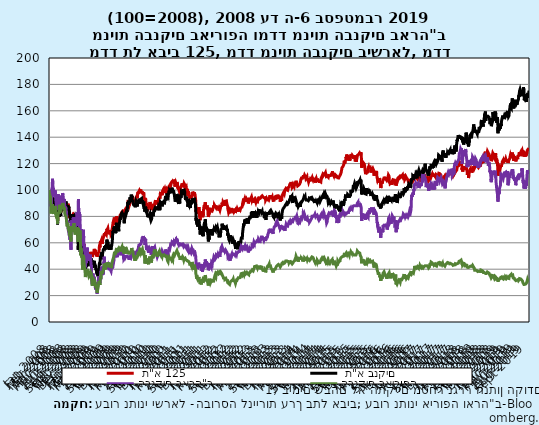
| Category |  ת"א 125 |  ת"א בנקים | הבנקים בארה"ב | הבנקים באירופה |
|---|---|---|---|---|
| 2008-01-01 | 100 | 100 | 100 | 100 |
| 2008-01-02 | 99.621 | 100.549 | 97.506 | 100 |
| 2008-01-03 | 98.326 | 98.384 | 97.212 | 99.514 |
| 2008-01-04 | 98.326 | 98.384 | 93.962 | 97.54 |
| 2008-01-05 | 98.326 | 98.384 | 93.962 | 97.54 |
| 2008-01-06 | 96.03 | 96.803 | 93.962 | 97.54 |
| 2008-01-07 | 95.8 | 96.659 | 94.774 | 97.025 |
| 2008-01-08 | 96.655 | 98.973 | 90.959 | 96.715 |
| 2008-01-09 | 95.683 | 98.561 | 92.573 | 95.43 |
| 2008-01-10 | 93.842 | 96.848 | 94.549 | 94.462 |
| 2008-01-11 | 93.842 | 96.848 | 94.853 | 95.182 |
| 2008-01-12 | 93.842 | 96.848 | 94.853 | 95.182 |
| 2008-01-13 | 94.18 | 96.907 | 94.853 | 95.182 |
| 2008-01-14 | 94.947 | 97.559 | 95.068 | 95.432 |
| 2008-01-15 | 93.327 | 94.711 | 91.072 | 92.147 |
| 2008-01-16 | 92.148 | 94.159 | 93.273 | 90.922 |
| 2008-01-17 | 91.693 | 95.107 | 88.883 | 90.478 |
| 2008-01-18 | 91.693 | 95.107 | 87.573 | 88.197 |
| 2008-01-19 | 91.693 | 95.107 | 87.573 | 88.197 |
| 2008-01-20 | 92.609 | 96.919 | 87.573 | 88.197 |
| 2008-01-21 | 89.87 | 93.609 | 87.573 | 82.165 |
| 2008-01-22 | 88.421 | 92.971 | 90.451 | 86.096 |
| 2008-01-23 | 85.776 | 90.502 | 97.709 | 84.165 |
| 2008-01-24 | 86.411 | 89.916 | 99.526 | 89.274 |
| 2008-01-25 | 86.411 | 89.916 | 97.585 | 88.216 |
| 2008-01-26 | 86.411 | 89.916 | 97.585 | 88.216 |
| 2008-01-27 | 85.432 | 88.485 | 97.585 | 88.216 |
| 2008-01-28 | 85.325 | 89.534 | 101.117 | 87.176 |
| 2008-01-29 | 87.551 | 91.83 | 103.149 | 89.115 |
| 2008-01-30 | 87.364 | 91.728 | 102.878 | 88.731 |
| 2008-01-31 | 86.235 | 92.543 | 106.535 | 87.451 |
| 2008-02-01 | 86.235 | 92.543 | 108.476 | 88.972 |
| 2008-02-02 | 86.235 | 92.543 | 108.476 | 88.972 |
| 2008-02-03 | 88.164 | 94.413 | 108.476 | 88.972 |
| 2008-02-04 | 87.597 | 92.685 | 104.018 | 89.169 |
| 2008-02-05 | 86.625 | 90.806 | 100.147 | 85.636 |
| 2008-02-06 | 86.306 | 90.575 | 99.673 | 85.415 |
| 2008-02-07 | 85.064 | 91.23 | 101.682 | 83.96 |
| 2008-02-08 | 85.064 | 91.23 | 99.345 | 83.55 |
| 2008-02-09 | 85.064 | 91.23 | 99.345 | 83.55 |
| 2008-02-10 | 84.581 | 90.545 | 99.345 | 83.55 |
| 2008-02-11 | 84.777 | 89.811 | 98.239 | 81.788 |
| 2008-02-12 | 86.499 | 91.452 | 99.707 | 84.995 |
| 2008-02-13 | 87.622 | 92.22 | 100.293 | 85.503 |
| 2008-02-14 | 87.96 | 92.601 | 98.047 | 84.735 |
| 2008-02-15 | 87.96 | 92.601 | 98.792 | 82.208 |
| 2008-02-16 | 87.96 | 92.601 | 98.792 | 82.208 |
| 2008-02-17 | 87.208 | 93.166 | 98.792 | 82.208 |
| 2008-02-18 | 87.571 | 93.693 | 98.792 | 84.28 |
| 2008-02-19 | 88.327 | 93.781 | 97.573 | 84.225 |
| 2008-02-20 | 87.262 | 92.357 | 99.142 | 83.462 |
| 2008-02-21 | 88.365 | 92.304 | 97.257 | 83.996 |
| 2008-02-22 | 88.365 | 92.304 | 98.95 | 83.314 |
| 2008-02-23 | 88.365 | 92.304 | 98.95 | 83.314 |
| 2008-02-24 | 89.371 | 92.857 | 98.95 | 83.314 |
| 2008-02-25 | 89.312 | 92.303 | 99.718 | 85.493 |
| 2008-02-26 | 89.816 | 91.622 | 99.819 | 87.949 |
| 2008-02-27 | 89.603 | 91.379 | 100.135 | 87.42 |
| 2008-02-28 | 88.859 | 90.96 | 96.67 | 85.527 |
| 2008-02-29 | 88.859 | 90.96 | 92.63 | 83.925 |
| 2008-03-01 | 88.859 | 90.96 | 92.63 | 83.925 |
| 2008-03-02 | 85.861 | 87.226 | 92.63 | 83.925 |
| 2008-03-03 | 86.21 | 86.438 | 91.196 | 82.537 |
| 2008-03-04 | 85.646 | 86.367 | 90.587 | 81.002 |
| 2008-03-05 | 86.898 | 87.144 | 89.752 | 82.275 |
| 2008-03-06 | 85.786 | 85.005 | 86.512 | 80.041 |
| 2008-03-07 | 85.786 | 85.005 | 86.998 | 79.562 |
| 2008-03-08 | 85.786 | 85.005 | 86.998 | 79.562 |
| 2008-03-09 | 83.374 | 83.485 | 86.998 | 79.562 |
| 2008-03-10 | 83.344 | 83.561 | 85 | 78.541 |
| 2008-03-11 | 82.924 | 83.792 | 92.698 | 81.095 |
| 2008-03-12 | 84.091 | 86.334 | 90.395 | 83.004 |
| 2008-03-13 | 81.034 | 82.682 | 90.756 | 80.725 |
| 2008-03-14 | 81.034 | 82.682 | 86.919 | 79.106 |
| 2008-03-15 | 81.034 | 82.682 | 86.919 | 79.106 |
| 2008-03-16 | 79.251 | 78.948 | 86.919 | 79.106 |
| 2008-03-17 | 76.035 | 73.952 | 85.576 | 74.284 |
| 2008-03-18 | 77.248 | 75.483 | 91.772 | 78.868 |
| 2008-03-19 | 78.801 | 78.44 | 90.214 | 78.596 |
| 2008-03-20 | 78.324 | 81.428 | 96.896 | 79.261 |
| 2008-03-21 | 78.324 | 81.428 | 96.896 | 79.261 |
| 2008-03-22 | 78.324 | 81.428 | 96.896 | 79.261 |
| 2008-03-23 | 81.586 | 85.967 | 96.896 | 79.261 |
| 2008-03-24 | 81.326 | 84.98 | 97.302 | 79.261 |
| 2008-03-25 | 82.655 | 85.179 | 96.874 | 83.026 |
| 2008-03-26 | 82.029 | 84.528 | 92.991 | 81.81 |
| 2008-03-27 | 81.716 | 83.111 | 91.016 | 83.011 |
| 2008-03-28 | 81.716 | 83.111 | 88.781 | 82.539 |
| 2008-03-29 | 81.716 | 83.111 | 88.781 | 82.539 |
| 2008-03-30 | 79.691 | 80.707 | 88.781 | 82.539 |
| 2008-03-31 | 79.754 | 79.631 | 89.097 | 82.001 |
| 2008-04-01 | 81.13 | 80.808 | 95.756 | 86.566 |
| 2008-04-02 | 84.054 | 84.261 | 94.887 | 88.747 |
| 2008-04-03 | 83.463 | 83.242 | 95.169 | 87.11 |
| 2008-04-04 | 83.463 | 83.242 | 93.059 | 87.038 |
| 2008-04-05 | 83.463 | 83.242 | 93.059 | 87.038 |
| 2008-04-06 | 84.615 | 82.761 | 93.059 | 87.038 |
| 2008-04-07 | 84.541 | 81.561 | 94.526 | 88.156 |
| 2008-04-08 | 84.551 | 83.302 | 92.494 | 87.362 |
| 2008-04-09 | 85.366 | 84.587 | 90.813 | 86.139 |
| 2008-04-10 | 85.025 | 83.618 | 90.553 | 85.238 |
| 2008-04-11 | 85.025 | 83.618 | 89.074 | 84.101 |
| 2008-04-12 | 85.025 | 83.618 | 89.074 | 84.101 |
| 2008-04-13 | 83.841 | 81.577 | 89.074 | 84.101 |
| 2008-04-14 | 83.764 | 80.356 | 85.305 | 83.042 |
| 2008-04-15 | 84.788 | 81.697 | 86.433 | 82.978 |
| 2008-04-16 | 86.123 | 83.854 | 89.357 | 84.85 |
| 2008-04-17 | 86.698 | 83.611 | 90.847 | 84.952 |
| 2008-04-18 | 86.698 | 83.611 | 92.133 | 88.049 |
| 2008-04-19 | 86.698 | 83.611 | 92.133 | 88.049 |
| 2008-04-20 | 86.698 | 83.611 | 92.133 | 88.049 |
| 2008-04-21 | 87.359 | 86.01 | 89.605 | 86.373 |
| 2008-04-22 | 87.509 | 85.728 | 89.515 | 85.55 |
| 2008-04-23 | 87.159 | 84.271 | 88.747 | 85.083 |
| 2008-04-24 | 87.55 | 85.02 | 92.619 | 85.617 |
| 2008-04-25 | 87.55 | 85.02 | 94.898 | 87.086 |
| 2008-04-26 | 87.55 | 85.02 | 94.898 | 87.086 |
| 2008-04-27 | 86.879 | 85.617 | 94.898 | 87.086 |
| 2008-04-28 | 86.23 | 85.457 | 95.09 | 87.968 |
| 2008-04-29 | 85.211 | 85.463 | 94.368 | 87.253 |
| 2008-04-30 | 85.607 | 85.892 | 93.476 | 87.648 |
| 2008-05-01 | 85.113 | 86.326 | 97.573 | 87.849 |
| 2008-05-02 | 85.113 | 86.326 | 97.393 | 90.185 |
| 2008-05-03 | 85.113 | 86.326 | 97.393 | 90.185 |
| 2008-05-04 | 87.688 | 89.323 | 97.393 | 90.185 |
| 2008-05-05 | 87.4 | 88.277 | 96.298 | 89.818 |
| 2008-05-06 | 86.688 | 86.65 | 96.986 | 88.726 |
| 2008-05-07 | 86.688 | 86.65 | 93.555 | 89.203 |
| 2008-05-08 | 86.688 | 86.65 | 92.144 | 88.142 |
| 2008-05-09 | 86.688 | 86.65 | 91.456 | 86.64 |
| 2008-05-10 | 86.688 | 86.65 | 91.456 | 86.64 |
| 2008-05-11 | 86.222 | 86.244 | 91.456 | 86.64 |
| 2008-05-12 | 86.835 | 86.574 | 93.318 | 86.642 |
| 2008-05-13 | 86.94 | 87.409 | 91.332 | 86.294 |
| 2008-05-14 | 88.348 | 87.748 | 91.998 | 86.328 |
| 2008-05-15 | 88.216 | 88.656 | 93.228 | 86.311 |
| 2008-05-16 | 88.216 | 88.656 | 91.117 | 85.92 |
| 2008-05-17 | 88.216 | 88.656 | 91.117 | 85.92 |
| 2008-05-18 | 87.72 | 89.375 | 91.117 | 85.92 |
| 2008-05-19 | 88.71 | 90.177 | 90.745 | 85.355 |
| 2008-05-20 | 87.153 | 88.573 | 88.634 | 83.917 |
| 2008-05-21 | 88.146 | 90.599 | 86.591 | 82.003 |
| 2008-05-22 | 87.849 | 89.758 | 87.686 | 82.225 |
| 2008-05-23 | 87.849 | 89.758 | 86.005 | 81.15 |
| 2008-05-24 | 87.849 | 89.758 | 86.005 | 81.15 |
| 2008-05-25 | 86.642 | 88.181 | 86.005 | 81.15 |
| 2008-05-26 | 86.621 | 87.069 | 86.005 | 80.618 |
| 2008-05-27 | 87.841 | 87.944 | 86.851 | 80.501 |
| 2008-05-28 | 88.219 | 88.42 | 85.372 | 80.782 |
| 2008-05-29 | 89.003 | 90.366 | 86.727 | 80.353 |
| 2008-05-30 | 89.003 | 90.366 | 85.632 | 80.835 |
| 2008-05-31 | 89.003 | 90.366 | 85.632 | 80.835 |
| 2008-06-01 | 89.152 | 91.359 | 85.632 | 80.835 |
| 2008-06-02 | 88.222 | 89.62 | 84.063 | 79.314 |
| 2008-06-03 | 88.801 | 89.714 | 83.014 | 79.564 |
| 2008-06-04 | 88.136 | 88.636 | 81.806 | 78.928 |
| 2008-06-05 | 88.873 | 87.595 | 82.935 | 78.799 |
| 2008-06-06 | 88.873 | 87.595 | 78.578 | 76.014 |
| 2008-06-07 | 88.873 | 87.595 | 78.578 | 76.014 |
| 2008-06-08 | 88.873 | 87.595 | 78.578 | 76.014 |
| 2008-06-09 | 88.873 | 87.595 | 76.038 | 74.555 |
| 2008-06-10 | 87.415 | 86.688 | 77.122 | 74.474 |
| 2008-06-11 | 87.37 | 86.136 | 74.334 | 72.367 |
| 2008-06-12 | 87.712 | 87.273 | 75.09 | 74.155 |
| 2008-06-13 | 87.712 | 87.273 | 75.203 | 75.027 |
| 2008-06-14 | 87.712 | 87.273 | 75.203 | 75.027 |
| 2008-06-15 | 88.196 | 88.458 | 75.203 | 75.027 |
| 2008-06-16 | 88.24 | 87.788 | 76.287 | 74.615 |
| 2008-06-17 | 89.564 | 89.137 | 73.476 | 75.297 |
| 2008-06-18 | 89.105 | 87.58 | 71.343 | 73.409 |
| 2008-06-19 | 89.105 | 87.58 | 71.637 | 72.202 |
| 2008-06-20 | 89.105 | 87.58 | 70.79 | 70.939 |
| 2008-06-21 | 89.105 | 87.58 | 70.79 | 70.939 |
| 2008-06-22 | 87.878 | 86.958 | 70.79 | 70.939 |
| 2008-06-23 | 88.426 | 87.544 | 68.702 | 70.09 |
| 2008-06-24 | 87.366 | 86.195 | 70.418 | 70.288 |
| 2008-06-25 | 87.891 | 87.387 | 70.677 | 72.41 |
| 2008-06-26 | 85.964 | 85.052 | 67.946 | 69.191 |
| 2008-06-27 | 85.964 | 85.052 | 66.896 | 68.619 |
| 2008-06-28 | 85.964 | 85.052 | 66.896 | 68.619 |
| 2008-06-29 | 84.659 | 84.862 | 66.896 | 68.619 |
| 2008-06-30 | 84.863 | 84.371 | 65.609 | 68.011 |
| 2008-07-01 | 84.863 | 84.371 | 66.874 | 65.992 |
| 2008-07-02 | 83.071 | 83.021 | 65.44 | 66.314 |
| 2008-07-03 | 80.044 | 80.646 | 64.673 | 67.93 |
| 2008-07-04 | 80.044 | 80.646 | 64.673 | 65.916 |
| 2008-07-05 | 80.044 | 80.646 | 64.673 | 65.916 |
| 2008-07-06 | 78.762 | 79.846 | 64.673 | 65.916 |
| 2008-07-07 | 79.948 | 80.483 | 62.269 | 65.975 |
| 2008-07-08 | 79.164 | 79.232 | 67.02 | 64.702 |
| 2008-07-09 | 80.065 | 79.7 | 63.194 | 66.807 |
| 2008-07-10 | 79.656 | 77.829 | 63.115 | 65.687 |
| 2008-07-11 | 79.656 | 77.829 | 61.704 | 62.836 |
| 2008-07-12 | 79.656 | 77.829 | 61.704 | 62.836 |
| 2008-07-13 | 77.938 | 77.71 | 61.704 | 62.836 |
| 2008-07-14 | 78.752 | 78.55 | 56.445 | 63.455 |
| 2008-07-15 | 76.847 | 76.729 | 54.707 | 61.04 |
| 2008-07-16 | 76.596 | 75.275 | 64.153 | 62.013 |
| 2008-07-17 | 78.745 | 78.92 | 70.192 | 65.541 |
| 2008-07-18 | 78.745 | 78.92 | 70.858 | 68.762 |
| 2008-07-19 | 78.745 | 78.92 | 70.858 | 68.762 |
| 2008-07-20 | 79.715 | 81.259 | 70.858 | 68.762 |
| 2008-07-21 | 80.699 | 80.199 | 70.135 | 69.406 |
| 2008-07-22 | 80.215 | 78.89 | 76.4 | 68.428 |
| 2008-07-23 | 81.612 | 80.775 | 77.19 | 72.622 |
| 2008-07-24 | 80.779 | 80.451 | 72.02 | 72.171 |
| 2008-07-25 | 80.779 | 80.451 | 71.332 | 71.006 |
| 2008-07-26 | 80.779 | 80.451 | 71.332 | 71.006 |
| 2008-07-27 | 81.195 | 81.23 | 71.332 | 71.006 |
| 2008-07-28 | 80.675 | 79.809 | 68.093 | 69.132 |
| 2008-07-29 | 80.539 | 80.682 | 74.018 | 68.726 |
| 2008-07-30 | 81.323 | 81.687 | 75.824 | 69.985 |
| 2008-07-31 | 81.473 | 80.372 | 74.661 | 70.071 |
| 2008-08-01 | 81.473 | 80.372 | 75.869 | 69.573 |
| 2008-08-02 | 81.473 | 80.372 | 75.869 | 69.573 |
| 2008-08-03 | 80.668 | 79.298 | 75.869 | 69.573 |
| 2008-08-04 | 79.56 | 77.743 | 74.774 | 68.426 |
| 2008-08-05 | 80.43 | 80.175 | 78.871 | 72.35 |
| 2008-08-06 | 79.885 | 79.323 | 78.454 | 73.194 |
| 2008-08-07 | 79.77 | 79.753 | 74.526 | 72.72 |
| 2008-08-08 | 79.77 | 79.753 | 77.099 | 73.208 |
| 2008-08-09 | 79.77 | 79.753 | 77.099 | 73.208 |
| 2008-08-10 | 79.77 | 79.753 | 77.099 | 73.208 |
| 2008-08-11 | 79.844 | 80.07 | 79.537 | 74.808 |
| 2008-08-12 | 79.548 | 80.13 | 74.413 | 74.005 |
| 2008-08-13 | 78.843 | 78.511 | 71.354 | 70.417 |
| 2008-08-14 | 79.975 | 79.022 | 73.612 | 70.681 |
| 2008-08-15 | 79.975 | 79.022 | 74.684 | 71.122 |
| 2008-08-16 | 79.975 | 79.022 | 74.684 | 71.122 |
| 2008-08-17 | 80.442 | 80.565 | 74.684 | 71.122 |
| 2008-08-18 | 80.747 | 79.717 | 71.761 | 70.872 |
| 2008-08-19 | 80.054 | 78.602 | 69.323 | 67.804 |
| 2008-08-20 | 80.96 | 78.489 | 70.903 | 67.632 |
| 2008-08-21 | 80.213 | 78.652 | 70.068 | 66.199 |
| 2008-08-22 | 80.213 | 78.652 | 72.28 | 68.3 |
| 2008-08-23 | 80.213 | 78.652 | 72.28 | 68.3 |
| 2008-08-24 | 81.184 | 80.311 | 72.28 | 68.3 |
| 2008-08-25 | 81.072 | 80.195 | 69.819 | 67.711 |
| 2008-08-26 | 80.6 | 79.036 | 70.271 | 67.751 |
| 2008-08-27 | 80.284 | 77.868 | 71.354 | 67.749 |
| 2008-08-28 | 79.27 | 76.017 | 74.537 | 69.923 |
| 2008-08-29 | 79.27 | 76.017 | 74.526 | 70.417 |
| 2008-08-30 | 79.27 | 76.017 | 74.526 | 70.417 |
| 2008-08-31 | 78.914 | 74.817 | 74.526 | 70.417 |
| 2008-09-01 | 78.142 | 73.666 | 74.526 | 70.257 |
| 2008-09-02 | 78.902 | 75.195 | 76.67 | 71.909 |
| 2008-09-03 | 77.841 | 74.177 | 77.822 | 71.38 |
| 2008-09-04 | 77.417 | 72.387 | 74.108 | 68.831 |
| 2008-09-05 | 77.417 | 72.387 | 77.686 | 67.315 |
| 2008-09-06 | 77.417 | 72.387 | 77.686 | 67.315 |
| 2008-09-07 | 78.537 | 75.328 | 77.686 | 67.315 |
| 2008-09-08 | 78.234 | 74.686 | 83.07 | 71.931 |
| 2008-09-09 | 76.681 | 72.815 | 78.126 | 72.529 |
| 2008-09-10 | 75.98 | 72.5 | 77.02 | 70.731 |
| 2008-09-11 | 73.976 | 69.937 | 79.142 | 69.415 |
| 2008-09-12 | 73.976 | 69.937 | 80.147 | 70.36 |
| 2008-09-13 | 73.976 | 69.937 | 80.147 | 70.36 |
| 2008-09-14 | 73.296 | 68.014 | 80.147 | 70.36 |
| 2008-09-15 | 72.189 | 66.302 | 73.397 | 65.999 |
| 2008-09-16 | 68.058 | 62.48 | 78.736 | 63.16 |
| 2008-09-17 | 65.962 | 57.285 | 72.698 | 60.542 |
| 2008-09-18 | 65.164 | 54.695 | 82.731 | 60.399 |
| 2008-09-19 | 65.164 | 54.695 | 93.172 | 70.944 |
| 2008-09-20 | 65.164 | 54.695 | 93.172 | 70.944 |
| 2008-09-21 | 71.86 | 64.795 | 93.172 | 70.944 |
| 2008-09-22 | 68.686 | 61.433 | 83.386 | 68.445 |
| 2008-09-23 | 67.784 | 60.426 | 80.801 | 66.607 |
| 2008-09-24 | 68.115 | 60.509 | 79.549 | 66.915 |
| 2008-09-25 | 69.847 | 63.248 | 81.275 | 68.581 |
| 2008-09-26 | 69.847 | 63.248 | 83.363 | 67.275 |
| 2008-09-27 | 69.847 | 63.248 | 83.363 | 67.275 |
| 2008-09-28 | 69.077 | 62.209 | 83.363 | 67.275 |
| 2008-09-29 | 69.077 | 62.209 | 66.005 | 62.063 |
| 2008-09-30 | 69.077 | 62.209 | 76.422 | 62.757 |
| 2008-10-01 | 69.077 | 62.209 | 81.716 | 64.674 |
| 2008-10-02 | 65.388 | 59.755 | 79.131 | 65.231 |
| 2008-10-03 | 65.388 | 59.755 | 76.219 | 69.308 |
| 2008-10-04 | 65.388 | 59.755 | 76.219 | 69.308 |
| 2008-10-05 | 60.76 | 55.159 | 76.219 | 69.308 |
| 2008-10-06 | 58.848 | 53.011 | 71.975 | 63.1 |
| 2008-10-07 | 61.565 | 56.438 | 64.3 | 60.635 |
| 2008-10-08 | 61.565 | 56.438 | 62.449 | 56.814 |
| 2008-10-09 | 61.565 | 56.438 | 55.023 | 56.387 |
| 2008-10-10 | 61.565 | 56.438 | 59.684 | 50.527 |
| 2008-10-11 | 61.565 | 56.438 | 59.684 | 50.527 |
| 2008-10-12 | 58.742 | 55.39 | 59.684 | 50.527 |
| 2008-10-13 | 58.742 | 55.39 | 62.731 | 54.379 |
| 2008-10-14 | 58.742 | 55.39 | 70.361 | 55.781 |
| 2008-10-15 | 59.789 | 55.817 | 65.271 | 52.251 |
| 2008-10-16 | 57.932 | 54.56 | 66.964 | 49.006 |
| 2008-10-17 | 57.932 | 54.56 | 64.605 | 49.938 |
| 2008-10-18 | 57.932 | 54.56 | 64.605 | 49.938 |
| 2008-10-19 | 61.187 | 57.902 | 64.605 | 49.938 |
| 2008-10-20 | 61.187 | 57.902 | 65.35 | 51.359 |
| 2008-10-21 | 61.187 | 57.902 | 64.966 | 51.385 |
| 2008-10-22 | 58.933 | 54.827 | 61.208 | 48.732 |
| 2008-10-23 | 58.839 | 53.854 | 60.316 | 47.723 |
| 2008-10-24 | 58.839 | 53.854 | 58.014 | 43.542 |
| 2008-10-25 | 58.839 | 53.854 | 58.014 | 43.542 |
| 2008-10-26 | 56.968 | 52.695 | 58.014 | 43.542 |
| 2008-10-27 | 55.008 | 50.433 | 57.698 | 41.041 |
| 2008-10-28 | 54.104 | 49.413 | 65.203 | 39.615 |
| 2008-10-29 | 55.284 | 49.162 | 62.856 | 44.29 |
| 2008-10-30 | 55.488 | 48.442 | 63.262 | 46.627 |
| 2008-10-31 | 55.488 | 48.442 | 66.061 | 47.726 |
| 2008-11-01 | 55.488 | 48.442 | 66.061 | 47.726 |
| 2008-11-02 | 57.335 | 50.238 | 66.061 | 47.726 |
| 2008-11-03 | 58.121 | 51.642 | 66.479 | 47.478 |
| 2008-11-04 | 60.577 | 55.229 | 69.921 | 50.36 |
| 2008-11-05 | 59.856 | 55.16 | 63.815 | 49.864 |
| 2008-11-06 | 57.082 | 53.691 | 60.056 | 46.999 |
| 2008-11-07 | 57.082 | 53.691 | 60.632 | 47.223 |
| 2008-11-08 | 57.082 | 53.691 | 60.632 | 47.223 |
| 2008-11-09 | 59.043 | 55.668 | 60.632 | 47.223 |
| 2008-11-10 | 58.952 | 56.612 | 58.871 | 46.481 |
| 2008-11-11 | 56.679 | 54.698 | 57.788 | 43.158 |
| 2008-11-12 | 54.186 | 51.638 | 54.131 | 41.217 |
| 2008-11-13 | 51.147 | 48.57 | 57.709 | 40.459 |
| 2008-11-14 | 51.147 | 48.57 | 54.628 | 40.667 |
| 2008-11-15 | 51.147 | 48.57 | 54.628 | 40.667 |
| 2008-11-16 | 50.469 | 47.318 | 54.628 | 40.667 |
| 2008-11-17 | 49.591 | 45.53 | 52.054 | 38.826 |
| 2008-11-18 | 50.259 | 45.758 | 51.558 | 37.865 |
| 2008-11-19 | 50.308 | 45.961 | 45.847 | 35.052 |
| 2008-11-20 | 47.629 | 44.237 | 41.445 | 34.044 |
| 2008-11-21 | 47.629 | 44.237 | 41.659 | 33.669 |
| 2008-11-22 | 47.629 | 44.237 | 41.659 | 33.669 |
| 2008-11-23 | 44.492 | 40.494 | 41.659 | 33.669 |
| 2008-11-24 | 47.504 | 42.749 | 49.041 | 36.461 |
| 2008-11-25 | 49.884 | 45.853 | 50.406 | 38.111 |
| 2008-11-26 | 48.592 | 45.391 | 52.381 | 38.221 |
| 2008-11-27 | 49.447 | 44.275 | 52.381 | 39.82 |
| 2008-11-28 | 49.447 | 44.275 | 54.029 | 40.307 |
| 2008-11-29 | 49.447 | 44.275 | 54.029 | 40.307 |
| 2008-11-30 | 50.955 | 45.268 | 54.029 | 40.307 |
| 2008-12-01 | 48.818 | 43.134 | 44.616 | 37.451 |
| 2008-12-02 | 49.345 | 43.068 | 48.115 | 38.154 |
| 2008-12-03 | 48.495 | 41.899 | 50.711 | 38.08 |
| 2008-12-04 | 49.96 | 43.593 | 50.045 | 38.285 |
| 2008-12-05 | 49.96 | 43.593 | 53.409 | 36.862 |
| 2008-12-06 | 49.96 | 43.593 | 53.409 | 36.862 |
| 2008-12-07 | 51.488 | 46.124 | 53.409 | 36.862 |
| 2008-12-08 | 53.442 | 49.327 | 56.354 | 40.185 |
| 2008-12-09 | 53.664 | 49.869 | 53.307 | 40.621 |
| 2008-12-10 | 53.905 | 50.821 | 52.754 | 40.519 |
| 2008-12-11 | 52.872 | 49.465 | 48.025 | 39.92 |
| 2008-12-12 | 52.872 | 49.465 | 48.747 | 37.768 |
| 2008-12-13 | 52.872 | 49.465 | 48.747 | 37.768 |
| 2008-12-14 | 50.887 | 47.367 | 48.747 | 37.768 |
| 2008-12-15 | 49.615 | 45.826 | 46.761 | 37.067 |
| 2008-12-16 | 50.883 | 46.642 | 51.614 | 37.403 |
| 2008-12-17 | 51.346 | 47.615 | 50.767 | 35.908 |
| 2008-12-18 | 51.79 | 47.877 | 49.345 | 35.303 |
| 2008-12-19 | 51.79 | 47.877 | 48.894 | 35.319 |
| 2008-12-20 | 51.79 | 47.877 | 48.894 | 35.319 |
| 2008-12-21 | 50.534 | 46.455 | 48.894 | 35.319 |
| 2008-12-22 | 49.708 | 44.985 | 47.302 | 34.406 |
| 2008-12-23 | 48.515 | 43.644 | 46.354 | 34.645 |
| 2008-12-24 | 47.307 | 42.386 | 47.506 | 34.659 |
| 2008-12-25 | 47.468 | 42.799 | 47.506 | 34.659 |
| 2008-12-26 | 47.468 | 42.799 | 47.348 | 34.659 |
| 2008-12-27 | 47.468 | 42.799 | 47.348 | 34.659 |
| 2008-12-28 | 46.552 | 41.672 | 47.348 | 34.659 |
| 2008-12-29 | 47.019 | 41.665 | 46.772 | 34.981 |
| 2008-12-30 | 47.597 | 42.816 | 48.465 | 35.643 |
| 2008-12-31 | 48.476 | 43.872 | 50.023 | 36.025 |
| 2009-01-01 | 50.257 | 44.847 | 50.023 | 36.025 |
| 2009-01-02 | 50.257 | 44.847 | 50.993 | 37.231 |
| 2009-01-03 | 50.257 | 44.847 | 50.993 | 37.231 |
| 2009-01-04 | 50.76 | 45.698 | 50.993 | 37.231 |
| 2009-01-05 | 51.063 | 46.757 | 49.12 | 37.992 |
| 2009-01-06 | 53.129 | 48.474 | 49.786 | 38.662 |
| 2009-01-07 | 52.477 | 48.404 | 47.133 | 38.545 |
| 2009-01-08 | 51.122 | 46.434 | 46.964 | 38.151 |
| 2009-01-09 | 51.122 | 46.434 | 44.977 | 37.973 |
| 2009-01-10 | 51.122 | 46.434 | 44.977 | 37.973 |
| 2009-01-11 | 52.528 | 47.982 | 44.977 | 37.973 |
| 2009-01-12 | 52.156 | 47.672 | 42.235 | 37.67 |
| 2009-01-13 | 51.912 | 47.363 | 43.002 | 36.571 |
| 2009-01-14 | 50.242 | 45.399 | 40.406 | 33.693 |
| 2009-01-15 | 50.739 | 45.779 | 37.156 | 32.671 |
| 2009-01-16 | 50.739 | 45.779 | 35.621 | 32.203 |
| 2009-01-17 | 50.739 | 45.779 | 35.621 | 32.203 |
| 2009-01-18 | 52.394 | 46.917 | 35.621 | 32.203 |
| 2009-01-19 | 51.586 | 45.361 | 35.621 | 29.569 |
| 2009-01-20 | 51.619 | 45.057 | 28.6 | 27.423 |
| 2009-01-21 | 50.097 | 42.344 | 32.765 | 28.119 |
| 2009-01-22 | 49.224 | 41.131 | 30.824 | 28.232 |
| 2009-01-23 | 49.224 | 41.131 | 32.099 | 27.888 |
| 2009-01-24 | 49.224 | 41.131 | 32.099 | 27.888 |
| 2009-01-25 | 49.745 | 40.677 | 32.099 | 27.888 |
| 2009-01-26 | 50.697 | 42.268 | 31.129 | 29.934 |
| 2009-01-27 | 50.619 | 41.176 | 32.144 | 30.086 |
| 2009-01-28 | 52.227 | 42.758 | 36.772 | 33.512 |
| 2009-01-29 | 51.559 | 41.961 | 33.725 | 32.308 |
| 2009-01-30 | 51.559 | 41.961 | 32.415 | 32.516 |
| 2009-01-31 | 51.559 | 41.961 | 32.415 | 32.516 |
| 2009-02-01 | 51.362 | 41.881 | 32.415 | 32.516 |
| 2009-02-02 | 51.051 | 41.526 | 32.19 | 30.794 |
| 2009-02-03 | 51.951 | 43.112 | 30.53 | 30.983 |
| 2009-02-04 | 53.138 | 44.46 | 30.079 | 32.077 |
| 2009-02-05 | 53.571 | 44.044 | 30.621 | 31.641 |
| 2009-02-06 | 53.571 | 44.044 | 34.278 | 32.42 |
| 2009-02-07 | 53.571 | 44.044 | 34.278 | 32.42 |
| 2009-02-08 | 55.391 | 46.333 | 34.278 | 32.42 |
| 2009-02-09 | 55.362 | 46.396 | 35.034 | 32.754 |
| 2009-02-10 | 55.362 | 46.396 | 30.181 | 31.893 |
| 2009-02-11 | 53.927 | 44.348 | 31.998 | 31.405 |
| 2009-02-12 | 53.762 | 43.881 | 31.117 | 30.918 |
| 2009-02-13 | 53.762 | 43.881 | 29.47 | 30.492 |
| 2009-02-14 | 53.762 | 43.881 | 29.47 | 30.492 |
| 2009-02-15 | 53.774 | 43.458 | 29.47 | 30.492 |
| 2009-02-16 | 54.065 | 44.164 | 29.47 | 29.495 |
| 2009-02-17 | 53.311 | 42.953 | 26.512 | 27.686 |
| 2009-02-18 | 54.125 | 43.335 | 26.433 | 27.852 |
| 2009-02-19 | 53.879 | 42.647 | 24.639 | 27.934 |
| 2009-02-20 | 53.879 | 42.647 | 24.492 | 26.129 |
| 2009-02-21 | 53.879 | 42.647 | 24.492 | 26.129 |
| 2009-02-22 | 51.786 | 40.303 | 24.492 | 26.129 |
| 2009-02-23 | 51.822 | 39.894 | 24.492 | 25.762 |
| 2009-02-24 | 50.862 | 39.226 | 27.822 | 25.578 |
| 2009-02-25 | 51.318 | 39.79 | 28.499 | 26.079 |
| 2009-02-26 | 51.879 | 40.339 | 29.876 | 28.224 |
| 2009-02-27 | 51.879 | 40.339 | 27.269 | 26.861 |
| 2009-02-28 | 51.879 | 40.339 | 27.269 | 26.861 |
| 2009-03-01 | 49.834 | 38.246 | 27.269 | 26.861 |
| 2009-03-02 | 49.767 | 37.017 | 25.519 | 24.179 |
| 2009-03-03 | 49.941 | 37.124 | 25.102 | 23.711 |
| 2009-03-04 | 51.103 | 38.104 | 24.278 | 24.522 |
| 2009-03-05 | 49.664 | 36.369 | 21.411 | 22.81 |
| 2009-03-06 | 49.664 | 36.369 | 21.016 | 22.028 |
| 2009-03-07 | 49.664 | 36.369 | 21.016 | 22.028 |
| 2009-03-08 | 49.473 | 36.212 | 21.016 | 22.028 |
| 2009-03-09 | 49.509 | 35.61 | 22.122 | 21.53 |
| 2009-03-10 | 49.509 | 35.61 | 25.564 | 24.255 |
| 2009-03-11 | 50.734 | 36.795 | 26.343 | 24.627 |
| 2009-03-12 | 50.487 | 35.808 | 29.3 | 25.361 |
| 2009-03-13 | 50.487 | 35.808 | 28.883 | 26.007 |
| 2009-03-14 | 50.487 | 35.808 | 28.883 | 26.007 |
| 2009-03-15 | 52.226 | 37.94 | 28.883 | 26.007 |
| 2009-03-16 | 52.242 | 38.178 | 28.837 | 27.454 |
| 2009-03-17 | 52.239 | 39.01 | 30.598 | 27.614 |
| 2009-03-18 | 52.181 | 39.296 | 34.007 | 27.919 |
| 2009-03-19 | 52.389 | 39.95 | 30.926 | 28.961 |
| 2009-03-20 | 52.389 | 39.95 | 29.391 | 28.727 |
| 2009-03-21 | 52.389 | 39.95 | 29.391 | 28.727 |
| 2009-03-22 | 53.03 | 41.052 | 29.391 | 28.727 |
| 2009-03-23 | 54.268 | 42.681 | 34.853 | 30.93 |
| 2009-03-24 | 54.371 | 42.453 | 32.28 | 30.525 |
| 2009-03-25 | 56.237 | 43.708 | 33.871 | 30.332 |
| 2009-03-26 | 58.205 | 45.098 | 34.029 | 31.002 |
| 2009-03-27 | 58.205 | 45.098 | 32.912 | 30.718 |
| 2009-03-28 | 58.205 | 45.098 | 32.912 | 30.718 |
| 2009-03-29 | 58.532 | 45.788 | 32.912 | 30.718 |
| 2009-03-30 | 56.545 | 43.115 | 29.526 | 28.098 |
| 2009-03-31 | 57.246 | 44.142 | 31.761 | 29.652 |
| 2009-04-01 | 57.256 | 44.253 | 32.912 | 30.799 |
| 2009-04-02 | 60.15 | 48.21 | 33.499 | 33.662 |
| 2009-04-03 | 60.15 | 48.21 | 34.752 | 33.569 |
| 2009-04-04 | 60.15 | 48.21 | 34.752 | 33.569 |
| 2009-04-05 | 61.05 | 49.973 | 34.752 | 33.569 |
| 2009-04-06 | 59.513 | 48.739 | 33.42 | 33.472 |
| 2009-04-07 | 59.441 | 48.53 | 32.257 | 32.675 |
| 2009-04-08 | 59.441 | 48.53 | 31.772 | 33.042 |
| 2009-04-09 | 59.441 | 48.53 | 38.16 | 35.236 |
| 2009-04-10 | 59.441 | 48.53 | 38.16 | 35.236 |
| 2009-04-11 | 59.441 | 48.53 | 38.16 | 35.236 |
| 2009-04-12 | 61.733 | 51.016 | 38.16 | 35.236 |
| 2009-04-13 | 61.577 | 51.083 | 41.163 | 35.236 |
| 2009-04-14 | 61.577 | 51.083 | 37.81 | 37.129 |
| 2009-04-15 | 61.577 | 51.083 | 39.74 | 36.473 |
| 2009-04-16 | 62.648 | 53.001 | 40.587 | 37.67 |
| 2009-04-17 | 62.648 | 53.001 | 41.975 | 38.752 |
| 2009-04-18 | 62.648 | 53.001 | 41.975 | 38.752 |
| 2009-04-19 | 61.708 | 52.014 | 41.975 | 38.752 |
| 2009-04-20 | 60.199 | 49.685 | 35.53 | 36.623 |
| 2009-04-21 | 59.258 | 47.558 | 38.42 | 36.061 |
| 2009-04-22 | 60.174 | 48.702 | 36.546 | 37.496 |
| 2009-04-23 | 61.533 | 51.706 | 37.901 | 37.219 |
| 2009-04-24 | 61.533 | 51.706 | 38.995 | 38.228 |
| 2009-04-25 | 61.533 | 51.706 | 38.995 | 38.228 |
| 2009-04-26 | 62.984 | 53.087 | 38.995 | 38.228 |
| 2009-04-27 | 62.59 | 53.289 | 37.088 | 38.18 |
| 2009-04-28 | 62.59 | 53.289 | 36.005 | 37.203 |
| 2009-04-29 | 62.59 | 53.289 | 37.81 | 38.621 |
| 2009-04-30 | 64.044 | 54.908 | 37.009 | 40.152 |
| 2009-05-01 | 64.044 | 54.908 | 36.264 | 40.216 |
| 2009-05-02 | 64.044 | 54.908 | 36.264 | 40.216 |
| 2009-05-03 | 64.332 | 55.603 | 36.264 | 40.216 |
| 2009-05-04 | 64.885 | 55.478 | 41.591 | 40.431 |
| 2009-05-05 | 65.228 | 55.304 | 40.926 | 41.899 |
| 2009-05-06 | 66.043 | 55.144 | 45.621 | 42.853 |
| 2009-05-07 | 66.122 | 55.234 | 44.041 | 42.507 |
| 2009-05-08 | 66.122 | 55.234 | 49.368 | 44.2 |
| 2009-05-09 | 66.122 | 55.234 | 49.368 | 44.2 |
| 2009-05-10 | 67.114 | 57.571 | 49.368 | 44.2 |
| 2009-05-11 | 65.264 | 56.023 | 45.869 | 43.78 |
| 2009-05-12 | 65.97 | 56.571 | 43.95 | 42.633 |
| 2009-05-13 | 64.666 | 55.621 | 41.095 | 39.837 |
| 2009-05-14 | 64.736 | 54.832 | 42.63 | 40.34 |
| 2009-05-15 | 64.736 | 54.832 | 41.366 | 40.786 |
| 2009-05-16 | 64.736 | 54.832 | 41.366 | 40.786 |
| 2009-05-17 | 64.58 | 54.797 | 41.366 | 40.786 |
| 2009-05-18 | 65.664 | 55.977 | 44.481 | 42.855 |
| 2009-05-19 | 67.403 | 58.134 | 42.957 | 44.276 |
| 2009-05-20 | 68.296 | 58.54 | 41.749 | 43.983 |
| 2009-05-21 | 67.446 | 57.114 | 41.038 | 42.962 |
| 2009-05-22 | 67.446 | 57.114 | 40.271 | 42.986 |
| 2009-05-23 | 67.446 | 57.114 | 40.271 | 42.986 |
| 2009-05-24 | 67.146 | 57.204 | 40.271 | 42.986 |
| 2009-05-25 | 67.487 | 57.608 | 40.271 | 43.029 |
| 2009-05-26 | 66.657 | 56.634 | 41.885 | 43.306 |
| 2009-05-27 | 67.978 | 58.335 | 40.282 | 43.823 |
| 2009-05-28 | 67.978 | 58.335 | 41.445 | 43.158 |
| 2009-05-29 | 67.978 | 58.335 | 42.235 | 43.685 |
| 2009-05-30 | 67.978 | 58.335 | 42.235 | 43.685 |
| 2009-05-31 | 69.436 | 60.275 | 42.235 | 43.685 |
| 2009-06-01 | 70.675 | 62.432 | 42.009 | 44.886 |
| 2009-06-02 | 70.934 | 62.274 | 41.4 | 44.352 |
| 2009-06-03 | 69.734 | 60.405 | 40.79 | 43.239 |
| 2009-06-04 | 69.566 | 60.259 | 42.754 | 43.32 |
| 2009-06-05 | 69.566 | 60.259 | 41.84 | 43.592 |
| 2009-06-06 | 69.566 | 60.259 | 41.84 | 43.592 |
| 2009-06-07 | 69.976 | 59.889 | 41.84 | 43.592 |
| 2009-06-08 | 69.727 | 58.927 | 42.381 | 43.151 |
| 2009-06-09 | 70.951 | 60.757 | 42.573 | 43.401 |
| 2009-06-10 | 70.276 | 59.442 | 42.032 | 44.438 |
| 2009-06-11 | 69.773 | 58.643 | 43.104 | 45.339 |
| 2009-06-12 | 69.773 | 58.643 | 43.589 | 45.23 |
| 2009-06-13 | 69.773 | 58.643 | 43.589 | 45.23 |
| 2009-06-14 | 69.95 | 58.269 | 43.589 | 45.23 |
| 2009-06-15 | 67.729 | 55.516 | 42.483 | 43.72 |
| 2009-06-16 | 68.121 | 56.747 | 41.456 | 43.196 |
| 2009-06-17 | 66.439 | 55.204 | 40.09 | 41.947 |
| 2009-06-18 | 66.334 | 54.771 | 41.275 | 42.619 |
| 2009-06-19 | 66.334 | 54.771 | 42.122 | 43.048 |
| 2009-06-20 | 66.334 | 54.771 | 42.122 | 43.048 |
| 2009-06-21 | 68.045 | 56.321 | 42.122 | 43.048 |
| 2009-06-22 | 67.328 | 54.789 | 39.323 | 41.544 |
| 2009-06-23 | 67.256 | 54.662 | 39.707 | 40.967 |
| 2009-06-24 | 68.559 | 56.345 | 40.158 | 42.574 |
| 2009-06-25 | 67.293 | 54.753 | 40.926 | 41.966 |
| 2009-06-26 | 67.293 | 54.753 | 41.095 | 42.042 |
| 2009-06-27 | 67.293 | 54.753 | 41.095 | 42.042 |
| 2009-06-28 | 68.742 | 56.287 | 41.095 | 42.042 |
| 2009-06-29 | 69.605 | 58.486 | 41.749 | 42.974 |
| 2009-06-30 | 68.857 | 57.436 | 41.14 | 42.6 |
| 2009-07-01 | 69.768 | 58.402 | 40.847 | 43.232 |
| 2009-07-02 | 69.028 | 57.313 | 39.616 | 42.002 |
| 2009-07-03 | 69.028 | 57.313 | 39.616 | 42.54 |
| 2009-07-04 | 69.028 | 57.313 | 39.616 | 42.54 |
| 2009-07-05 | 67.861 | 55.896 | 39.616 | 42.54 |
| 2009-07-06 | 67 | 54.919 | 39.582 | 41.804 |
| 2009-07-07 | 67.584 | 54.983 | 39.289 | 41.754 |
| 2009-07-08 | 67.476 | 55.143 | 38.476 | 40.855 |
| 2009-07-09 | 67.385 | 55.848 | 39.21 | 41.425 |
| 2009-07-10 | 67.385 | 55.848 | 38.691 | 40.991 |
| 2009-07-11 | 67.385 | 55.848 | 38.691 | 40.991 |
| 2009-07-12 | 66.422 | 55.82 | 38.691 | 40.991 |
| 2009-07-13 | 67.557 | 57.78 | 41.219 | 41.849 |
| 2009-07-14 | 68.484 | 57.8 | 41.095 | 42.953 |
| 2009-07-15 | 69.788 | 58.955 | 42.844 | 44.557 |
| 2009-07-16 | 69.933 | 59.24 | 42.777 | 44.886 |
| 2009-07-17 | 69.933 | 59.24 | 41.851 | 45.036 |
| 2009-07-18 | 69.933 | 59.24 | 41.851 | 45.036 |
| 2009-07-19 | 71.171 | 61.043 | 41.851 | 45.036 |
| 2009-07-20 | 71.284 | 61.792 | 41.828 | 45.88 |
| 2009-07-21 | 72.593 | 65.034 | 40.53 | 45.656 |
| 2009-07-22 | 72.244 | 65.091 | 40.914 | 45.628 |
| 2009-07-23 | 73.114 | 66.776 | 42.122 | 47.127 |
| 2009-07-24 | 73.114 | 66.776 | 42.122 | 47.399 |
| 2009-07-25 | 73.114 | 66.776 | 42.122 | 47.399 |
| 2009-07-26 | 75.457 | 69.052 | 42.122 | 47.399 |
| 2009-07-27 | 75.09 | 67.498 | 43.431 | 47.728 |
| 2009-07-28 | 75.276 | 67.14 | 43.476 | 46.941 |
| 2009-07-29 | 76.027 | 68.627 | 43.646 | 47.347 |
| 2009-07-30 | 76.027 | 68.627 | 45.135 | 48.756 |
| 2009-07-31 | 76.027 | 68.627 | 45.643 | 49.142 |
| 2009-08-01 | 76.027 | 68.627 | 45.643 | 49.142 |
| 2009-08-02 | 77.658 | 70.563 | 45.643 | 49.142 |
| 2009-08-03 | 77.762 | 71.447 | 46.84 | 50.596 |
| 2009-08-04 | 77.483 | 70.547 | 48.081 | 50.317 |
| 2009-08-05 | 78.219 | 71.36 | 49.786 | 50.56 |
| 2009-08-06 | 79.223 | 72.563 | 49.537 | 51.981 |
| 2009-08-07 | 79.223 | 72.563 | 51.298 | 52.892 |
| 2009-08-08 | 79.223 | 72.563 | 51.298 | 52.892 |
| 2009-08-09 | 78.217 | 72.256 | 51.298 | 52.892 |
| 2009-08-10 | 76.57 | 70.666 | 51.388 | 52.663 |
| 2009-08-11 | 75.75 | 69.529 | 49.153 | 51.438 |
| 2009-08-12 | 75.568 | 69.191 | 50.068 | 52.115 |
| 2009-08-13 | 77.105 | 70.938 | 51.625 | 53.268 |
| 2009-08-14 | 77.105 | 70.938 | 51.716 | 52.694 |
| 2009-08-15 | 77.105 | 70.938 | 51.716 | 52.694 |
| 2009-08-16 | 75.292 | 69.078 | 51.716 | 52.694 |
| 2009-08-17 | 73.715 | 67.263 | 49.391 | 51.173 |
| 2009-08-18 | 75.291 | 68.333 | 50.474 | 52.365 |
| 2009-08-19 | 74.825 | 67.571 | 50.395 | 51.8 |
| 2009-08-20 | 76.168 | 69.978 | 51.84 | 52.601 |
| 2009-08-21 | 76.168 | 69.978 | 53.183 | 54.203 |
| 2009-08-22 | 76.168 | 69.978 | 53.183 | 54.203 |
| 2009-08-23 | 78.921 | 73.805 | 53.183 | 54.203 |
| 2009-08-24 | 78.787 | 73.584 | 52.336 | 55.171 |
| 2009-08-25 | 80.05 | 75.174 | 52.652 | 55.302 |
| 2009-08-26 | 79.417 | 75.242 | 52.585 | 55.383 |
| 2009-08-27 | 78.041 | 73.274 | 53.284 | 55.2 |
| 2009-08-28 | 78.041 | 73.274 | 53.634 | 56.034 |
| 2009-08-29 | 78.041 | 73.274 | 53.634 | 56.034 |
| 2009-08-30 | 76.348 | 70.862 | 53.634 | 56.034 |
| 2009-08-31 | 75.947 | 70.409 | 53.341 | 55.409 |
| 2009-09-01 | 77.062 | 71.709 | 50.26 | 53.729 |
| 2009-09-02 | 76.117 | 70.225 | 49.12 | 52.796 |
| 2009-09-03 | 77.701 | 72.594 | 50.361 | 53.166 |
| 2009-09-04 | 77.701 | 72.594 | 51.061 | 54.332 |
| 2009-09-05 | 77.701 | 72.594 | 51.061 | 54.332 |
| 2009-09-06 | 76.786 | 71.816 | 51.061 | 54.332 |
| 2009-09-07 | 77.149 | 71.714 | 51.061 | 55.09 |
| 2009-09-08 | 77.679 | 72.43 | 50.892 | 54.48 |
| 2009-09-09 | 77.752 | 72.322 | 51.591 | 54.902 |
| 2009-09-10 | 76.959 | 71.02 | 51.862 | 54.532 |
| 2009-09-11 | 76.959 | 71.02 | 51.264 | 54.823 |
| 2009-09-12 | 76.959 | 71.02 | 51.264 | 54.823 |
| 2009-09-13 | 76.285 | 69.828 | 51.264 | 54.823 |
| 2009-09-14 | 74.978 | 68.714 | 51.682 | 54.491 |
| 2009-09-15 | 75.89 | 70.581 | 52.427 | 54.763 |
| 2009-09-16 | 77.962 | 72.915 | 54.537 | 56.251 |
| 2009-09-17 | 78.151 | 72.748 | 54.018 | 56.947 |
| 2009-09-18 | 78.151 | 72.748 | 53.826 | 56.732 |
| 2009-09-19 | 78.151 | 72.748 | 53.826 | 56.732 |
| 2009-09-20 | 78.151 | 72.748 | 53.826 | 56.732 |
| 2009-09-21 | 77.709 | 73.307 | 53.567 | 55.843 |
| 2009-09-22 | 79.07 | 75.494 | 54.797 | 56.036 |
| 2009-09-23 | 79.361 | 76.805 | 53.634 | 56.732 |
| 2009-09-24 | 79.832 | 77.887 | 52.517 | 55.602 |
| 2009-09-25 | 79.832 | 77.887 | 52.054 | 55.285 |
| 2009-09-26 | 79.832 | 77.887 | 52.054 | 55.285 |
| 2009-09-27 | 79.832 | 77.887 | 52.054 | 55.285 |
| 2009-09-28 | 79.832 | 77.887 | 53.533 | 56.451 |
| 2009-09-29 | 81.418 | 80.118 | 53.341 | 56.93 |
| 2009-09-30 | 79.723 | 77.54 | 53.273 | 56.337 |
| 2009-10-01 | 80.769 | 78.676 | 50.621 | 54.995 |
| 2009-10-02 | 80.769 | 78.676 | 50.587 | 53.519 |
| 2009-10-03 | 80.769 | 78.676 | 50.587 | 53.519 |
| 2009-10-04 | 80.046 | 78.534 | 50.587 | 53.519 |
| 2009-10-05 | 80.846 | 79.69 | 52.212 | 54 |
| 2009-10-06 | 82.099 | 81.774 | 52.528 | 55.767 |
| 2009-10-07 | 82.022 | 81.258 | 53.138 | 55.4 |
| 2009-10-08 | 82.465 | 81.829 | 53.002 | 55.979 |
| 2009-10-09 | 82.465 | 81.829 | 53.533 | 55.867 |
| 2009-10-10 | 82.465 | 81.829 | 53.533 | 55.867 |
| 2009-10-11 | 82.344 | 81.487 | 53.533 | 55.867 |
| 2009-10-12 | 83.26 | 82.455 | 54.052 | 56.07 |
| 2009-10-13 | 82.505 | 81.024 | 53.815 | 55.259 |
| 2009-10-14 | 83.597 | 82.858 | 55.53 | 57.2 |
| 2009-10-15 | 83.613 | 83.121 | 55.147 | 57.171 |
| 2009-10-16 | 83.613 | 83.121 | 53.375 | 56.365 |
| 2009-10-17 | 83.613 | 83.121 | 53.375 | 56.365 |
| 2009-10-18 | 83.574 | 82.477 | 53.375 | 56.365 |
| 2009-10-19 | 83.692 | 81.985 | 53.104 | 57.419 |
| 2009-10-20 | 83.798 | 80.508 | 52.867 | 56.937 |
| 2009-10-21 | 83.922 | 80.593 | 51.603 | 57.238 |
| 2009-10-22 | 83.741 | 80.225 | 53.33 | 56.177 |
| 2009-10-23 | 83.741 | 80.225 | 52.46 | 55.917 |
| 2009-10-24 | 83.741 | 80.225 | 52.46 | 55.917 |
| 2009-10-25 | 84.554 | 81.665 | 52.46 | 55.917 |
| 2009-10-26 | 85.07 | 82.544 | 50.316 | 54.661 |
| 2009-10-27 | 84.612 | 82.138 | 49.808 | 53.979 |
| 2009-10-28 | 82.926 | 80.045 | 48.172 | 52.425 |
| 2009-10-29 | 82.27 | 79.267 | 50.147 | 54.286 |
| 2009-10-30 | 82.27 | 79.267 | 47.664 | 53.08 |
| 2009-10-31 | 82.27 | 79.267 | 47.664 | 53.08 |
| 2009-11-01 | 80.351 | 76.85 | 47.664 | 53.08 |
| 2009-11-02 | 80.82 | 76.641 | 48.093 | 53.342 |
| 2009-11-03 | 79.428 | 74.815 | 48.104 | 51.762 |
| 2009-11-04 | 81.537 | 77.553 | 47.077 | 53.08 |
| 2009-11-05 | 82.084 | 77.56 | 48.465 | 53.216 |
| 2009-11-06 | 82.084 | 77.56 | 48.352 | 53.946 |
| 2009-11-07 | 82.084 | 77.56 | 48.352 | 53.946 |
| 2009-11-08 | 83.602 | 79.233 | 48.352 | 53.946 |
| 2009-11-09 | 84.109 | 80.522 | 50.068 | 55.247 |
| 2009-11-10 | 84.162 | 80.272 | 49.357 | 55.297 |
| 2009-11-11 | 85.033 | 81.339 | 49.91 | 55.767 |
| 2009-11-12 | 85.069 | 81.222 | 48.871 | 55.827 |
| 2009-11-13 | 85.069 | 81.222 | 48.691 | 56.027 |
| 2009-11-14 | 85.069 | 81.222 | 48.691 | 56.027 |
| 2009-11-15 | 85.65 | 82.344 | 48.691 | 56.027 |
| 2009-11-16 | 85.922 | 81.611 | 49.221 | 56.823 |
| 2009-11-17 | 86.439 | 82.025 | 49.74 | 56.101 |
| 2009-11-18 | 86.149 | 81.445 | 50.418 | 55.886 |
| 2009-11-19 | 85.777 | 81.101 | 49.413 | 54.854 |
| 2009-11-20 | 85.777 | 81.101 | 49.289 | 54.031 |
| 2009-11-21 | 85.777 | 81.101 | 49.289 | 54.031 |
| 2009-11-22 | 85.829 | 81.018 | 49.289 | 54.031 |
| 2009-11-23 | 86.568 | 82.991 | 50.327 | 55.629 |
| 2009-11-24 | 86.849 | 83.426 | 50 | 54.828 |
| 2009-11-25 | 87.261 | 84.878 | 49.91 | 54.763 |
| 2009-11-26 | 86.15 | 83.502 | 49.91 | 52.003 |
| 2009-11-27 | 86.15 | 83.502 | 48.578 | 52.861 |
| 2009-11-28 | 86.15 | 83.502 | 48.578 | 52.861 |
| 2009-11-29 | 85.421 | 82.968 | 48.578 | 52.861 |
| 2009-11-30 | 86.242 | 84.701 | 50.203 | 52.1 |
| 2009-12-01 | 87.638 | 87.301 | 50.203 | 53.557 |
| 2009-12-02 | 88.013 | 87.225 | 50.384 | 53.392 |
| 2009-12-03 | 89.096 | 88.664 | 48.86 | 53.621 |
| 2009-12-04 | 89.096 | 88.664 | 49.932 | 54.284 |
| 2009-12-05 | 89.096 | 88.664 | 49.932 | 54.284 |
| 2009-12-06 | 89.812 | 91.018 | 49.932 | 54.284 |
| 2009-12-07 | 89.329 | 90.587 | 49.12 | 53.626 |
| 2009-12-08 | 88.403 | 88.946 | 49.086 | 52.379 |
| 2009-12-09 | 88.165 | 88.767 | 49.12 | 51.528 |
| 2009-12-10 | 89.288 | 90.926 | 48.702 | 52.436 |
| 2009-12-11 | 89.288 | 90.926 | 49.199 | 51.919 |
| 2009-12-12 | 89.288 | 90.926 | 49.199 | 51.919 |
| 2009-12-13 | 89.056 | 90.556 | 49.199 | 51.919 |
| 2009-12-14 | 89.736 | 91.882 | 49.436 | 52.67 |
| 2009-12-15 | 88.712 | 90.108 | 48.002 | 52.222 |
| 2009-12-16 | 89.377 | 91.375 | 47.799 | 53.485 |
| 2009-12-17 | 88.265 | 90.153 | 47.065 | 52.043 |
| 2009-12-18 | 88.265 | 90.153 | 48.149 | 51.209 |
| 2009-12-19 | 88.265 | 90.153 | 48.149 | 51.209 |
| 2009-12-20 | 89.092 | 91.385 | 48.149 | 51.209 |
| 2009-12-21 | 89.185 | 91.578 | 48.883 | 52.153 |
| 2009-12-22 | 90.211 | 92.712 | 48.939 | 52.408 |
| 2009-12-23 | 90.555 | 93.355 | 48.386 | 52.765 |
| 2009-12-24 | 91.88 | 94.484 | 48.916 | 52.746 |
| 2009-12-25 | 91.88 | 94.484 | 48.916 | 52.746 |
| 2009-12-26 | 91.88 | 94.484 | 48.916 | 52.746 |
| 2009-12-27 | 91.076 | 92.694 | 48.916 | 52.746 |
| 2009-12-28 | 91.624 | 93.213 | 48.555 | 53.142 |
| 2009-12-29 | 91.097 | 93.382 | 48.431 | 53.133 |
| 2009-12-30 | 91.129 | 93.882 | 48.307 | 52.751 |
| 2009-12-31 | 91.521 | 93.903 | 48.205 | 52.925 |
| 2010-01-01 | 91.521 | 93.903 | 48.205 | 52.925 |
| 2010-01-02 | 91.521 | 93.903 | 48.205 | 52.925 |
| 2010-01-03 | 92.829 | 95.555 | 48.205 | 52.925 |
| 2010-01-04 | 93.614 | 96.481 | 49.3 | 54.065 |
| 2010-01-05 | 94.375 | 97.224 | 50.406 | 54.706 |
| 2010-01-06 | 94.385 | 95.815 | 51.05 | 54.94 |
| 2010-01-07 | 94.018 | 94.585 | 53.149 | 55.333 |
| 2010-01-08 | 94.018 | 94.585 | 53.047 | 56.02 |
| 2010-01-09 | 94.018 | 94.585 | 53.047 | 56.02 |
| 2010-01-10 | 95.348 | 95.608 | 53.047 | 56.02 |
| 2010-01-11 | 94.549 | 93.972 | 53.081 | 55.61 |
| 2010-01-12 | 92.359 | 91.004 | 52.178 | 55.03 |
| 2010-01-13 | 93.032 | 91.665 | 52.98 | 54.654 |
| 2010-01-14 | 92.819 | 90.82 | 53.849 | 55.045 |
| 2010-01-15 | 92.819 | 90.82 | 52.686 | 53.965 |
| 2010-01-16 | 92.819 | 90.82 | 52.686 | 53.965 |
| 2010-01-17 | 93.532 | 92.457 | 52.686 | 53.965 |
| 2010-01-18 | 93.883 | 91.839 | 52.686 | 54.053 |
| 2010-01-19 | 93.756 | 91.118 | 53.228 | 54.315 |
| 2010-01-20 | 93.545 | 90.467 | 53.973 | 53.013 |
| 2010-01-21 | 93.789 | 91.025 | 53.702 | 51.595 |
| 2010-01-22 | 93.789 | 91.025 | 52.28 | 50.596 |
| 2010-01-23 | 93.789 | 91.025 | 52.28 | 50.596 |
| 2010-01-24 | 91.607 | 88.649 | 52.28 | 50.596 |
| 2010-01-25 | 92.325 | 89.47 | 52.37 | 50.529 |
| 2010-01-26 | 91.657 | 89.198 | 51.219 | 50.503 |
| 2010-01-27 | 91.35 | 88.813 | 52.709 | 49.297 |
| 2010-01-28 | 92.232 | 89.848 | 52.867 | 48.686 |
| 2010-01-29 | 92.232 | 89.848 | 52.528 | 49.552 |
| 2010-01-30 | 92.232 | 89.848 | 52.528 | 49.552 |
| 2010-01-31 | 90.862 | 88.103 | 52.528 | 49.552 |
| 2010-02-01 | 91.056 | 88.5 | 53.273 | 50.246 |
| 2010-02-02 | 91.86 | 88.639 | 53.397 | 50.942 |
| 2010-02-03 | 92.537 | 89.729 | 52.144 | 50.198 |
| 2010-02-04 | 92.072 | 89.077 | 49.898 | 47.466 |
| 2010-02-05 | 92.072 | 89.077 | 50.564 | 46.381 |
| 2010-02-06 | 92.072 | 89.077 | 50.564 | 46.381 |
| 2010-02-07 | 91.393 | 87.964 | 50.564 | 46.381 |
| 2010-02-08 | 90.482 | 86.917 | 49.819 | 46.469 |
| 2010-02-09 | 90.998 | 87.887 | 50.316 | 46.793 |
| 2010-02-10 | 91.597 | 89.334 | 50.835 | 48.031 |
| 2010-02-11 | 91.778 | 89.525 | 50.869 | 47.418 |
| 2010-02-12 | 91.778 | 89.525 | 50.44 | 46.803 |
| 2010-02-13 | 91.778 | 89.525 | 50.44 | 46.803 |
| 2010-02-14 | 93.035 | 89.634 | 50.44 | 46.803 |
| 2010-02-15 | 93.716 | 90.42 | 50.44 | 47.275 |
| 2010-02-16 | 94.34 | 91.429 | 51.919 | 48.202 |
| 2010-02-17 | 94.582 | 91.264 | 51.907 | 49.206 |
| 2010-02-18 | 94.332 | 90.969 | 51.998 | 49.239 |
| 2010-02-19 | 94.332 | 90.969 | 52.664 | 49.542 |
| 2010-02-20 | 94.332 | 90.969 | 52.664 | 49.542 |
| 2010-02-21 | 94.953 | 90.864 | 52.664 | 49.542 |
| 2010-02-22 | 95.389 | 91.719 | 53.668 | 49.852 |
| 2010-02-23 | 94.769 | 90.233 | 52.404 | 48.837 |
| 2010-02-24 | 94.942 | 89.002 | 53.6 | 49.135 |
| 2010-02-25 | 93.869 | 87.529 | 53.081 | 48.472 |
| 2010-02-26 | 93.869 | 87.529 | 53.555 | 49.051 |
| 2010-02-27 | 93.869 | 87.529 | 53.555 | 49.051 |
| 2010-02-28 | 93.869 | 87.529 | 53.555 | 49.051 |
| 2010-03-01 | 95.914 | 89.083 | 53.318 | 48.863 |
| 2010-03-02 | 96.619 | 90.609 | 53.668 | 49.528 |
| 2010-03-03 | 96.679 | 90.164 | 53.454 | 50.255 |
| 2010-03-04 | 97.822 | 92.317 | 53.533 | 50.691 |
| 2010-03-05 | 97.822 | 92.317 | 54.865 | 52.239 |
| 2010-03-06 | 97.822 | 92.317 | 54.865 | 52.239 |
| 2010-03-07 | 98.623 | 92.31 | 54.865 | 52.239 |
| 2010-03-08 | 97.918 | 90.974 | 54.955 | 52.189 |
| 2010-03-09 | 97.308 | 90.784 | 55.305 | 51.75 |
| 2010-03-10 | 98.267 | 92.272 | 56.501 | 52.363 |
| 2010-03-11 | 98.419 | 92.189 | 57.472 | 52.01 |
| 2010-03-12 | 98.419 | 92.189 | 56.953 | 52.374 |
| 2010-03-13 | 98.419 | 92.189 | 56.953 | 52.374 |
| 2010-03-14 | 98.679 | 91.844 | 56.953 | 52.374 |
| 2010-03-15 | 98.358 | 90.794 | 57.065 | 51.881 |
| 2010-03-16 | 98.406 | 91.478 | 58.025 | 52.608 |
| 2010-03-17 | 99.41 | 93.373 | 58.995 | 53.431 |
| 2010-03-18 | 98.956 | 91.438 | 58.273 | 52.768 |
| 2010-03-19 | 98.956 | 91.438 | 57.709 | 52.723 |
| 2010-03-20 | 98.956 | 91.438 | 57.709 | 52.723 |
| 2010-03-21 | 98.335 | 90.84 | 57.709 | 52.723 |
| 2010-03-22 | 97.712 | 89.538 | 58.363 | 52.389 |
| 2010-03-23 | 98.874 | 90.237 | 58.826 | 52.87 |
| 2010-03-24 | 99.705 | 91.549 | 59.074 | 52.854 |
| 2010-03-25 | 99.76 | 91.809 | 59.176 | 53.848 |
| 2010-03-26 | 99.76 | 91.809 | 59.029 | 53.769 |
| 2010-03-27 | 99.76 | 91.809 | 59.029 | 53.769 |
| 2010-03-28 | 99.767 | 92.86 | 59.029 | 53.769 |
| 2010-03-29 | 99.767 | 92.86 | 58.883 | 53.612 |
| 2010-03-30 | 99.767 | 92.86 | 58.409 | 53.273 |
| 2010-03-31 | 99.293 | 92.905 | 58.691 | 53.028 |
| 2010-04-01 | 99.575 | 93.149 | 59.187 | 54.048 |
| 2010-04-02 | 99.575 | 93.149 | 59.187 | 54.048 |
| 2010-04-03 | 99.575 | 93.149 | 59.187 | 54.048 |
| 2010-04-04 | 99.575 | 93.149 | 59.187 | 54.048 |
| 2010-04-05 | 99.575 | 93.149 | 60.316 | 54.048 |
| 2010-04-06 | 99.768 | 93.51 | 61.783 | 54.272 |
| 2010-04-07 | 98.944 | 93.03 | 61.546 | 54.115 |
| 2010-04-08 | 97.461 | 91.341 | 62.144 | 53.245 |
| 2010-04-09 | 97.461 | 91.341 | 62.427 | 54.439 |
| 2010-04-10 | 97.461 | 91.341 | 62.427 | 54.439 |
| 2010-04-11 | 98.86 | 92.431 | 62.427 | 54.439 |
| 2010-04-12 | 98.551 | 91.471 | 63.172 | 54.894 |
| 2010-04-13 | 98.651 | 91.107 | 62.472 | 54.713 |
| 2010-04-14 | 99.496 | 91.847 | 64.594 | 55.35 |
| 2010-04-15 | 98.122 | 91.016 | 64.007 | 56.077 |
| 2010-04-16 | 98.122 | 91.016 | 61.795 | 54.546 |
| 2010-04-17 | 98.122 | 91.016 | 61.795 | 54.546 |
| 2010-04-18 | 97.173 | 89.779 | 61.795 | 54.546 |
| 2010-04-19 | 97.173 | 89.779 | 62.404 | 54.062 |
| 2010-04-20 | 97.173 | 89.779 | 64.074 | 54.706 |
| 2010-04-21 | 97.589 | 90.266 | 64.639 | 53.891 |
| 2010-04-22 | 97.083 | 90.103 | 65.158 | 52.878 |
| 2010-04-23 | 97.083 | 90.103 | 65.406 | 53.154 |
| 2010-04-24 | 97.083 | 90.103 | 65.406 | 53.154 |
| 2010-04-25 | 97.852 | 91.292 | 65.406 | 53.154 |
| 2010-04-26 | 97.647 | 90.62 | 63.375 | 53.915 |
| 2010-04-27 | 97.285 | 89.197 | 61.422 | 51.504 |
| 2010-04-28 | 96.127 | 87.813 | 62.257 | 50.882 |
| 2010-04-29 | 94.331 | 85.733 | 63.77 | 52.041 |
| 2010-04-30 | 94.331 | 85.733 | 62.889 | 51.442 |
| 2010-05-01 | 94.331 | 85.733 | 62.889 | 51.442 |
| 2010-05-02 | 94.261 | 85.992 | 62.889 | 51.442 |
| 2010-05-03 | 95.066 | 86.794 | 63.962 | 51.48 |
| 2010-05-04 | 93.276 | 85.294 | 62.065 | 48.913 |
| 2010-05-05 | 91.289 | 83.624 | 62.065 | 48.198 |
| 2010-05-06 | 91.804 | 84.23 | 59.255 | 46.083 |
| 2010-05-07 | 91.804 | 84.23 | 58.352 | 44.355 |
| 2010-05-08 | 91.804 | 84.23 | 58.352 | 44.355 |
| 2010-05-09 | 90.979 | 83.905 | 58.352 | 44.355 |
| 2010-05-10 | 94.002 | 87.08 | 61.975 | 50.758 |
| 2010-05-11 | 92.311 | 85.341 | 62.167 | 49.847 |
| 2010-05-12 | 93.655 | 87.377 | 63.081 | 50.265 |
| 2010-05-13 | 92.839 | 86.751 | 62.111 | 49.914 |
| 2010-05-14 | 92.839 | 86.751 | 60.135 | 47.332 |
| 2010-05-15 | 92.839 | 86.751 | 60.135 | 47.332 |
| 2010-05-16 | 90.255 | 84.565 | 60.135 | 47.332 |
| 2010-05-17 | 90.528 | 85.055 | 60.068 | 47.318 |
| 2010-05-18 | 90.528 | 85.055 | 57.833 | 48.195 |
| 2010-05-19 | 90.528 | 85.055 | 57.63 | 46.503 |
| 2010-05-20 | 87.876 | 82.463 | 54.695 | 45.601 |
| 2010-05-21 | 87.876 | 82.463 | 56.874 | 46.021 |
| 2010-05-22 | 87.876 | 82.463 | 56.874 | 46.021 |
| 2010-05-23 | 89.864 | 85.27 | 56.874 | 46.021 |
| 2010-05-24 | 88.481 | 84.104 | 55 | 46.064 |
| 2010-05-25 | 86.557 | 81.965 | 55.564 | 44.345 |
| 2010-05-26 | 88.444 | 81.94 | 55.451 | 45.213 |
| 2010-05-27 | 87.984 | 82.637 | 57.664 | 46.665 |
| 2010-05-28 | 87.984 | 82.637 | 56.366 | 46.271 |
| 2010-05-29 | 87.984 | 82.637 | 56.366 | 46.271 |
| 2010-05-30 | 88.084 | 82.687 | 56.366 | 46.271 |
| 2010-05-31 | 86.744 | 80.826 | 56.366 | 46.395 |
| 2010-06-01 | 85.976 | 79.455 | 54.91 | 46.276 |
| 2010-06-02 | 86.095 | 79.484 | 56.693 | 45.909 |
| 2010-06-03 | 88.154 | 81.843 | 56.253 | 46.4 |
| 2010-06-04 | 88.154 | 81.843 | 53.758 | 44.657 |
| 2010-06-05 | 88.154 | 81.843 | 53.758 | 44.657 |
| 2010-06-06 | 86.515 | 80.161 | 53.758 | 44.657 |
| 2010-06-07 | 86.622 | 79.965 | 52.517 | 44.376 |
| 2010-06-08 | 86.192 | 79.398 | 53.702 | 43.706 |
| 2010-06-09 | 86.994 | 80.836 | 53.251 | 44.831 |
| 2010-06-10 | 86.822 | 79.667 | 55.214 | 45.892 |
| 2010-06-11 | 86.822 | 79.667 | 55.226 | 46.782 |
| 2010-06-12 | 86.822 | 79.667 | 55.226 | 46.782 |
| 2010-06-13 | 87.951 | 80.203 | 55.226 | 46.782 |
| 2010-06-14 | 88.777 | 80.853 | 54.797 | 47.678 |
| 2010-06-15 | 88.692 | 80.247 | 56.287 | 48.441 |
| 2010-06-16 | 87.975 | 80.258 | 56.298 | 48.369 |
| 2010-06-17 | 88.759 | 80.475 | 56.061 | 48.705 |
| 2010-06-18 | 88.759 | 80.475 | 56.49 | 49.578 |
| 2010-06-19 | 88.759 | 80.475 | 56.49 | 49.578 |
| 2010-06-20 | 90.141 | 81.991 | 56.49 | 49.578 |
| 2010-06-21 | 90.941 | 82.377 | 56.411 | 50.024 |
| 2010-06-22 | 90.252 | 81.251 | 55.564 | 49.628 |
| 2010-06-23 | 89.328 | 79.93 | 55.181 | 49.018 |
| 2010-06-24 | 87.647 | 78.427 | 53.95 | 47.449 |
| 2010-06-25 | 87.647 | 78.427 | 55.519 | 47.575 |
| 2010-06-26 | 87.647 | 78.427 | 55.519 | 47.575 |
| 2010-06-27 | 87.171 | 78.251 | 55.519 | 47.575 |
| 2010-06-28 | 87.783 | 78.616 | 55.316 | 48.105 |
| 2010-06-29 | 85.846 | 76.79 | 52.867 | 45.919 |
| 2010-06-30 | 85.106 | 76.313 | 52.054 | 46.169 |
| 2010-07-01 | 84.788 | 76.717 | 51.569 | 44.977 |
| 2010-07-02 | 84.788 | 76.717 | 50.756 | 45.225 |
| 2010-07-03 | 84.788 | 76.717 | 50.756 | 45.225 |
| 2010-07-04 | 85.269 | 77.072 | 50.756 | 45.225 |
| 2010-07-05 | 86.016 | 77.988 | 50.756 | 44.889 |
| 2010-07-06 | 87.316 | 79.751 | 51.366 | 46.619 |
| 2010-07-07 | 85.951 | 79.322 | 54.255 | 48.419 |
| 2010-07-08 | 87.072 | 81.136 | 54.447 | 49.223 |
| 2010-07-09 | 87.072 | 81.136 | 55.745 | 49.573 |
| 2010-07-10 | 87.072 | 81.136 | 55.745 | 49.573 |
| 2010-07-11 | 88.232 | 83.297 | 55.745 | 49.573 |
| 2010-07-12 | 88.65 | 82.563 | 55.835 | 49.716 |
| 2010-07-13 | 89.031 | 83.034 | 57.528 | 50.968 |
| 2010-07-14 | 88.336 | 81.754 | 56.603 | 50.756 |
| 2010-07-15 | 88.839 | 82.07 | 56.332 | 49.721 |
| 2010-07-16 | 88.839 | 82.07 | 53.115 | 48.293 |
| 2010-07-17 | 88.839 | 82.07 | 53.115 | 48.293 |
| 2010-07-18 | 87.033 | 80.145 | 53.115 | 48.293 |
| 2010-07-19 | 87.322 | 80.546 | 53.093 | 47.983 |
| 2010-07-20 | 87.322 | 80.546 | 53.002 | 48.305 |
| 2010-07-21 | 88.546 | 82.064 | 51.749 | 48.791 |
| 2010-07-22 | 88.763 | 83.127 | 53.77 | 50.334 |
| 2010-07-23 | 88.763 | 83.127 | 54.097 | 50.453 |
| 2010-07-24 | 88.763 | 83.127 | 54.097 | 50.453 |
| 2010-07-25 | 88.753 | 84.382 | 54.097 | 50.453 |
| 2010-07-26 | 88.643 | 83.799 | 55.508 | 51.321 |
| 2010-07-27 | 89.157 | 83.776 | 55.745 | 53.736 |
| 2010-07-28 | 88.711 | 83.759 | 55.011 | 53.738 |
| 2010-07-29 | 88.443 | 85.056 | 55.023 | 53.354 |
| 2010-07-30 | 88.443 | 85.056 | 54.898 | 52.944 |
| 2010-07-31 | 88.443 | 85.056 | 54.898 | 52.944 |
| 2010-08-01 | 88.477 | 84.548 | 54.898 | 52.944 |
| 2010-08-02 | 90.29 | 85.808 | 56.625 | 55.026 |
| 2010-08-03 | 89.85 | 85.632 | 55.892 | 54.954 |
| 2010-08-04 | 90.919 | 85.468 | 55.756 | 54.732 |
| 2010-08-05 | 91.283 | 84.931 | 55.44 | 54.465 |
| 2010-08-06 | 91.283 | 84.931 | 54.661 | 53.805 |
| 2010-08-07 | 91.283 | 84.931 | 54.661 | 53.805 |
| 2010-08-08 | 91.966 | 86.65 | 54.661 | 53.805 |
| 2010-08-09 | 92.326 | 86.748 | 55.011 | 54.608 |
| 2010-08-10 | 91.865 | 86.441 | 54.56 | 53.965 |
| 2010-08-11 | 90.877 | 85.788 | 52.201 | 52.134 |
| 2010-08-12 | 90.067 | 85.128 | 51.975 | 51.953 |
| 2010-08-13 | 90.067 | 85.128 | 51.862 | 51.833 |
| 2010-08-14 | 90.067 | 85.128 | 51.862 | 51.833 |
| 2010-08-15 | 90.707 | 85.194 | 51.862 | 51.833 |
| 2010-08-16 | 91.014 | 85.676 | 51.806 | 51.616 |
| 2010-08-17 | 92.331 | 86.748 | 51.998 | 52.479 |
| 2010-08-18 | 92.043 | 87.53 | 52.133 | 52.038 |
| 2010-08-19 | 91.668 | 87.267 | 50.79 | 51.066 |
| 2010-08-20 | 91.668 | 87.267 | 50.587 | 50.582 |
| 2010-08-21 | 91.668 | 87.267 | 50.587 | 50.582 |
| 2010-08-22 | 92.042 | 87.663 | 50.587 | 50.582 |
| 2010-08-23 | 91.87 | 87.063 | 50.282 | 51.228 |
| 2010-08-24 | 90.198 | 85.215 | 49.199 | 50.1 |
| 2010-08-25 | 89.033 | 84.898 | 48.995 | 49.301 |
| 2010-08-26 | 90.115 | 86.996 | 48.646 | 49.964 |
| 2010-08-27 | 90.115 | 86.996 | 49.876 | 50.153 |
| 2010-08-28 | 90.115 | 86.996 | 49.876 | 50.153 |
| 2010-08-29 | 90.652 | 86.938 | 49.876 | 50.153 |
| 2010-08-30 | 90.495 | 86.214 | 48.51 | 50.055 |
| 2010-08-31 | 89.926 | 84.709 | 49.041 | 50.122 |
| 2010-09-01 | 91.43 | 86.088 | 51.072 | 51.833 |
| 2010-09-02 | 91.823 | 86.722 | 51.67 | 51.762 |
| 2010-09-03 | 91.823 | 86.722 | 52.63 | 52.549 |
| 2010-09-04 | 91.823 | 86.722 | 52.63 | 52.549 |
| 2010-09-05 | 93.367 | 88.004 | 52.63 | 52.549 |
| 2010-09-06 | 93.436 | 88.135 | 52.63 | 52.639 |
| 2010-09-07 | 93.294 | 87.476 | 50.959 | 51.953 |
| 2010-09-08 | 93.294 | 87.476 | 51.817 | 52.148 |
| 2010-09-09 | 93.294 | 87.476 | 52.641 | 53.211 |
| 2010-09-10 | 93.294 | 87.476 | 52.551 | 52.93 |
| 2010-09-11 | 93.294 | 87.476 | 52.551 | 52.93 |
| 2010-09-12 | 93.79 | 87 | 52.551 | 52.93 |
| 2010-09-13 | 94.283 | 86.594 | 54.153 | 53.824 |
| 2010-09-14 | 94.002 | 86.517 | 53.42 | 53.795 |
| 2010-09-15 | 93.743 | 85.513 | 53.488 | 53.485 |
| 2010-09-16 | 93.477 | 84.662 | 53.138 | 52.858 |
| 2010-09-17 | 93.477 | 84.662 | 52.867 | 52.301 |
| 2010-09-18 | 93.477 | 84.662 | 52.867 | 52.301 |
| 2010-09-19 | 94.699 | 87.489 | 52.867 | 52.301 |
| 2010-09-20 | 95.793 | 88.396 | 54.063 | 52.904 |
| 2010-09-21 | 97.363 | 90.799 | 53.296 | 52.491 |
| 2010-09-22 | 97.363 | 90.799 | 52.314 | 51.488 |
| 2010-09-23 | 97.363 | 90.799 | 51.343 | 51.116 |
| 2010-09-24 | 97.363 | 90.799 | 52.98 | 51.95 |
| 2010-09-25 | 97.363 | 90.799 | 52.98 | 51.95 |
| 2010-09-26 | 97.571 | 91.06 | 52.98 | 51.95 |
| 2010-09-27 | 97.132 | 89.976 | 51.986 | 51.569 |
| 2010-09-28 | 97.011 | 90.626 | 52.212 | 51.089 |
| 2010-09-29 | 97.011 | 90.626 | 51.998 | 50.322 |
| 2010-09-30 | 97.011 | 90.626 | 52.144 | 49.964 |
| 2010-10-01 | 97.011 | 90.626 | 52.731 | 49.609 |
| 2010-10-02 | 97.011 | 90.626 | 52.731 | 49.609 |
| 2010-10-03 | 97.439 | 91.554 | 52.731 | 49.609 |
| 2010-10-04 | 96.852 | 90.937 | 52.438 | 49.564 |
| 2010-10-05 | 97.884 | 91.523 | 54.086 | 50.813 |
| 2010-10-06 | 97.199 | 89.134 | 53.883 | 50.935 |
| 2010-10-07 | 96.097 | 87.619 | 53.555 | 50.853 |
| 2010-10-08 | 96.097 | 87.619 | 53.465 | 50.501 |
| 2010-10-09 | 96.097 | 87.619 | 53.465 | 50.501 |
| 2010-10-10 | 97.81 | 89.244 | 53.465 | 50.501 |
| 2010-10-11 | 98.442 | 89.563 | 53.431 | 50.567 |
| 2010-10-12 | 98.14 | 89.252 | 54.255 | 50.434 |
| 2010-10-13 | 99.484 | 90.757 | 53.713 | 51.132 |
| 2010-10-14 | 99.569 | 91.343 | 52.302 | 50.381 |
| 2010-10-15 | 99.569 | 91.343 | 51.061 | 50.219 |
| 2010-10-16 | 99.569 | 91.343 | 51.061 | 50.219 |
| 2010-10-17 | 99.384 | 90.892 | 51.061 | 50.219 |
| 2010-10-18 | 99.832 | 90.844 | 52.585 | 50.777 |
| 2010-10-19 | 99.31 | 90.224 | 51.953 | 51.032 |
| 2010-10-20 | 99.752 | 90.108 | 51.693 | 51.032 |
| 2010-10-21 | 100.795 | 91.343 | 51.738 | 50.911 |
| 2010-10-22 | 100.795 | 91.343 | 51.907 | 50.806 |
| 2010-10-23 | 100.795 | 91.343 | 51.907 | 50.806 |
| 2010-10-24 | 100.679 | 91.208 | 51.907 | 50.806 |
| 2010-10-25 | 101.061 | 91.037 | 51.366 | 50.451 |
| 2010-10-26 | 99.97 | 90.152 | 51.388 | 50.164 |
| 2010-10-27 | 99.834 | 89.173 | 51.58 | 50.091 |
| 2010-10-28 | 100.645 | 90.057 | 51.4 | 50.029 |
| 2010-10-29 | 100.645 | 90.057 | 51.343 | 49.745 |
| 2010-10-30 | 100.645 | 90.057 | 51.343 | 49.745 |
| 2010-10-31 | 101.001 | 91.261 | 51.343 | 49.745 |
| 2010-11-01 | 101.158 | 91.407 | 51.038 | 49.344 |
| 2010-11-02 | 100.811 | 92.441 | 50.926 | 49.411 |
| 2010-11-03 | 100.062 | 91.97 | 51.907 | 49.311 |
| 2010-11-04 | 100.387 | 93.947 | 53.781 | 50.522 |
| 2010-11-05 | 100.387 | 93.947 | 54.944 | 50.174 |
| 2010-11-06 | 100.387 | 93.947 | 54.944 | 50.174 |
| 2010-11-07 | 100.611 | 95.444 | 54.944 | 50.174 |
| 2010-11-08 | 100.002 | 93.489 | 54.616 | 50.284 |
| 2010-11-09 | 100.651 | 94.387 | 53.544 | 50.699 |
| 2010-11-10 | 100.167 | 93.194 | 54.549 | 49.781 |
| 2010-11-11 | 98.445 | 92.067 | 54.199 | 49.487 |
| 2010-11-12 | 98.445 | 92.067 | 53.115 | 49.683 |
| 2010-11-13 | 98.445 | 92.067 | 53.115 | 49.683 |
| 2010-11-14 | 97.318 | 92.444 | 53.115 | 49.683 |
| 2010-11-15 | 99.468 | 95.059 | 53.476 | 50.031 |
| 2010-11-16 | 98.795 | 95.179 | 52.404 | 48.503 |
| 2010-11-17 | 98.974 | 95.68 | 51.67 | 48.746 |
| 2010-11-18 | 100.317 | 96.603 | 52.054 | 49.397 |
| 2010-11-19 | 100.317 | 96.603 | 51.919 | 48.596 |
| 2010-11-20 | 100.317 | 96.603 | 51.919 | 48.596 |
| 2010-11-21 | 101.048 | 97.383 | 51.919 | 48.596 |
| 2010-11-22 | 100.369 | 97.4 | 51.129 | 47.647 |
| 2010-11-23 | 99.383 | 95.894 | 50.248 | 46.567 |
| 2010-11-24 | 99.76 | 96.905 | 50.835 | 46.863 |
| 2010-11-25 | 99.987 | 96.065 | 50.835 | 46.96 |
| 2010-11-26 | 99.987 | 96.065 | 50.35 | 46.219 |
| 2010-11-27 | 99.987 | 96.065 | 50.35 | 46.219 |
| 2010-11-28 | 100.012 | 96.372 | 50.35 | 46.219 |
| 2010-11-29 | 100.085 | 96.806 | 50.88 | 45.621 |
| 2010-11-30 | 98.799 | 95.167 | 50.519 | 45.184 |
| 2010-12-01 | 99.392 | 96.151 | 51.749 | 46.798 |
| 2010-12-02 | 100.087 | 96.376 | 53.758 | 47.993 |
| 2010-12-03 | 100.087 | 96.376 | 54.21 | 47.981 |
| 2010-12-04 | 100.087 | 96.376 | 54.21 | 47.981 |
| 2010-12-05 | 101.666 | 97.965 | 54.21 | 47.981 |
| 2010-12-06 | 101.913 | 97.836 | 54.007 | 47.509 |
| 2010-12-07 | 102.732 | 98.745 | 53.962 | 47.68 |
| 2010-12-08 | 102.439 | 99.535 | 55.553 | 48.338 |
| 2010-12-09 | 102.984 | 99.1 | 56.795 | 49.163 |
| 2010-12-10 | 102.984 | 99.1 | 57.472 | 48.72 |
| 2010-12-11 | 102.984 | 99.1 | 57.472 | 48.72 |
| 2010-12-12 | 102.622 | 97.92 | 57.472 | 48.72 |
| 2010-12-13 | 103.397 | 99.579 | 57.223 | 48.779 |
| 2010-12-14 | 103.575 | 99.379 | 56.354 | 48.887 |
| 2010-12-15 | 103.012 | 99.077 | 55.745 | 48 |
| 2010-12-16 | 103.765 | 99.505 | 55.847 | 48.095 |
| 2010-12-17 | 103.765 | 99.505 | 56.524 | 47.344 |
| 2010-12-18 | 103.765 | 99.505 | 56.524 | 47.344 |
| 2010-12-19 | 103.862 | 99.594 | 56.524 | 47.344 |
| 2010-12-20 | 104.435 | 99.285 | 56.817 | 47.676 |
| 2010-12-21 | 104.363 | 98.591 | 57.878 | 48.393 |
| 2010-12-22 | 104.336 | 99.231 | 58.984 | 48.334 |
| 2010-12-23 | 103.649 | 99.201 | 58.431 | 48.274 |
| 2010-12-24 | 103.649 | 99.201 | 58.431 | 48.212 |
| 2010-12-25 | 103.649 | 99.201 | 58.431 | 48.212 |
| 2010-12-26 | 103.811 | 98.517 | 58.431 | 48.212 |
| 2010-12-27 | 103.469 | 97.507 | 58.984 | 47.623 |
| 2010-12-28 | 103.71 | 97.729 | 59.255 | 47.716 |
| 2010-12-29 | 105.575 | 99.911 | 59.097 | 47.688 |
| 2010-12-30 | 105.186 | 100.279 | 58.928 | 47.025 |
| 2010-12-31 | 105.186 | 100.279 | 58.928 | 46.801 |
| 2011-01-01 | 105.186 | 100.279 | 58.928 | 46.801 |
| 2011-01-02 | 105.408 | 101.617 | 58.928 | 46.801 |
| 2011-01-03 | 106.169 | 102.113 | 60.271 | 47.237 |
| 2011-01-04 | 106.179 | 101.552 | 60.079 | 48.1 |
| 2011-01-05 | 106.132 | 101.162 | 60.892 | 48.527 |
| 2011-01-06 | 106.464 | 100.55 | 60.248 | 48.441 |
| 2011-01-07 | 106.464 | 100.55 | 59.684 | 47.921 |
| 2011-01-08 | 106.464 | 100.55 | 59.684 | 47.921 |
| 2011-01-09 | 106.389 | 98.814 | 59.684 | 47.921 |
| 2011-01-10 | 105.381 | 97.902 | 59.492 | 46.996 |
| 2011-01-11 | 106.651 | 99.767 | 59.876 | 47.876 |
| 2011-01-12 | 106.933 | 99.904 | 60.79 | 50.172 |
| 2011-01-13 | 106.977 | 100.167 | 60.35 | 50.625 |
| 2011-01-14 | 106.977 | 100.167 | 61.738 | 50.873 |
| 2011-01-15 | 106.977 | 100.167 | 61.738 | 50.873 |
| 2011-01-16 | 107.242 | 100.05 | 61.738 | 50.873 |
| 2011-01-17 | 106.932 | 99.27 | 61.738 | 50.586 |
| 2011-01-18 | 107.135 | 99.201 | 61.027 | 51.421 |
| 2011-01-19 | 107.207 | 98.954 | 59.571 | 50.913 |
| 2011-01-20 | 106.945 | 97.966 | 59.515 | 51.066 |
| 2011-01-21 | 106.945 | 97.966 | 60.474 | 51.628 |
| 2011-01-22 | 106.945 | 97.966 | 60.474 | 51.628 |
| 2011-01-23 | 106.663 | 97.102 | 60.474 | 51.628 |
| 2011-01-24 | 106.138 | 96.532 | 59.887 | 51.612 |
| 2011-01-25 | 105.857 | 96.769 | 59.797 | 50.682 |
| 2011-01-26 | 106.326 | 97.522 | 59.537 | 50.539 |
| 2011-01-27 | 106.629 | 96.398 | 60.147 | 51.252 |
| 2011-01-28 | 106.629 | 96.398 | 59.153 | 50.939 |
| 2011-01-29 | 106.629 | 96.398 | 59.153 | 50.939 |
| 2011-01-30 | 102.518 | 92.074 | 59.153 | 50.939 |
| 2011-01-31 | 103.446 | 92.568 | 59.819 | 50.825 |
| 2011-02-01 | 103.242 | 91.433 | 61.366 | 51.778 |
| 2011-02-02 | 104.134 | 91.223 | 60.926 | 52.179 |
| 2011-02-03 | 103.83 | 91.905 | 61.072 | 52.031 |
| 2011-02-04 | 103.83 | 91.905 | 61.106 | 52.184 |
| 2011-02-05 | 103.83 | 91.905 | 61.106 | 52.184 |
| 2011-02-06 | 105.558 | 94.192 | 61.106 | 52.184 |
| 2011-02-07 | 105.951 | 94.501 | 61.964 | 52.608 |
| 2011-02-08 | 105.72 | 94.883 | 62.427 | 52.87 |
| 2011-02-09 | 104.799 | 93.483 | 61.806 | 52.742 |
| 2011-02-10 | 103.567 | 92.19 | 61.58 | 52.003 |
| 2011-02-11 | 103.567 | 92.19 | 62.709 | 52.22 |
| 2011-02-12 | 103.567 | 92.19 | 62.709 | 52.22 |
| 2011-02-13 | 104.047 | 91.332 | 62.709 | 52.22 |
| 2011-02-14 | 104.637 | 94.599 | 62.788 | 52.131 |
| 2011-02-15 | 104.623 | 94.617 | 62.585 | 52.82 |
| 2011-02-16 | 105.99 | 96.969 | 62.686 | 54.103 |
| 2011-02-17 | 105.919 | 96.98 | 62.235 | 54.491 |
| 2011-02-18 | 105.919 | 96.98 | 62.302 | 54.21 |
| 2011-02-19 | 105.919 | 96.98 | 62.302 | 54.21 |
| 2011-02-20 | 105.866 | 97.011 | 62.302 | 54.21 |
| 2011-02-21 | 105.499 | 97.078 | 62.302 | 52.73 |
| 2011-02-22 | 104.179 | 95.567 | 60.124 | 52.239 |
| 2011-02-23 | 102.948 | 93.783 | 59.932 | 52.003 |
| 2011-02-24 | 101.122 | 92.132 | 59.616 | 51.528 |
| 2011-02-25 | 101.122 | 92.132 | 60.451 | 52.291 |
| 2011-02-26 | 101.122 | 92.132 | 60.451 | 52.291 |
| 2011-02-27 | 102.618 | 92.923 | 60.451 | 52.291 |
| 2011-02-28 | 102.261 | 92.219 | 60.282 | 52.16 |
| 2011-03-01 | 100.936 | 90.26 | 58.905 | 51.187 |
| 2011-03-02 | 99.947 | 89.355 | 58.725 | 51.047 |
| 2011-03-03 | 100.632 | 90.723 | 59.865 | 50.777 |
| 2011-03-04 | 100.632 | 90.723 | 58.995 | 50.052 |
| 2011-03-05 | 100.632 | 90.723 | 58.995 | 50.052 |
| 2011-03-06 | 100.063 | 89.846 | 58.995 | 50.052 |
| 2011-03-07 | 100.858 | 91.59 | 58.533 | 49.635 |
| 2011-03-08 | 99.88 | 91.816 | 60.113 | 50.148 |
| 2011-03-09 | 98.956 | 90.957 | 60.169 | 49.843 |
| 2011-03-10 | 99.633 | 91.671 | 58.747 | 49.309 |
| 2011-03-11 | 99.633 | 91.671 | 59.312 | 49.127 |
| 2011-03-12 | 99.633 | 91.671 | 59.312 | 49.127 |
| 2011-03-13 | 98.023 | 89.875 | 59.312 | 49.127 |
| 2011-03-14 | 98.566 | 91.794 | 58.826 | 49.263 |
| 2011-03-15 | 97.537 | 91.183 | 58.307 | 48.324 |
| 2011-03-16 | 98.31 | 92.071 | 57.359 | 47.058 |
| 2011-03-17 | 99.589 | 93.698 | 58.183 | 47.795 |
| 2011-03-18 | 99.589 | 93.698 | 58.792 | 47.752 |
| 2011-03-19 | 99.589 | 93.698 | 58.792 | 47.752 |
| 2011-03-20 | 99.589 | 93.698 | 58.792 | 47.752 |
| 2011-03-21 | 101.489 | 95.646 | 58.702 | 48.763 |
| 2011-03-22 | 101.946 | 96.433 | 58.363 | 48.636 |
| 2011-03-23 | 101.043 | 94.079 | 58.014 | 48.617 |
| 2011-03-24 | 100.937 | 93.335 | 58.194 | 49.118 |
| 2011-03-25 | 100.937 | 93.335 | 58.488 | 48.903 |
| 2011-03-26 | 100.937 | 93.335 | 58.488 | 48.903 |
| 2011-03-27 | 102.836 | 95.898 | 58.488 | 48.903 |
| 2011-03-28 | 103.227 | 96.771 | 58.273 | 49.123 |
| 2011-03-29 | 103.341 | 98.54 | 58.454 | 48.572 |
| 2011-03-30 | 103.74 | 97.985 | 58.837 | 48.555 |
| 2011-03-31 | 103.778 | 98.213 | 58.6 | 47.428 |
| 2011-04-01 | 103.778 | 98.213 | 59.176 | 48.477 |
| 2011-04-02 | 103.778 | 98.213 | 59.176 | 48.477 |
| 2011-04-03 | 104.458 | 98.495 | 59.176 | 48.477 |
| 2011-04-04 | 104.455 | 98.381 | 59.131 | 48.124 |
| 2011-04-05 | 103.903 | 97.684 | 59.108 | 48.045 |
| 2011-04-06 | 104.49 | 97.813 | 60.011 | 48.961 |
| 2011-04-07 | 103.309 | 96.331 | 59.695 | 49.487 |
| 2011-04-08 | 103.309 | 96.331 | 59.165 | 49.545 |
| 2011-04-09 | 103.309 | 96.331 | 59.165 | 49.545 |
| 2011-04-10 | 104.152 | 98.231 | 59.165 | 49.545 |
| 2011-04-11 | 104.313 | 98.999 | 59.108 | 49.456 |
| 2011-04-12 | 103.987 | 99.259 | 59.063 | 48.708 |
| 2011-04-13 | 103.891 | 99.787 | 58.431 | 49.003 |
| 2011-04-14 | 103.529 | 99.184 | 57.799 | 48.288 |
| 2011-04-15 | 103.529 | 99.184 | 57.709 | 47.976 |
| 2011-04-16 | 103.529 | 99.184 | 57.709 | 47.976 |
| 2011-04-17 | 104.079 | 99.817 | 57.709 | 47.976 |
| 2011-04-18 | 104.079 | 99.817 | 56.964 | 46.903 |
| 2011-04-19 | 104.079 | 99.817 | 56.998 | 46.877 |
| 2011-04-20 | 104.555 | 99.83 | 56.727 | 47.142 |
| 2011-04-21 | 104.979 | 100.038 | 56.964 | 47.826 |
| 2011-04-22 | 104.979 | 100.038 | 56.964 | 47.826 |
| 2011-04-23 | 104.979 | 100.038 | 56.964 | 47.826 |
| 2011-04-24 | 104.979 | 100.038 | 56.964 | 47.826 |
| 2011-04-25 | 104.979 | 100.038 | 56.975 | 47.826 |
| 2011-04-26 | 104.186 | 99.352 | 57.46 | 47.971 |
| 2011-04-27 | 104.033 | 98.503 | 58.014 | 48.043 |
| 2011-04-28 | 102.722 | 95.989 | 58.296 | 48.238 |
| 2011-04-29 | 102.722 | 95.989 | 58.16 | 48.343 |
| 2011-04-30 | 102.722 | 95.989 | 58.16 | 48.343 |
| 2011-05-01 | 101.299 | 94.866 | 58.16 | 48.343 |
| 2011-05-02 | 101.169 | 93.548 | 57.935 | 48.21 |
| 2011-05-03 | 100.165 | 92.997 | 58.476 | 47.993 |
| 2011-05-04 | 100.904 | 94.192 | 57.912 | 47.437 |
| 2011-05-05 | 99.708 | 92.559 | 57.144 | 46.922 |
| 2011-05-06 | 99.708 | 92.559 | 57.257 | 47.456 |
| 2011-05-07 | 99.708 | 92.559 | 57.257 | 47.456 |
| 2011-05-08 | 100.221 | 93.028 | 57.257 | 47.456 |
| 2011-05-09 | 100.221 | 93.028 | 57.054 | 46.841 |
| 2011-05-10 | 100.221 | 93.028 | 57.585 | 47.416 |
| 2011-05-11 | 101.641 | 94.946 | 57.02 | 47.502 |
| 2011-05-12 | 100.88 | 93.824 | 56.885 | 47.301 |
| 2011-05-13 | 100.88 | 93.824 | 55.88 | 46.81 |
| 2011-05-14 | 100.88 | 93.824 | 55.88 | 46.81 |
| 2011-05-15 | 99.871 | 92.096 | 55.88 | 46.81 |
| 2011-05-16 | 100.551 | 92.672 | 55.948 | 46.639 |
| 2011-05-17 | 100.45 | 92.546 | 56.874 | 46.341 |
| 2011-05-18 | 100.626 | 92.536 | 57.054 | 46.331 |
| 2011-05-19 | 100.822 | 92.266 | 57.111 | 46.572 |
| 2011-05-20 | 100.822 | 92.266 | 56.084 | 46.2 |
| 2011-05-21 | 100.822 | 92.266 | 56.084 | 46.2 |
| 2011-05-22 | 99.353 | 91.266 | 56.084 | 46.2 |
| 2011-05-23 | 98.331 | 89.776 | 55.271 | 45.294 |
| 2011-05-24 | 97.333 | 88.79 | 55.214 | 45.125 |
| 2011-05-25 | 95.464 | 87.252 | 55.169 | 46.083 |
| 2011-05-26 | 96.745 | 88.69 | 55.361 | 45.938 |
| 2011-05-27 | 96.745 | 88.69 | 56.117 | 46.431 |
| 2011-05-28 | 96.745 | 88.69 | 56.117 | 46.431 |
| 2011-05-29 | 97.821 | 90.517 | 56.117 | 46.431 |
| 2011-05-30 | 97.681 | 91.791 | 56.117 | 46.193 |
| 2011-05-31 | 99.018 | 93.358 | 56.546 | 46.712 |
| 2011-06-01 | 97.414 | 91.005 | 54.221 | 46.059 |
| 2011-06-02 | 95.973 | 90.228 | 54.312 | 45.52 |
| 2011-06-03 | 95.973 | 90.228 | 53.826 | 45.702 |
| 2011-06-04 | 95.973 | 90.228 | 53.826 | 45.702 |
| 2011-06-05 | 96.076 | 89.754 | 53.826 | 45.702 |
| 2011-06-06 | 96.061 | 89.58 | 52.731 | 44.996 |
| 2011-06-07 | 96.061 | 89.58 | 52.641 | 44.884 |
| 2011-06-08 | 96.061 | 89.58 | 52.336 | 44.305 |
| 2011-06-09 | 95.218 | 88.327 | 52.957 | 44.457 |
| 2011-06-10 | 95.218 | 88.327 | 52.743 | 43.895 |
| 2011-06-11 | 95.218 | 88.327 | 52.743 | 43.895 |
| 2011-06-12 | 94.049 | 88.474 | 52.743 | 43.895 |
| 2011-06-13 | 94.589 | 89.509 | 53.251 | 44.009 |
| 2011-06-14 | 95.475 | 89.833 | 53.555 | 44.529 |
| 2011-06-15 | 93.317 | 86.365 | 52.686 | 43.649 |
| 2011-06-16 | 94.363 | 88.537 | 52.98 | 43.546 |
| 2011-06-17 | 94.363 | 88.537 | 53.555 | 44.152 |
| 2011-06-18 | 94.363 | 88.537 | 53.555 | 44.152 |
| 2011-06-19 | 94.155 | 90.125 | 53.555 | 44.152 |
| 2011-06-20 | 93.779 | 90.524 | 53.296 | 43.747 |
| 2011-06-21 | 95.073 | 92.34 | 53.871 | 44.536 |
| 2011-06-22 | 95.705 | 92.218 | 53.375 | 44.083 |
| 2011-06-23 | 94.174 | 89.447 | 52.81 | 42.924 |
| 2011-06-24 | 94.174 | 89.447 | 52.28 | 42.245 |
| 2011-06-25 | 94.174 | 89.447 | 52.28 | 42.245 |
| 2011-06-26 | 93.521 | 88.693 | 52.28 | 42.245 |
| 2011-06-27 | 94.136 | 90.12 | 53.002 | 42.133 |
| 2011-06-28 | 95.526 | 92.215 | 53.115 | 42.698 |
| 2011-06-29 | 96.241 | 91.826 | 54.379 | 43.377 |
| 2011-06-30 | 95.68 | 90.522 | 54.537 | 44.235 |
| 2011-07-01 | 95.68 | 90.522 | 55.553 | 45.456 |
| 2011-07-02 | 95.68 | 90.522 | 55.553 | 45.456 |
| 2011-07-03 | 98.119 | 93.127 | 55.553 | 45.456 |
| 2011-07-04 | 97.931 | 93.65 | 55.553 | 45.191 |
| 2011-07-05 | 97.847 | 93.008 | 54.91 | 44.853 |
| 2011-07-06 | 97.143 | 91.214 | 54.537 | 44.078 |
| 2011-07-07 | 98.712 | 93.633 | 55.44 | 43.88 |
| 2011-07-08 | 98.712 | 93.633 | 54.56 | 42.853 |
| 2011-07-09 | 98.712 | 93.633 | 54.56 | 42.853 |
| 2011-07-10 | 99.297 | 94.158 | 54.56 | 42.853 |
| 2011-07-11 | 97.648 | 91.785 | 53.014 | 41.623 |
| 2011-07-12 | 97.883 | 91.245 | 52.889 | 41.53 |
| 2011-07-13 | 97.801 | 91.21 | 53.047 | 41.661 |
| 2011-07-14 | 97.809 | 91.767 | 52.393 | 41.346 |
| 2011-07-15 | 97.809 | 91.767 | 52.246 | 40.938 |
| 2011-07-16 | 97.809 | 91.767 | 52.246 | 40.938 |
| 2011-07-17 | 97.588 | 92.378 | 52.246 | 40.938 |
| 2011-07-18 | 96.737 | 91.786 | 51.501 | 39.634 |
| 2011-07-19 | 97.295 | 92.984 | 52.201 | 40.183 |
| 2011-07-20 | 98.207 | 93.718 | 52.957 | 41.665 |
| 2011-07-21 | 98.49 | 94.034 | 54.187 | 43.368 |
| 2011-07-22 | 98.49 | 94.034 | 53.973 | 43.289 |
| 2011-07-23 | 98.49 | 94.034 | 53.973 | 43.289 |
| 2011-07-24 | 98.819 | 93.85 | 53.973 | 43.289 |
| 2011-07-25 | 98.338 | 93.064 | 53.691 | 42.085 |
| 2011-07-26 | 98.359 | 93.736 | 53.499 | 42.03 |
| 2011-07-27 | 97.72 | 93.227 | 52.246 | 41.124 |
| 2011-07-28 | 96.047 | 91.036 | 52.144 | 41.675 |
| 2011-07-29 | 96.047 | 91.036 | 51.93 | 41.267 |
| 2011-07-30 | 96.047 | 91.036 | 51.93 | 41.267 |
| 2011-07-31 | 95.303 | 89.704 | 51.93 | 41.267 |
| 2011-08-01 | 93.629 | 87.958 | 51.828 | 40.426 |
| 2011-08-02 | 92.659 | 86.593 | 50.158 | 39.401 |
| 2011-08-03 | 91.866 | 86.995 | 50.463 | 38.516 |
| 2011-08-04 | 90.084 | 83.868 | 47.788 | 36.771 |
| 2011-08-05 | 90.084 | 83.868 | 46.749 | 36.411 |
| 2011-08-06 | 90.084 | 83.868 | 46.749 | 36.411 |
| 2011-08-07 | 83.599 | 76.547 | 46.749 | 36.411 |
| 2011-08-08 | 84.831 | 78.881 | 41.749 | 35.078 |
| 2011-08-09 | 84.831 | 78.881 | 44.673 | 35.291 |
| 2011-08-10 | 82.132 | 75.647 | 41.005 | 32.919 |
| 2011-08-11 | 82.387 | 75.627 | 43.521 | 34.013 |
| 2011-08-12 | 82.387 | 75.627 | 42.573 | 35.541 |
| 2011-08-13 | 82.387 | 75.627 | 42.573 | 35.541 |
| 2011-08-14 | 85.004 | 76.309 | 42.573 | 35.541 |
| 2011-08-15 | 84.618 | 76.385 | 44.357 | 35.51 |
| 2011-08-16 | 83.507 | 73.98 | 43.397 | 35.605 |
| 2011-08-17 | 85.604 | 76.387 | 43.725 | 35.214 |
| 2011-08-18 | 82.635 | 72.39 | 41.264 | 32.842 |
| 2011-08-19 | 82.635 | 72.39 | 40.056 | 32.249 |
| 2011-08-20 | 82.635 | 72.39 | 40.056 | 32.249 |
| 2011-08-21 | 83.168 | 73.671 | 40.056 | 32.249 |
| 2011-08-22 | 85.37 | 77.153 | 39.616 | 32.044 |
| 2011-08-23 | 85.061 | 77.526 | 41.208 | 32.032 |
| 2011-08-24 | 85.632 | 77.547 | 42.585 | 32.439 |
| 2011-08-25 | 83.826 | 74.467 | 42.494 | 32.628 |
| 2011-08-26 | 83.826 | 74.467 | 43.025 | 31.915 |
| 2011-08-27 | 83.826 | 74.467 | 43.025 | 31.915 |
| 2011-08-28 | 84.173 | 75.306 | 43.025 | 31.915 |
| 2011-08-29 | 86.165 | 77.7 | 44.977 | 32.537 |
| 2011-08-30 | 86.017 | 77.566 | 44.549 | 33.088 |
| 2011-08-31 | 87.094 | 78.306 | 45.09 | 34.084 |
| 2011-09-01 | 87.441 | 78.221 | 43.725 | 34.423 |
| 2011-09-02 | 87.441 | 78.221 | 41.761 | 32.964 |
| 2011-09-03 | 87.441 | 78.221 | 41.761 | 32.964 |
| 2011-09-04 | 83.898 | 74.639 | 41.761 | 32.964 |
| 2011-09-05 | 82.243 | 73.392 | 41.761 | 31.018 |
| 2011-09-06 | 80.015 | 69.646 | 41.061 | 30.37 |
| 2011-09-07 | 82.603 | 72.856 | 43.476 | 31.586 |
| 2011-09-08 | 81.997 | 72.019 | 42.314 | 31.86 |
| 2011-09-09 | 81.997 | 72.019 | 40.892 | 30.189 |
| 2011-09-10 | 81.997 | 72.019 | 40.892 | 30.189 |
| 2011-09-11 | 79.154 | 68.281 | 40.892 | 30.189 |
| 2011-09-12 | 77.169 | 66.311 | 41.648 | 28.813 |
| 2011-09-13 | 78.947 | 67.827 | 42.144 | 29.846 |
| 2011-09-14 | 80.399 | 69.534 | 42.867 | 29.998 |
| 2011-09-15 | 82.105 | 71.343 | 43.849 | 31.221 |
| 2011-09-16 | 82.105 | 71.343 | 43.668 | 31.376 |
| 2011-09-17 | 82.105 | 71.343 | 43.668 | 31.376 |
| 2011-09-18 | 82.883 | 69.783 | 43.668 | 31.376 |
| 2011-09-19 | 80.658 | 66.587 | 42.427 | 30.298 |
| 2011-09-20 | 82.895 | 70.42 | 42.28 | 30.594 |
| 2011-09-21 | 83.815 | 72.305 | 39.955 | 30.108 |
| 2011-09-22 | 80.216 | 69.014 | 38.883 | 28.377 |
| 2011-09-23 | 80.216 | 69.014 | 39.503 | 29.378 |
| 2011-09-24 | 80.216 | 69.014 | 39.503 | 29.378 |
| 2011-09-25 | 81.6 | 70.504 | 39.503 | 29.378 |
| 2011-09-26 | 82.031 | 70.349 | 41.591 | 30.496 |
| 2011-09-27 | 83.339 | 71.307 | 41.569 | 32.575 |
| 2011-09-28 | 83.339 | 71.307 | 40.135 | 32.027 |
| 2011-09-29 | 83.339 | 71.307 | 41.467 | 32.826 |
| 2011-09-30 | 83.339 | 71.307 | 39.887 | 31.87 |
| 2011-10-01 | 83.339 | 71.307 | 39.887 | 31.87 |
| 2011-10-02 | 81.972 | 69.138 | 39.887 | 31.87 |
| 2011-10-03 | 82.441 | 69.601 | 37.98 | 30.995 |
| 2011-10-04 | 79.356 | 65.273 | 39.695 | 29.753 |
| 2011-10-05 | 80.738 | 65.978 | 40.113 | 31.123 |
| 2011-10-06 | 81.628 | 66.34 | 41.941 | 32.425 |
| 2011-10-07 | 81.628 | 66.34 | 40.135 | 32.425 |
| 2011-10-08 | 81.628 | 66.34 | 40.135 | 32.425 |
| 2011-10-09 | 80.607 | 65.031 | 40.135 | 32.425 |
| 2011-10-10 | 83.708 | 68.271 | 42.269 | 33.178 |
| 2011-10-11 | 84.339 | 69.044 | 42.54 | 33.298 |
| 2011-10-12 | 84.339 | 69.044 | 43.939 | 34.27 |
| 2011-10-13 | 84.339 | 69.044 | 42.652 | 33.009 |
| 2011-10-14 | 84.339 | 69.044 | 42.889 | 32.835 |
| 2011-10-15 | 84.339 | 69.044 | 42.889 | 32.835 |
| 2011-10-16 | 87.861 | 73.526 | 42.889 | 32.835 |
| 2011-10-17 | 87.825 | 73.334 | 41.208 | 32.296 |
| 2011-10-18 | 87.489 | 73.292 | 43.725 | 31.955 |
| 2011-10-19 | 87.489 | 73.292 | 42.438 | 32.64 |
| 2011-10-20 | 87.489 | 73.292 | 43.239 | 31.338 |
| 2011-10-21 | 87.489 | 73.292 | 43.916 | 32.525 |
| 2011-10-22 | 87.489 | 73.292 | 43.916 | 32.525 |
| 2011-10-23 | 88.739 | 75.866 | 43.916 | 32.525 |
| 2011-10-24 | 88.641 | 74.943 | 45.203 | 33.083 |
| 2011-10-25 | 88.515 | 73.516 | 43.77 | 32.723 |
| 2011-10-26 | 88.658 | 74.821 | 44.673 | 32.621 |
| 2011-10-27 | 90.724 | 77.767 | 47.37 | 35.527 |
| 2011-10-28 | 90.724 | 77.767 | 47.201 | 35.493 |
| 2011-10-29 | 90.724 | 77.767 | 47.201 | 35.493 |
| 2011-10-30 | 88.699 | 75.367 | 47.201 | 35.493 |
| 2011-10-31 | 87.782 | 75.18 | 45.248 | 33.815 |
| 2011-11-01 | 85.604 | 71.906 | 43.036 | 31.715 |
| 2011-11-02 | 85.529 | 71.407 | 44.447 | 31.946 |
| 2011-11-03 | 86.042 | 70.748 | 45.26 | 32.561 |
| 2011-11-04 | 86.042 | 70.748 | 44.582 | 32.12 |
| 2011-11-05 | 86.042 | 70.748 | 44.582 | 32.12 |
| 2011-11-06 | 86.698 | 70.47 | 44.582 | 32.12 |
| 2011-11-07 | 86.554 | 70.772 | 45.011 | 31.819 |
| 2011-11-08 | 87.805 | 72.056 | 46.095 | 32.199 |
| 2011-11-09 | 85.436 | 68.393 | 43.375 | 31.002 |
| 2011-11-10 | 86.251 | 68.858 | 43.713 | 30.79 |
| 2011-11-11 | 86.251 | 68.858 | 44.628 | 31.905 |
| 2011-11-12 | 86.251 | 68.858 | 44.628 | 31.905 |
| 2011-11-13 | 88.251 | 70.55 | 44.628 | 31.905 |
| 2011-11-14 | 87.481 | 68.461 | 43.533 | 31.347 |
| 2011-11-15 | 86.817 | 68.894 | 43.747 | 30.709 |
| 2011-11-16 | 86.615 | 68.77 | 42.901 | 30.694 |
| 2011-11-17 | 86.124 | 67.557 | 42.099 | 30.008 |
| 2011-11-18 | 86.124 | 67.557 | 42.348 | 29.872 |
| 2011-11-19 | 86.124 | 67.557 | 42.348 | 29.872 |
| 2011-11-20 | 83.918 | 65.613 | 42.348 | 29.872 |
| 2011-11-21 | 81.931 | 63.679 | 41.084 | 28.756 |
| 2011-11-22 | 80.874 | 62.318 | 40.564 | 28.241 |
| 2011-11-23 | 80.508 | 61.979 | 39.187 | 27.624 |
| 2011-11-24 | 79.652 | 61.013 | 39.187 | 27.903 |
| 2011-11-25 | 79.652 | 61.013 | 39.391 | 28.11 |
| 2011-11-26 | 79.652 | 61.013 | 39.391 | 28.11 |
| 2011-11-27 | 80.553 | 62.706 | 39.391 | 28.11 |
| 2011-11-28 | 83.028 | 65.295 | 40.463 | 29.702 |
| 2011-11-29 | 81.513 | 62.515 | 40.214 | 29.722 |
| 2011-11-30 | 84.589 | 67.171 | 43.115 | 31.014 |
| 2011-12-01 | 85.038 | 67.266 | 42.754 | 30.699 |
| 2011-12-02 | 85.038 | 67.266 | 43.555 | 32.005 |
| 2011-12-03 | 85.038 | 67.266 | 43.555 | 32.005 |
| 2011-12-04 | 84.863 | 67.034 | 43.555 | 32.005 |
| 2011-12-05 | 86.483 | 70.138 | 44.729 | 32.814 |
| 2011-12-06 | 84.992 | 68.126 | 44.323 | 32.582 |
| 2011-12-07 | 83.431 | 66.141 | 44.752 | 32.437 |
| 2011-12-08 | 83.664 | 67.006 | 42.991 | 31.421 |
| 2011-12-09 | 83.664 | 67.006 | 44.165 | 32.227 |
| 2011-12-10 | 83.664 | 67.006 | 44.165 | 32.227 |
| 2011-12-11 | 84.947 | 68.729 | 44.165 | 32.227 |
| 2011-12-12 | 83.186 | 66.012 | 43.081 | 30.987 |
| 2011-12-13 | 84.044 | 67.013 | 42.415 | 30.782 |
| 2011-12-14 | 83.964 | 66.834 | 42.201 | 29.941 |
| 2011-12-15 | 84.911 | 68.323 | 42.325 | 30.341 |
| 2011-12-16 | 84.911 | 68.323 | 42.562 | 30.267 |
| 2011-12-17 | 84.911 | 68.323 | 42.562 | 30.267 |
| 2011-12-18 | 84.443 | 67.828 | 42.562 | 30.267 |
| 2011-12-19 | 85.212 | 68.938 | 41.411 | 30.215 |
| 2011-12-20 | 85.493 | 70.363 | 43.115 | 31.2 |
| 2011-12-21 | 84.405 | 68.483 | 43.555 | 30.983 |
| 2011-12-22 | 84.39 | 67.289 | 44.786 | 31.595 |
| 2011-12-23 | 84.39 | 67.289 | 45.079 | 31.729 |
| 2011-12-24 | 84.39 | 67.289 | 45.079 | 31.729 |
| 2011-12-25 | 85.978 | 68.926 | 45.079 | 31.729 |
| 2011-12-26 | 86.363 | 69.456 | 45.079 | 31.729 |
| 2011-12-27 | 86.347 | 69.074 | 44.684 | 31.538 |
| 2011-12-28 | 85.863 | 67.541 | 43.883 | 30.987 |
| 2011-12-29 | 84.088 | 65.619 | 44.808 | 31.333 |
| 2011-12-30 | 84.088 | 65.619 | 44.447 | 31.598 |
| 2011-12-31 | 84.088 | 65.619 | 44.447 | 31.598 |
| 2012-01-01 | 85.109 | 67.113 | 44.447 | 31.598 |
| 2012-01-02 | 85.96 | 67.868 | 44.447 | 31.979 |
| 2012-01-03 | 86.297 | 68.912 | 45.903 | 32.573 |
| 2012-01-04 | 86.426 | 68.904 | 46.061 | 32.051 |
| 2012-01-05 | 86.517 | 69.323 | 47.077 | 31.014 |
| 2012-01-06 | 86.517 | 69.323 | 46.941 | 30.759 |
| 2012-01-07 | 86.517 | 69.323 | 46.941 | 30.759 |
| 2012-01-08 | 86.818 | 69.83 | 46.941 | 30.759 |
| 2012-01-09 | 86.842 | 69.096 | 47.494 | 30.079 |
| 2012-01-10 | 88.287 | 70.371 | 48.375 | 31.171 |
| 2012-01-11 | 87.68 | 69.223 | 48.962 | 31.326 |
| 2012-01-12 | 88.08 | 70.371 | 49.221 | 31.679 |
| 2012-01-13 | 88.08 | 70.371 | 49.029 | 32.053 |
| 2012-01-14 | 88.08 | 70.371 | 49.029 | 32.053 |
| 2012-01-15 | 86.567 | 68.469 | 49.029 | 32.053 |
| 2012-01-16 | 87.415 | 69.22 | 49.029 | 32.23 |
| 2012-01-17 | 88.584 | 70.829 | 48.341 | 32.563 |
| 2012-01-18 | 88.313 | 70.553 | 48.883 | 32.523 |
| 2012-01-19 | 88.698 | 71.177 | 48.747 | 34.53 |
| 2012-01-20 | 88.698 | 71.177 | 49.097 | 34.847 |
| 2012-01-21 | 88.698 | 71.177 | 49.097 | 34.847 |
| 2012-01-22 | 88.56 | 71.438 | 49.097 | 34.847 |
| 2012-01-23 | 88.183 | 71.477 | 49.21 | 35.567 |
| 2012-01-24 | 87.505 | 70.749 | 49.063 | 35.219 |
| 2012-01-25 | 87.05 | 69.746 | 49.131 | 35.174 |
| 2012-01-26 | 88.026 | 71.551 | 48.036 | 35.689 |
| 2012-01-27 | 88.026 | 71.551 | 48.386 | 35.424 |
| 2012-01-28 | 88.026 | 71.551 | 48.386 | 35.424 |
| 2012-01-29 | 87.243 | 71.604 | 48.386 | 35.424 |
| 2012-01-30 | 86.686 | 70.566 | 47.856 | 34.323 |
| 2012-01-31 | 87.114 | 71.225 | 48.047 | 34.614 |
| 2012-02-01 | 87.464 | 71.511 | 48.871 | 35.918 |
| 2012-02-02 | 87.427 | 70.843 | 49.233 | 36.294 |
| 2012-02-03 | 87.427 | 70.843 | 50.847 | 37.205 |
| 2012-02-04 | 87.427 | 70.843 | 50.847 | 37.205 |
| 2012-02-05 | 88.06 | 71.855 | 50.847 | 37.205 |
| 2012-02-06 | 87.093 | 70.742 | 50.451 | 37.026 |
| 2012-02-07 | 87.3 | 70.313 | 50.451 | 37.25 |
| 2012-02-08 | 87.3 | 70.313 | 51.05 | 37.46 |
| 2012-02-09 | 87.3 | 70.313 | 50.914 | 37.703 |
| 2012-02-10 | 87.3 | 70.313 | 50.26 | 36.747 |
| 2012-02-11 | 87.3 | 70.313 | 50.26 | 36.747 |
| 2012-02-12 | 87.544 | 71.955 | 50.26 | 36.747 |
| 2012-02-13 | 87.491 | 72.178 | 50.677 | 36.943 |
| 2012-02-14 | 87.116 | 70.993 | 50.023 | 36.487 |
| 2012-02-15 | 87.491 | 71.021 | 49.887 | 37.122 |
| 2012-02-16 | 86.818 | 70.542 | 50.959 | 37.098 |
| 2012-02-17 | 86.818 | 70.542 | 51.456 | 37.603 |
| 2012-02-18 | 86.818 | 70.542 | 51.456 | 37.603 |
| 2012-02-19 | 87.14 | 71.277 | 51.456 | 37.603 |
| 2012-02-20 | 87.547 | 71.344 | 51.456 | 38.125 |
| 2012-02-21 | 87.631 | 70.957 | 51.4 | 37.88 |
| 2012-02-22 | 87.413 | 70.259 | 50.35 | 36.952 |
| 2012-02-23 | 85.923 | 68.037 | 50.903 | 36.669 |
| 2012-02-24 | 85.923 | 68.037 | 50.451 | 37.033 |
| 2012-02-25 | 85.923 | 68.037 | 50.451 | 37.033 |
| 2012-02-26 | 84.342 | 65.265 | 50.451 | 37.033 |
| 2012-02-27 | 84.561 | 65.441 | 51.129 | 36.509 |
| 2012-02-28 | 83.912 | 64.188 | 51.422 | 36.626 |
| 2012-02-29 | 85.082 | 64.96 | 51.14 | 36.79 |
| 2012-03-01 | 85.867 | 65.395 | 51.682 | 37.47 |
| 2012-03-02 | 85.867 | 65.395 | 51.456 | 37.691 |
| 2012-03-03 | 85.867 | 65.395 | 51.456 | 37.691 |
| 2012-03-04 | 86.417 | 65.827 | 51.456 | 37.691 |
| 2012-03-05 | 86.027 | 65.615 | 50.801 | 37.117 |
| 2012-03-06 | 84.699 | 64.333 | 49.436 | 35.555 |
| 2012-03-07 | 84.92 | 64.231 | 50.372 | 35.887 |
| 2012-03-08 | 84.92 | 64.231 | 51.095 | 36.621 |
| 2012-03-09 | 84.92 | 64.231 | 51.603 | 36.447 |
| 2012-03-10 | 84.92 | 64.231 | 51.603 | 36.447 |
| 2012-03-11 | 85.448 | 64.216 | 51.603 | 36.447 |
| 2012-03-12 | 84.767 | 63.759 | 51.253 | 35.996 |
| 2012-03-13 | 85.374 | 64.455 | 53.6 | 37.172 |
| 2012-03-14 | 87.584 | 68.626 | 54.3 | 37.739 |
| 2012-03-15 | 87.275 | 70.074 | 55.779 | 37.965 |
| 2012-03-16 | 87.275 | 70.074 | 56.14 | 38.395 |
| 2012-03-17 | 87.275 | 70.074 | 56.14 | 38.395 |
| 2012-03-18 | 87.729 | 70.604 | 56.14 | 38.395 |
| 2012-03-19 | 87.592 | 70.499 | 56.4 | 38.442 |
| 2012-03-20 | 87.517 | 70.308 | 56.637 | 37.808 |
| 2012-03-21 | 87.726 | 70.379 | 56.321 | 37.462 |
| 2012-03-22 | 88.123 | 70.702 | 55.406 | 36.764 |
| 2012-03-23 | 88.123 | 70.702 | 55.903 | 36.843 |
| 2012-03-24 | 88.123 | 70.702 | 55.903 | 36.843 |
| 2012-03-25 | 88.859 | 72.877 | 55.903 | 36.843 |
| 2012-03-26 | 90.425 | 74.473 | 56.727 | 36.914 |
| 2012-03-27 | 90.503 | 74.166 | 55.982 | 36.79 |
| 2012-03-28 | 90.295 | 72.853 | 56.569 | 36.256 |
| 2012-03-29 | 88.728 | 70.463 | 55.959 | 35.21 |
| 2012-03-30 | 88.728 | 70.463 | 56.14 | 35.598 |
| 2012-03-31 | 88.728 | 70.463 | 56.14 | 35.598 |
| 2012-04-01 | 89.292 | 71.163 | 56.14 | 35.598 |
| 2012-04-02 | 89.899 | 71.463 | 56.467 | 35.765 |
| 2012-04-03 | 90.776 | 71.993 | 56.321 | 34.892 |
| 2012-04-04 | 90.366 | 72.327 | 55.305 | 34.156 |
| 2012-04-05 | 90.531 | 73.284 | 55.158 | 33.994 |
| 2012-04-06 | 90.531 | 73.284 | 55.158 | 33.994 |
| 2012-04-07 | 90.531 | 73.284 | 55.158 | 33.994 |
| 2012-04-08 | 90.062 | 72.588 | 55.158 | 33.994 |
| 2012-04-09 | 89.83 | 72.22 | 54.097 | 33.994 |
| 2012-04-10 | 90.154 | 72.395 | 52.856 | 32.554 |
| 2012-04-11 | 89.401 | 71.733 | 53.95 | 33.133 |
| 2012-04-12 | 89.401 | 71.733 | 54.955 | 33.596 |
| 2012-04-13 | 89.401 | 71.733 | 53.239 | 32.57 |
| 2012-04-14 | 89.401 | 71.733 | 53.239 | 32.57 |
| 2012-04-15 | 88.098 | 69.769 | 53.239 | 32.57 |
| 2012-04-16 | 89.408 | 71.457 | 53.792 | 32.179 |
| 2012-04-17 | 90.44 | 72.025 | 54.729 | 33.507 |
| 2012-04-18 | 90.364 | 71.142 | 54.391 | 32.802 |
| 2012-04-19 | 90.98 | 70.512 | 53.984 | 32.342 |
| 2012-04-20 | 90.98 | 70.512 | 53.679 | 32.702 |
| 2012-04-21 | 90.98 | 70.512 | 53.679 | 32.702 |
| 2012-04-22 | 91.698 | 71.543 | 53.679 | 32.702 |
| 2012-04-23 | 90.634 | 70.359 | 53.363 | 31.736 |
| 2012-04-24 | 91.523 | 71.713 | 53.984 | 32.377 |
| 2012-04-25 | 91.523 | 71.713 | 54.549 | 32.93 |
| 2012-04-26 | 91.523 | 71.713 | 54.977 | 32.561 |
| 2012-04-27 | 91.523 | 71.713 | 55.124 | 33.035 |
| 2012-04-28 | 91.523 | 71.713 | 55.124 | 33.035 |
| 2012-04-29 | 91.632 | 71.939 | 55.124 | 33.035 |
| 2012-04-30 | 91.65 | 71.658 | 54.492 | 32.675 |
| 2012-05-01 | 91.709 | 71.765 | 55.181 | 32.961 |
| 2012-05-02 | 91.234 | 71.319 | 54.673 | 32.392 |
| 2012-05-03 | 91.735 | 72.263 | 54.334 | 32.084 |
| 2012-05-04 | 91.735 | 72.263 | 53.251 | 31.905 |
| 2012-05-05 | 91.735 | 72.263 | 53.251 | 31.905 |
| 2012-05-06 | 90.106 | 70.687 | 53.251 | 31.905 |
| 2012-05-07 | 90.065 | 70.541 | 53.758 | 32.437 |
| 2012-05-08 | 89.929 | 70.964 | 53.318 | 31.812 |
| 2012-05-09 | 88.821 | 69.045 | 52.483 | 31.259 |
| 2012-05-10 | 89.285 | 70.294 | 52.98 | 32.077 |
| 2012-05-11 | 89.285 | 70.294 | 52.37 | 31.824 |
| 2012-05-12 | 89.285 | 70.294 | 52.37 | 31.824 |
| 2012-05-13 | 88.76 | 69.425 | 52.37 | 31.824 |
| 2012-05-14 | 87.699 | 68.153 | 51.016 | 30.947 |
| 2012-05-15 | 86.195 | 66.023 | 50.598 | 30.391 |
| 2012-05-16 | 86.871 | 67.162 | 49.966 | 30.077 |
| 2012-05-17 | 84.976 | 65.152 | 49.097 | 29.366 |
| 2012-05-18 | 84.976 | 65.152 | 48.623 | 29.054 |
| 2012-05-19 | 84.976 | 65.152 | 48.623 | 29.054 |
| 2012-05-20 | 84.343 | 65.859 | 48.623 | 29.054 |
| 2012-05-21 | 83.965 | 66.052 | 48.905 | 29.347 |
| 2012-05-22 | 84.25 | 66.04 | 49.458 | 30.234 |
| 2012-05-23 | 82.973 | 63.728 | 49.842 | 29.369 |
| 2012-05-24 | 83.437 | 62.726 | 49.876 | 29.772 |
| 2012-05-25 | 83.437 | 62.726 | 49.752 | 29.698 |
| 2012-05-26 | 83.437 | 62.726 | 49.752 | 29.698 |
| 2012-05-27 | 83.437 | 62.726 | 49.752 | 29.698 |
| 2012-05-28 | 83.922 | 63.339 | 49.752 | 29.404 |
| 2012-05-29 | 83.657 | 62.656 | 50.474 | 29.3 |
| 2012-05-30 | 83.113 | 61.566 | 49.233 | 28.849 |
| 2012-05-31 | 84.328 | 62.21 | 49.752 | 28.851 |
| 2012-06-01 | 84.328 | 62.21 | 47.325 | 28.541 |
| 2012-06-02 | 84.328 | 62.21 | 47.325 | 28.541 |
| 2012-06-03 | 82.392 | 61.505 | 47.325 | 28.541 |
| 2012-06-04 | 83.034 | 62.959 | 46.275 | 28.789 |
| 2012-06-05 | 83.45 | 63.412 | 46.964 | 29.021 |
| 2012-06-06 | 84.586 | 64.832 | 48.375 | 30.165 |
| 2012-06-07 | 86.111 | 65.653 | 48.42 | 30.771 |
| 2012-06-08 | 86.111 | 65.653 | 49.221 | 30.532 |
| 2012-06-09 | 86.111 | 65.653 | 49.221 | 30.532 |
| 2012-06-10 | 86.502 | 66.298 | 49.221 | 30.532 |
| 2012-06-11 | 85.645 | 64.139 | 48.093 | 30.341 |
| 2012-06-12 | 85.477 | 64.936 | 49.086 | 30.422 |
| 2012-06-13 | 84.325 | 63.939 | 49.007 | 30.453 |
| 2012-06-14 | 83.545 | 63.16 | 49.718 | 30.542 |
| 2012-06-15 | 83.545 | 63.16 | 50.474 | 31.085 |
| 2012-06-16 | 83.545 | 63.16 | 50.474 | 31.085 |
| 2012-06-17 | 84.804 | 64.213 | 50.474 | 31.085 |
| 2012-06-18 | 84.574 | 64.091 | 50.248 | 30.515 |
| 2012-06-19 | 85.448 | 64.182 | 51.253 | 31.281 |
| 2012-06-20 | 85.007 | 63.134 | 51.411 | 31.753 |
| 2012-06-21 | 84.658 | 62.317 | 50.214 | 31.576 |
| 2012-06-22 | 84.658 | 62.317 | 50.892 | 31.617 |
| 2012-06-23 | 84.658 | 62.317 | 50.892 | 31.617 |
| 2012-06-24 | 85.026 | 62.047 | 50.892 | 31.617 |
| 2012-06-25 | 84.028 | 61.625 | 49.537 | 30.666 |
| 2012-06-26 | 83.911 | 61.582 | 49.819 | 30.377 |
| 2012-06-27 | 84.08 | 61.006 | 50.508 | 31.133 |
| 2012-06-28 | 83.346 | 59.255 | 50.327 | 30.399 |
| 2012-06-29 | 83.346 | 59.255 | 51.682 | 31.657 |
| 2012-06-30 | 83.346 | 59.255 | 51.682 | 31.657 |
| 2012-07-01 | 85.082 | 61.935 | 51.682 | 31.657 |
| 2012-07-02 | 84.815 | 61.626 | 52.009 | 32.246 |
| 2012-07-03 | 84.922 | 60.899 | 52.19 | 32.466 |
| 2012-07-04 | 84.941 | 61.396 | 52.19 | 32.315 |
| 2012-07-05 | 85.162 | 61.847 | 51.388 | 31.924 |
| 2012-07-06 | 85.162 | 61.847 | 51.005 | 31.226 |
| 2012-07-07 | 85.162 | 61.847 | 51.005 | 31.226 |
| 2012-07-08 | 84.616 | 61.836 | 51.005 | 31.226 |
| 2012-07-09 | 84.525 | 60.938 | 50.734 | 31.097 |
| 2012-07-10 | 84.629 | 61.314 | 50.282 | 31.295 |
| 2012-07-11 | 84.119 | 61.838 | 50.892 | 31.507 |
| 2012-07-12 | 83.602 | 61.699 | 50.181 | 30.928 |
| 2012-07-13 | 83.602 | 61.699 | 51.817 | 31.052 |
| 2012-07-14 | 83.602 | 61.699 | 51.817 | 31.052 |
| 2012-07-15 | 83.215 | 60.373 | 51.817 | 31.052 |
| 2012-07-16 | 82.966 | 60.211 | 51.749 | 30.878 |
| 2012-07-17 | 83.256 | 59.612 | 52.291 | 30.594 |
| 2012-07-18 | 83.109 | 59.063 | 51.907 | 30.854 |
| 2012-07-19 | 84.529 | 58.031 | 51.637 | 31.183 |
| 2012-07-20 | 84.529 | 58.031 | 50.643 | 30.046 |
| 2012-07-21 | 84.529 | 58.031 | 50.643 | 30.046 |
| 2012-07-22 | 83.914 | 57.561 | 50.643 | 30.046 |
| 2012-07-23 | 82.53 | 56.252 | 50.169 | 29.235 |
| 2012-07-24 | 83.174 | 55.289 | 50.181 | 28.837 |
| 2012-07-25 | 83.972 | 56.491 | 50.406 | 28.98 |
| 2012-07-26 | 84.919 | 56.859 | 51.242 | 30.186 |
| 2012-07-27 | 84.919 | 56.859 | 52.032 | 30.973 |
| 2012-07-28 | 84.919 | 56.859 | 52.032 | 30.973 |
| 2012-07-29 | 84.919 | 56.859 | 52.032 | 30.973 |
| 2012-07-30 | 86.168 | 56.88 | 51.603 | 31.948 |
| 2012-07-31 | 85.655 | 57.236 | 51.377 | 31.336 |
| 2012-08-01 | 85.619 | 57.781 | 51.117 | 31.486 |
| 2012-08-02 | 84.603 | 57.737 | 50.44 | 30.554 |
| 2012-08-03 | 84.603 | 57.737 | 51.986 | 32.098 |
| 2012-08-04 | 84.603 | 57.737 | 51.986 | 32.098 |
| 2012-08-05 | 84.922 | 57.591 | 51.986 | 32.098 |
| 2012-08-06 | 84.895 | 56.652 | 52.054 | 32.325 |
| 2012-08-07 | 85.926 | 57.411 | 52.46 | 32.368 |
| 2012-08-08 | 85.867 | 58.299 | 52.517 | 32.673 |
| 2012-08-09 | 85.601 | 58.082 | 52.573 | 32.83 |
| 2012-08-10 | 85.601 | 58.082 | 52.607 | 32.733 |
| 2012-08-11 | 85.601 | 58.082 | 52.607 | 32.733 |
| 2012-08-12 | 84.892 | 56.812 | 52.607 | 32.733 |
| 2012-08-13 | 83.534 | 55.056 | 52.54 | 32.709 |
| 2012-08-14 | 84.048 | 56.568 | 52.528 | 32.933 |
| 2012-08-15 | 83.687 | 56.899 | 52.743 | 32.973 |
| 2012-08-16 | 84.392 | 59.138 | 53.025 | 33.498 |
| 2012-08-17 | 84.392 | 59.138 | 53.318 | 34.091 |
| 2012-08-18 | 84.392 | 59.138 | 53.318 | 34.091 |
| 2012-08-19 | 84.787 | 59.959 | 53.318 | 34.091 |
| 2012-08-20 | 84.573 | 59.099 | 53.476 | 33.624 |
| 2012-08-21 | 85.352 | 61.069 | 53.578 | 34.223 |
| 2012-08-22 | 85.046 | 61.047 | 53.499 | 33.798 |
| 2012-08-23 | 84.605 | 60.53 | 52.923 | 33.512 |
| 2012-08-24 | 84.605 | 60.53 | 53.239 | 33.429 |
| 2012-08-25 | 84.605 | 60.53 | 53.239 | 33.429 |
| 2012-08-26 | 84.818 | 60.077 | 53.239 | 33.429 |
| 2012-08-27 | 85.115 | 59.802 | 53.239 | 33.7 |
| 2012-08-28 | 84.689 | 59.524 | 53.16 | 33.484 |
| 2012-08-29 | 85.576 | 61.317 | 53.454 | 33.336 |
| 2012-08-30 | 85.901 | 60.369 | 53.081 | 32.921 |
| 2012-08-31 | 85.901 | 60.369 | 53.262 | 33.546 |
| 2012-09-01 | 85.901 | 60.369 | 53.262 | 33.546 |
| 2012-09-02 | 85.4 | 59.595 | 53.262 | 33.546 |
| 2012-09-03 | 85.76 | 59.848 | 53.262 | 33.648 |
| 2012-09-04 | 85.14 | 58.923 | 53.318 | 33.329 |
| 2012-09-05 | 85.123 | 58.814 | 53.194 | 33.476 |
| 2012-09-06 | 85.022 | 58.71 | 54.752 | 34.947 |
| 2012-09-07 | 85.022 | 58.71 | 55.609 | 35.696 |
| 2012-09-08 | 85.022 | 58.71 | 55.609 | 35.696 |
| 2012-09-09 | 86.463 | 61.432 | 55.609 | 35.696 |
| 2012-09-10 | 86.535 | 62.492 | 55.181 | 35.765 |
| 2012-09-11 | 86.463 | 62.782 | 55.632 | 36.158 |
| 2012-09-12 | 86.776 | 62.782 | 56.016 | 36.642 |
| 2012-09-13 | 86.941 | 63.569 | 57.585 | 36.29 |
| 2012-09-14 | 86.941 | 63.569 | 58.284 | 37.25 |
| 2012-09-15 | 86.941 | 63.569 | 58.284 | 37.25 |
| 2012-09-16 | 86.941 | 63.569 | 58.284 | 37.25 |
| 2012-09-17 | 86.941 | 63.569 | 57.302 | 37.212 |
| 2012-09-18 | 86.941 | 63.569 | 57.043 | 36.547 |
| 2012-09-19 | 87.267 | 63.198 | 57.325 | 36.721 |
| 2012-09-20 | 87.386 | 63.554 | 56.941 | 36.392 |
| 2012-09-21 | 87.386 | 63.554 | 56.682 | 36.886 |
| 2012-09-22 | 87.386 | 63.554 | 56.682 | 36.886 |
| 2012-09-23 | 88.252 | 65.107 | 56.682 | 36.886 |
| 2012-09-24 | 89.525 | 66.978 | 56.907 | 36.645 |
| 2012-09-25 | 89.525 | 66.978 | 55.959 | 36.843 |
| 2012-09-26 | 89.525 | 66.978 | 55.53 | 35.467 |
| 2012-09-27 | 90.627 | 69.4 | 56.163 | 35.817 |
| 2012-09-28 | 90.627 | 69.4 | 55.959 | 35.212 |
| 2012-09-29 | 90.627 | 69.4 | 55.959 | 35.212 |
| 2012-09-30 | 90.627 | 69.4 | 55.959 | 35.212 |
| 2012-10-01 | 90.627 | 69.4 | 56.106 | 35.975 |
| 2012-10-02 | 92.726 | 72.831 | 56.287 | 35.751 |
| 2012-10-03 | 93.545 | 74.536 | 56.941 | 35.736 |
| 2012-10-04 | 93.426 | 72.922 | 58.059 | 35.884 |
| 2012-10-05 | 93.426 | 72.922 | 58.002 | 36.53 |
| 2012-10-06 | 93.426 | 72.922 | 58.002 | 36.53 |
| 2012-10-07 | 93.426 | 72.922 | 58.002 | 36.53 |
| 2012-10-08 | 93.426 | 72.922 | 57.754 | 35.927 |
| 2012-10-09 | 91.887 | 73.413 | 57.393 | 35.605 |
| 2012-10-10 | 91.735 | 73.852 | 57.46 | 35.412 |
| 2012-10-11 | 92.573 | 75.427 | 57.867 | 36.101 |
| 2012-10-12 | 92.573 | 75.427 | 56.445 | 35.927 |
| 2012-10-13 | 92.573 | 75.427 | 56.445 | 35.927 |
| 2012-10-14 | 92.436 | 75.882 | 56.445 | 35.927 |
| 2012-10-15 | 93.507 | 77.678 | 56.998 | 36.321 |
| 2012-10-16 | 93.893 | 78.294 | 56.738 | 37.386 |
| 2012-10-17 | 93.908 | 76.626 | 57.619 | 37.734 |
| 2012-10-18 | 92.728 | 76.522 | 57.325 | 37.844 |
| 2012-10-19 | 92.728 | 76.522 | 56.93 | 37 |
| 2012-10-20 | 92.728 | 76.522 | 56.93 | 37 |
| 2012-10-21 | 91.238 | 74.473 | 56.93 | 37 |
| 2012-10-22 | 91.915 | 76.267 | 56.907 | 37.052 |
| 2012-10-23 | 90.638 | 75.459 | 55.926 | 36.559 |
| 2012-10-24 | 91.576 | 77.234 | 55.767 | 36.661 |
| 2012-10-25 | 92.266 | 78.055 | 56.095 | 36.714 |
| 2012-10-26 | 92.266 | 78.055 | 55.587 | 36.571 |
| 2012-10-27 | 92.266 | 78.055 | 55.587 | 36.571 |
| 2012-10-28 | 92.127 | 77.825 | 55.587 | 36.571 |
| 2012-10-29 | 91.393 | 76.301 | 55.587 | 36.475 |
| 2012-10-30 | 92.197 | 77.204 | 55.587 | 36.957 |
| 2012-10-31 | 92.503 | 76.968 | 55.982 | 36.74 |
| 2012-11-01 | 93.034 | 77.229 | 56.941 | 37.558 |
| 2012-11-02 | 93.034 | 77.229 | 56.535 | 37.691 |
| 2012-11-03 | 93.034 | 77.229 | 56.535 | 37.691 |
| 2012-11-04 | 92.798 | 76.879 | 56.535 | 37.691 |
| 2012-11-05 | 93.215 | 78.573 | 56.377 | 37.241 |
| 2012-11-06 | 93.727 | 79.205 | 57.223 | 37.694 |
| 2012-11-07 | 92.212 | 77.487 | 54.616 | 36.928 |
| 2012-11-08 | 92.12 | 76.686 | 54.278 | 36.883 |
| 2012-11-09 | 92.12 | 76.686 | 54.323 | 36.447 |
| 2012-11-10 | 92.12 | 76.686 | 54.323 | 36.447 |
| 2012-11-11 | 91.72 | 76.595 | 54.323 | 36.447 |
| 2012-11-12 | 91.211 | 75.323 | 54.413 | 36.461 |
| 2012-11-13 | 91.039 | 76.371 | 53.792 | 37.055 |
| 2012-11-14 | 90.587 | 74.616 | 52.686 | 36.633 |
| 2012-11-15 | 89.815 | 75.451 | 52.878 | 36.549 |
| 2012-11-16 | 89.815 | 75.451 | 53.217 | 35.851 |
| 2012-11-17 | 89.815 | 75.451 | 53.217 | 35.851 |
| 2012-11-18 | 90.787 | 76.934 | 53.217 | 35.851 |
| 2012-11-19 | 91.393 | 77.624 | 54.402 | 37.148 |
| 2012-11-20 | 91.24 | 77.099 | 54.797 | 36.976 |
| 2012-11-21 | 91.475 | 77.411 | 54.65 | 37.162 |
| 2012-11-22 | 91.779 | 77.984 | 54.65 | 37.436 |
| 2012-11-23 | 91.779 | 77.984 | 55.497 | 37.715 |
| 2012-11-24 | 91.779 | 77.984 | 55.497 | 37.715 |
| 2012-11-25 | 93.206 | 79.59 | 55.497 | 37.715 |
| 2012-11-26 | 93.368 | 79.358 | 55.26 | 37.262 |
| 2012-11-27 | 93.917 | 79.216 | 54.56 | 37.501 |
| 2012-11-28 | 93.371 | 77.948 | 54.74 | 37.353 |
| 2012-11-29 | 93.637 | 79.637 | 54.921 | 38.063 |
| 2012-11-30 | 93.637 | 79.637 | 54.808 | 38.066 |
| 2012-12-01 | 93.637 | 79.637 | 54.808 | 38.066 |
| 2012-12-02 | 93.662 | 80.215 | 54.808 | 38.066 |
| 2012-12-03 | 93.755 | 80.113 | 54.357 | 38.032 |
| 2012-12-04 | 93.076 | 79.34 | 53.995 | 38.28 |
| 2012-12-05 | 93.432 | 79.585 | 54.898 | 38.514 |
| 2012-12-06 | 93.261 | 79.661 | 55.068 | 38.755 |
| 2012-12-07 | 93.261 | 79.661 | 55.677 | 38.666 |
| 2012-12-08 | 93.261 | 79.661 | 55.677 | 38.666 |
| 2012-12-09 | 93.819 | 80.186 | 55.677 | 38.666 |
| 2012-12-10 | 93.655 | 80.952 | 55.643 | 38.321 |
| 2012-12-11 | 94.404 | 81.83 | 55.88 | 38.433 |
| 2012-12-12 | 94.277 | 83.134 | 56.106 | 38.607 |
| 2012-12-13 | 93.061 | 81.856 | 55.779 | 38.535 |
| 2012-12-14 | 93.061 | 81.856 | 55.598 | 38.504 |
| 2012-12-15 | 93.061 | 81.856 | 55.598 | 38.504 |
| 2012-12-16 | 92.053 | 81.714 | 55.598 | 38.504 |
| 2012-12-17 | 91.424 | 81.622 | 57.133 | 38.49 |
| 2012-12-18 | 91.834 | 82.821 | 58.239 | 38.862 |
| 2012-12-19 | 92.828 | 83.524 | 57.81 | 39.444 |
| 2012-12-20 | 92.537 | 83.992 | 58.578 | 39.484 |
| 2012-12-21 | 92.537 | 83.992 | 57.878 | 39.15 |
| 2012-12-22 | 92.537 | 83.992 | 57.878 | 39.15 |
| 2012-12-23 | 91.378 | 82.448 | 57.878 | 39.15 |
| 2012-12-24 | 90.433 | 80.539 | 57.641 | 39.076 |
| 2012-12-25 | 89.864 | 79.053 | 57.641 | 39.076 |
| 2012-12-26 | 90.234 | 79.867 | 57.731 | 39.076 |
| 2012-12-27 | 90.077 | 80.694 | 57.506 | 39.122 |
| 2012-12-28 | 90.077 | 80.694 | 57.099 | 38.75 |
| 2012-12-29 | 90.077 | 80.694 | 57.099 | 38.75 |
| 2012-12-30 | 90.293 | 80.627 | 57.099 | 38.75 |
| 2012-12-31 | 90.153 | 80.619 | 57.878 | 38.905 |
| 2013-01-01 | 92.497 | 83.628 | 57.878 | 38.905 |
| 2013-01-02 | 93.175 | 83.888 | 59.74 | 40.13 |
| 2013-01-03 | 92.317 | 83.273 | 59.639 | 40.333 |
| 2013-01-04 | 92.317 | 83.273 | 60.643 | 40.521 |
| 2013-01-05 | 92.317 | 83.273 | 60.643 | 40.521 |
| 2013-01-06 | 92.81 | 83.001 | 60.643 | 40.521 |
| 2013-01-07 | 92.23 | 81.513 | 60.44 | 40.953 |
| 2013-01-08 | 92.093 | 82.119 | 60.113 | 41.053 |
| 2013-01-09 | 92.481 | 82.407 | 59.695 | 42.006 |
| 2013-01-10 | 93.323 | 83.947 | 60.497 | 42.138 |
| 2013-01-11 | 93.323 | 83.947 | 60.023 | 42.247 |
| 2013-01-12 | 93.323 | 83.947 | 60.023 | 42.247 |
| 2013-01-13 | 92.741 | 83.715 | 60.023 | 42.247 |
| 2013-01-14 | 92.746 | 83.659 | 59.763 | 42.269 |
| 2013-01-15 | 92.055 | 82.486 | 60.169 | 42.045 |
| 2013-01-16 | 91.951 | 81.74 | 60.429 | 41.887 |
| 2013-01-17 | 92.026 | 81.208 | 60.519 | 42.14 |
| 2013-01-18 | 92.026 | 81.208 | 60.361 | 42.221 |
| 2013-01-19 | 92.026 | 81.208 | 60.361 | 42.221 |
| 2013-01-20 | 90.82 | 78.984 | 60.361 | 42.221 |
| 2013-01-21 | 91.145 | 79.595 | 60.361 | 42.354 |
| 2013-01-22 | 91.145 | 79.595 | 60.847 | 42.159 |
| 2013-01-23 | 91.967 | 81.176 | 60.643 | 41.82 |
| 2013-01-24 | 91.435 | 81.701 | 60.892 | 42.326 |
| 2013-01-25 | 91.435 | 81.701 | 61.084 | 42.476 |
| 2013-01-26 | 91.435 | 81.701 | 61.084 | 42.476 |
| 2013-01-27 | 91.26 | 80.395 | 61.084 | 42.476 |
| 2013-01-28 | 91.624 | 81.189 | 60.824 | 42.726 |
| 2013-01-29 | 90.911 | 80.072 | 60.858 | 42.605 |
| 2013-01-30 | 90.026 | 79.19 | 60.88 | 42.35 |
| 2013-01-31 | 89.951 | 79.323 | 60.756 | 42.228 |
| 2013-02-01 | 89.951 | 79.323 | 61.772 | 42.028 |
| 2013-02-02 | 89.951 | 79.323 | 61.772 | 42.028 |
| 2013-02-03 | 91.358 | 80.5 | 61.772 | 42.028 |
| 2013-02-04 | 91.408 | 81.702 | 61.016 | 40.8 |
| 2013-02-05 | 92.273 | 82.543 | 61.964 | 41.344 |
| 2013-02-06 | 92.352 | 82.329 | 62.122 | 41.084 |
| 2013-02-07 | 92.912 | 83.515 | 61.896 | 40.774 |
| 2013-02-08 | 92.912 | 83.515 | 62.077 | 41.899 |
| 2013-02-09 | 92.912 | 83.515 | 62.077 | 41.899 |
| 2013-02-10 | 93.08 | 82.655 | 62.077 | 41.899 |
| 2013-02-11 | 93.578 | 82.883 | 62.223 | 41.637 |
| 2013-02-12 | 94.231 | 83.844 | 62.878 | 42.476 |
| 2013-02-13 | 93.85 | 83.748 | 62.506 | 42.378 |
| 2013-02-14 | 93.433 | 83.288 | 62.607 | 42.219 |
| 2013-02-15 | 93.433 | 83.288 | 62.201 | 41.911 |
| 2013-02-16 | 93.433 | 83.288 | 62.201 | 41.911 |
| 2013-02-17 | 93.773 | 83.189 | 62.201 | 41.911 |
| 2013-02-18 | 93.401 | 83.004 | 62.201 | 41.859 |
| 2013-02-19 | 93.76 | 83.877 | 62.596 | 42.307 |
| 2013-02-20 | 94.919 | 85.406 | 61.558 | 42.035 |
| 2013-02-21 | 93.31 | 83.166 | 60.801 | 40.991 |
| 2013-02-22 | 93.31 | 83.166 | 61.512 | 41.539 |
| 2013-02-23 | 93.31 | 83.166 | 61.512 | 41.539 |
| 2013-02-24 | 93.31 | 83.166 | 61.512 | 41.539 |
| 2013-02-25 | 93.597 | 82.616 | 59.842 | 41.599 |
| 2013-02-26 | 93.344 | 82.755 | 60.135 | 40.33 |
| 2013-02-27 | 93.217 | 82.759 | 60.982 | 40.988 |
| 2013-02-28 | 93.728 | 83.552 | 60.926 | 41.329 |
| 2013-03-01 | 93.728 | 83.552 | 61.117 | 40.802 |
| 2013-03-02 | 93.728 | 83.552 | 61.117 | 40.802 |
| 2013-03-03 | 93.318 | 83.037 | 61.117 | 40.802 |
| 2013-03-04 | 93.445 | 82.728 | 61.84 | 40.426 |
| 2013-03-05 | 94.237 | 83.185 | 62.077 | 41.31 |
| 2013-03-06 | 94.42 | 83.613 | 62.743 | 40.855 |
| 2013-03-07 | 94.219 | 82.694 | 63.51 | 40.795 |
| 2013-03-08 | 94.219 | 82.694 | 63.871 | 41.837 |
| 2013-03-09 | 94.219 | 82.694 | 63.871 | 41.837 |
| 2013-03-10 | 94.778 | 84.087 | 63.871 | 41.837 |
| 2013-03-11 | 94.66 | 84.276 | 64.458 | 41.565 |
| 2013-03-12 | 94.83 | 83.883 | 63.984 | 41.391 |
| 2013-03-13 | 94.825 | 83.204 | 64.278 | 41.189 |
| 2013-03-14 | 94.883 | 82.496 | 64.639 | 41.909 |
| 2013-03-15 | 94.883 | 82.496 | 64.921 | 41.587 |
| 2013-03-16 | 94.883 | 82.496 | 64.921 | 41.587 |
| 2013-03-17 | 94.534 | 82.746 | 64.921 | 41.587 |
| 2013-03-18 | 95.03 | 84.05 | 64.312 | 40.974 |
| 2013-03-19 | 95.549 | 83.545 | 64.153 | 40.118 |
| 2013-03-20 | 95.611 | 82.92 | 64.47 | 40.435 |
| 2013-03-21 | 94.886 | 81.495 | 63.736 | 40.106 |
| 2013-03-22 | 94.886 | 81.495 | 63.905 | 39.799 |
| 2013-03-23 | 94.886 | 81.495 | 63.905 | 39.799 |
| 2013-03-24 | 95.548 | 82.789 | 63.905 | 39.799 |
| 2013-03-25 | 95.548 | 82.789 | 63.702 | 39.053 |
| 2013-03-26 | 95.548 | 82.789 | 63.916 | 38.952 |
| 2013-03-27 | 95.151 | 82.769 | 63.555 | 38.762 |
| 2013-03-28 | 94.534 | 82.065 | 63.521 | 38.91 |
| 2013-03-29 | 94.534 | 82.065 | 63.521 | 38.91 |
| 2013-03-30 | 94.534 | 82.065 | 63.521 | 38.91 |
| 2013-03-31 | 94.534 | 82.065 | 63.521 | 38.91 |
| 2013-04-01 | 94.534 | 82.065 | 63.014 | 38.91 |
| 2013-04-02 | 94.893 | 82.434 | 62.991 | 39.589 |
| 2013-04-03 | 94.839 | 81.793 | 61.716 | 38.855 |
| 2013-04-04 | 94.029 | 81.011 | 62.257 | 38.442 |
| 2013-04-05 | 94.029 | 81.011 | 62.235 | 38.063 |
| 2013-04-06 | 94.029 | 81.011 | 62.235 | 38.063 |
| 2013-04-07 | 93.727 | 80.872 | 62.235 | 38.063 |
| 2013-04-08 | 93.98 | 80.561 | 62.912 | 37.78 |
| 2013-04-09 | 94.08 | 80.462 | 63.318 | 38.283 |
| 2013-04-10 | 94.399 | 81.284 | 64.187 | 39.639 |
| 2013-04-11 | 94.223 | 81.855 | 64.153 | 39.925 |
| 2013-04-12 | 94.223 | 81.855 | 63.442 | 39.196 |
| 2013-04-13 | 94.223 | 81.855 | 63.442 | 39.196 |
| 2013-04-14 | 94.193 | 81.747 | 63.442 | 39.196 |
| 2013-04-15 | 94.193 | 81.747 | 61.964 | 38.917 |
| 2013-04-16 | 94.193 | 81.747 | 62.799 | 38.759 |
| 2013-04-17 | 93.323 | 79.978 | 61.535 | 38.058 |
| 2013-04-18 | 92.298 | 78.85 | 60.982 | 37.646 |
| 2013-04-19 | 92.298 | 78.85 | 61.907 | 38.254 |
| 2013-04-20 | 92.298 | 78.85 | 61.907 | 38.254 |
| 2013-04-21 | 92.133 | 78.449 | 61.907 | 38.254 |
| 2013-04-22 | 92.24 | 77.384 | 61.885 | 38.631 |
| 2013-04-23 | 92.782 | 78.507 | 62.98 | 39.889 |
| 2013-04-24 | 93.362 | 79.687 | 63.702 | 40.152 |
| 2013-04-25 | 92.713 | 79.804 | 64.029 | 40.369 |
| 2013-04-26 | 92.713 | 79.804 | 63.86 | 40.411 |
| 2013-04-27 | 92.713 | 79.804 | 63.86 | 40.411 |
| 2013-04-28 | 92.233 | 80.043 | 63.86 | 40.411 |
| 2013-04-29 | 92.287 | 79.889 | 64.086 | 40.829 |
| 2013-04-30 | 93.065 | 81.338 | 64.199 | 40.919 |
| 2013-05-01 | 92.915 | 81.217 | 63.307 | 41.005 |
| 2013-05-02 | 92.884 | 81.802 | 63.702 | 41.305 |
| 2013-05-03 | 92.884 | 81.802 | 64.266 | 41.737 |
| 2013-05-04 | 92.884 | 81.802 | 64.266 | 41.737 |
| 2013-05-05 | 92.829 | 81.715 | 64.266 | 41.737 |
| 2013-05-06 | 93.418 | 82.441 | 65.102 | 41.704 |
| 2013-05-07 | 93.534 | 83.362 | 65.779 | 42.524 |
| 2013-05-08 | 93.447 | 82.846 | 66.309 | 42.536 |
| 2013-05-09 | 92.482 | 81.867 | 65.835 | 42.445 |
| 2013-05-10 | 92.482 | 81.867 | 66.061 | 42.605 |
| 2013-05-11 | 92.482 | 81.867 | 66.061 | 42.605 |
| 2013-05-12 | 91.742 | 81.064 | 66.061 | 42.605 |
| 2013-05-13 | 92.555 | 82.114 | 66.354 | 42.107 |
| 2013-05-14 | 92.555 | 82.114 | 67.551 | 42.281 |
| 2013-05-15 | 92.555 | 82.114 | 68.296 | 43.008 |
| 2013-05-16 | 93.59 | 81.597 | 67.901 | 43.105 |
| 2013-05-17 | 93.59 | 81.597 | 68.995 | 43.735 |
| 2013-05-18 | 93.59 | 81.597 | 68.995 | 43.735 |
| 2013-05-19 | 94.303 | 82.037 | 68.995 | 43.735 |
| 2013-05-20 | 94.992 | 82.886 | 69.334 | 43.899 |
| 2013-05-21 | 95.286 | 82.745 | 69.447 | 43.38 |
| 2013-05-22 | 95.29 | 82.941 | 68.758 | 43.618 |
| 2013-05-23 | 93.795 | 81.621 | 68.488 | 42.245 |
| 2013-05-24 | 93.795 | 81.621 | 68.713 | 41.763 |
| 2013-05-25 | 93.795 | 81.621 | 68.713 | 41.763 |
| 2013-05-26 | 94.539 | 81.368 | 68.713 | 41.763 |
| 2013-05-27 | 94.662 | 81.826 | 68.713 | 42.054 |
| 2013-05-28 | 96.078 | 83.747 | 69.616 | 42.953 |
| 2013-05-29 | 95.314 | 83.322 | 69.752 | 42.278 |
| 2013-05-30 | 95.209 | 83.6 | 70.7 | 42.595 |
| 2013-05-31 | 95.209 | 83.6 | 69.526 | 42.409 |
| 2013-06-01 | 95.209 | 83.6 | 69.526 | 42.409 |
| 2013-06-02 | 94.71 | 83.022 | 69.526 | 42.409 |
| 2013-06-03 | 95.214 | 83.398 | 69.515 | 42.025 |
| 2013-06-04 | 95.434 | 84.613 | 68.849 | 42.424 |
| 2013-06-05 | 94.863 | 84.027 | 67.664 | 41.725 |
| 2013-06-06 | 94.656 | 84.401 | 68.442 | 40.781 |
| 2013-06-07 | 94.656 | 84.401 | 69.503 | 41.42 |
| 2013-06-08 | 94.656 | 84.401 | 69.503 | 41.42 |
| 2013-06-09 | 95.248 | 84.476 | 69.503 | 41.42 |
| 2013-06-10 | 95.552 | 84.639 | 69.898 | 41.036 |
| 2013-06-11 | 94.881 | 83.986 | 68.747 | 40.423 |
| 2013-06-12 | 94.71 | 83.315 | 68.025 | 39.999 |
| 2013-06-13 | 93.938 | 82.65 | 69.007 | 40.149 |
| 2013-06-14 | 93.938 | 82.65 | 67.901 | 40.135 |
| 2013-06-15 | 93.938 | 82.65 | 67.901 | 40.135 |
| 2013-06-16 | 94.305 | 82.952 | 67.901 | 40.135 |
| 2013-06-17 | 94.718 | 83.553 | 68.42 | 40.261 |
| 2013-06-18 | 94.769 | 83.626 | 68.973 | 40.481 |
| 2013-06-19 | 94.523 | 83.058 | 68.352 | 40.104 |
| 2013-06-20 | 93.465 | 81.997 | 67.698 | 38.643 |
| 2013-06-21 | 93.465 | 81.997 | 67.889 | 38.047 |
| 2013-06-22 | 93.465 | 81.997 | 67.889 | 38.047 |
| 2013-06-23 | 93.357 | 81.592 | 67.889 | 38.047 |
| 2013-06-24 | 92.083 | 80.279 | 66.806 | 37.479 |
| 2013-06-25 | 91.896 | 80.123 | 68.262 | 38.047 |
| 2013-06-26 | 92.013 | 80.237 | 68.905 | 38.881 |
| 2013-06-27 | 91.914 | 79.587 | 69.752 | 38.695 |
| 2013-06-28 | 91.914 | 79.587 | 69.312 | 38.275 |
| 2013-06-29 | 91.914 | 79.587 | 69.312 | 38.275 |
| 2013-06-30 | 92.077 | 79.447 | 69.312 | 38.275 |
| 2013-07-01 | 92.522 | 80.308 | 69.932 | 38.995 |
| 2013-07-02 | 92.839 | 79.985 | 70.316 | 38.736 |
| 2013-07-03 | 92.193 | 78.797 | 70.327 | 38.299 |
| 2013-07-04 | 92.426 | 79.27 | 70.327 | 39.763 |
| 2013-07-05 | 92.426 | 79.27 | 72.167 | 39.227 |
| 2013-07-06 | 92.426 | 79.27 | 72.167 | 39.227 |
| 2013-07-07 | 93.086 | 79.931 | 72.167 | 39.227 |
| 2013-07-08 | 93.5 | 80.283 | 72.562 | 39.911 |
| 2013-07-09 | 93.558 | 79.901 | 72.878 | 40.092 |
| 2013-07-10 | 93.589 | 79.691 | 72.156 | 39.956 |
| 2013-07-11 | 94.186 | 81.514 | 71.862 | 40.068 |
| 2013-07-12 | 94.186 | 81.514 | 72.788 | 39.999 |
| 2013-07-13 | 94.186 | 81.514 | 72.788 | 39.999 |
| 2013-07-14 | 94.682 | 81.372 | 72.788 | 39.999 |
| 2013-07-15 | 94.828 | 81.381 | 73.194 | 40.314 |
| 2013-07-16 | 94.828 | 81.381 | 72.607 | 39.911 |
| 2013-07-17 | 95.221 | 82.428 | 73.07 | 40.268 |
| 2013-07-18 | 95.493 | 82.456 | 74.334 | 41.16 |
| 2013-07-19 | 95.493 | 82.456 | 74.549 | 41.32 |
| 2013-07-20 | 95.493 | 82.456 | 74.549 | 41.32 |
| 2013-07-21 | 95.372 | 82.434 | 74.549 | 41.32 |
| 2013-07-22 | 95.573 | 82.341 | 75.282 | 41.634 |
| 2013-07-23 | 95.606 | 81.576 | 75.293 | 41.637 |
| 2013-07-24 | 95.97 | 81.446 | 74.921 | 42.149 |
| 2013-07-25 | 95.438 | 81.207 | 74.718 | 42.185 |
| 2013-07-26 | 95.438 | 81.207 | 74.47 | 42.247 |
| 2013-07-27 | 95.438 | 81.207 | 74.47 | 42.247 |
| 2013-07-28 | 95.462 | 80.96 | 74.47 | 42.247 |
| 2013-07-29 | 95.183 | 80.487 | 73.804 | 41.987 |
| 2013-07-30 | 93.942 | 80.505 | 73.86 | 41.885 |
| 2013-07-31 | 94.02 | 81.03 | 74.233 | 41.921 |
| 2013-08-01 | 94.43 | 81.699 | 75.666 | 42.865 |
| 2013-08-02 | 94.43 | 81.699 | 75.564 | 42.993 |
| 2013-08-03 | 94.43 | 81.699 | 75.564 | 42.993 |
| 2013-08-04 | 94.664 | 81.55 | 75.564 | 42.993 |
| 2013-08-05 | 94.544 | 81.506 | 75.293 | 42.724 |
| 2013-08-06 | 94.231 | 81.577 | 74.515 | 42.431 |
| 2013-08-07 | 94.224 | 81.13 | 73.815 | 42.617 |
| 2013-08-08 | 94.329 | 82.098 | 74.041 | 43.191 |
| 2013-08-09 | 94.329 | 82.098 | 73.736 | 43.647 |
| 2013-08-10 | 94.329 | 82.098 | 73.736 | 43.647 |
| 2013-08-11 | 94.36 | 81.771 | 73.736 | 43.647 |
| 2013-08-12 | 94.452 | 82.124 | 73.544 | 43.768 |
| 2013-08-13 | 95.002 | 81.463 | 73.77 | 43.947 |
| 2013-08-14 | 95.143 | 81.444 | 73.77 | 44.245 |
| 2013-08-15 | 94.467 | 80.498 | 72.856 | 43.821 |
| 2013-08-16 | 94.467 | 80.498 | 73.036 | 44.359 |
| 2013-08-17 | 94.467 | 80.498 | 73.036 | 44.359 |
| 2013-08-18 | 94.614 | 81.292 | 73.036 | 44.359 |
| 2013-08-19 | 94.704 | 80.799 | 72.054 | 43.546 |
| 2013-08-20 | 94.491 | 81.502 | 72.799 | 42.896 |
| 2013-08-21 | 94.291 | 81.454 | 72.314 | 42.364 |
| 2013-08-22 | 94.125 | 81.289 | 73.397 | 43.129 |
| 2013-08-23 | 94.125 | 81.289 | 73.262 | 43.361 |
| 2013-08-24 | 94.125 | 81.289 | 73.262 | 43.361 |
| 2013-08-25 | 94.101 | 80.567 | 73.262 | 43.361 |
| 2013-08-26 | 92.991 | 79.135 | 72.664 | 43.017 |
| 2013-08-27 | 91.112 | 76.877 | 70.395 | 41.682 |
| 2013-08-28 | 91.925 | 77.987 | 70.485 | 41.832 |
| 2013-08-29 | 92.956 | 80.01 | 70.643 | 42.209 |
| 2013-08-30 | 92.956 | 80.01 | 70.214 | 41.634 |
| 2013-08-31 | 92.956 | 80.01 | 70.214 | 41.634 |
| 2013-09-01 | 93.261 | 80.335 | 70.214 | 41.634 |
| 2013-09-02 | 93.741 | 80.957 | 70.214 | 42.564 |
| 2013-09-03 | 92.988 | 79.776 | 70.542 | 42.478 |
| 2013-09-04 | 92.988 | 79.776 | 71.038 | 42.59 |
| 2013-09-05 | 92.988 | 79.776 | 71.558 | 43.148 |
| 2013-09-06 | 92.988 | 79.776 | 71.287 | 43.375 |
| 2013-09-07 | 92.988 | 79.776 | 71.287 | 43.375 |
| 2013-09-08 | 91.833 | 78.104 | 71.287 | 43.375 |
| 2013-09-09 | 92.867 | 78.704 | 71.648 | 43.492 |
| 2013-09-10 | 94.177 | 80.344 | 72.415 | 44.297 |
| 2013-09-11 | 94.326 | 81.58 | 72.201 | 44.531 |
| 2013-09-12 | 94.068 | 82.388 | 71.749 | 44.462 |
| 2013-09-13 | 94.068 | 82.388 | 71.874 | 44.412 |
| 2013-09-14 | 94.068 | 82.388 | 71.874 | 44.412 |
| 2013-09-15 | 95.575 | 83.818 | 71.874 | 44.412 |
| 2013-09-16 | 95.909 | 83.925 | 72.449 | 44.676 |
| 2013-09-17 | 96.539 | 84.963 | 72.889 | 44.309 |
| 2013-09-18 | 96.539 | 84.963 | 73.002 | 44.746 |
| 2013-09-19 | 96.539 | 84.963 | 71.998 | 45.118 |
| 2013-09-20 | 96.539 | 84.963 | 71.772 | 44.748 |
| 2013-09-21 | 96.539 | 84.963 | 71.772 | 44.748 |
| 2013-09-22 | 97.076 | 85.914 | 71.772 | 44.748 |
| 2013-09-23 | 97.767 | 86.431 | 70.598 | 44.395 |
| 2013-09-24 | 97.608 | 85.615 | 70.305 | 44.526 |
| 2013-09-25 | 97.608 | 85.615 | 70.813 | 44.424 |
| 2013-09-26 | 97.608 | 85.615 | 70.576 | 44.212 |
| 2013-09-27 | 97.608 | 85.615 | 70.451 | 43.988 |
| 2013-09-28 | 97.608 | 85.615 | 70.451 | 43.988 |
| 2013-09-29 | 98.654 | 85.996 | 70.451 | 43.988 |
| 2013-09-30 | 98.183 | 86.038 | 70.26 | 43.577 |
| 2013-10-01 | 98.867 | 86.874 | 70.892 | 44.405 |
| 2013-10-02 | 98.701 | 86.809 | 70.542 | 44.491 |
| 2013-10-03 | 97.702 | 86.286 | 70.226 | 44.259 |
| 2013-10-04 | 97.702 | 86.286 | 71.084 | 44.691 |
| 2013-10-05 | 97.702 | 86.286 | 71.084 | 44.691 |
| 2013-10-06 | 99.09 | 86.993 | 71.084 | 44.691 |
| 2013-10-07 | 99.423 | 87.172 | 69.842 | 44.61 |
| 2013-10-08 | 99.645 | 87.328 | 69.074 | 44.193 |
| 2013-10-09 | 99.73 | 88.11 | 69.379 | 44.369 |
| 2013-10-10 | 100.318 | 87.88 | 71.445 | 45.466 |
| 2013-10-11 | 100.318 | 87.88 | 71.761 | 45.704 |
| 2013-10-12 | 100.318 | 87.88 | 71.761 | 45.704 |
| 2013-10-13 | 99.722 | 87.497 | 71.761 | 45.704 |
| 2013-10-14 | 100.363 | 88.254 | 72.156 | 45.776 |
| 2013-10-15 | 100.844 | 88.662 | 71.524 | 46.286 |
| 2013-10-16 | 101.121 | 89.104 | 73.025 | 46.572 |
| 2013-10-17 | 100.68 | 87.919 | 73.679 | 46.484 |
| 2013-10-18 | 100.68 | 87.919 | 73.95 | 46.677 |
| 2013-10-19 | 100.68 | 87.919 | 73.95 | 46.677 |
| 2013-10-20 | 101.342 | 88.836 | 73.95 | 46.677 |
| 2013-10-21 | 101.219 | 88.977 | 73.883 | 46.674 |
| 2013-10-22 | 101.616 | 89.629 | 73.533 | 46.846 |
| 2013-10-23 | 100.26 | 88.301 | 73.002 | 45.873 |
| 2013-10-24 | 100.125 | 88.179 | 72.98 | 46.305 |
| 2013-10-25 | 100.125 | 88.179 | 73.205 | 46.074 |
| 2013-10-26 | 100.125 | 88.179 | 73.205 | 46.074 |
| 2013-10-27 | 100.642 | 88.205 | 73.205 | 46.074 |
| 2013-10-28 | 100.04 | 87.836 | 73.341 | 45.694 |
| 2013-10-29 | 100.327 | 88.877 | 73.409 | 45.828 |
| 2013-10-30 | 99.569 | 89.668 | 73.284 | 45.621 |
| 2013-10-31 | 99.838 | 90.537 | 72.483 | 46.081 |
| 2013-11-01 | 99.838 | 90.537 | 72.619 | 45.88 |
| 2013-11-02 | 99.838 | 90.537 | 72.619 | 45.88 |
| 2013-11-03 | 100.442 | 90.677 | 72.619 | 45.88 |
| 2013-11-04 | 100.945 | 90.797 | 72.551 | 45.802 |
| 2013-11-05 | 100.78 | 89.899 | 72.528 | 45.323 |
| 2013-11-06 | 101.345 | 90.505 | 72.754 | 45.544 |
| 2013-11-07 | 101.955 | 90.442 | 71.941 | 45.575 |
| 2013-11-08 | 101.955 | 90.442 | 74.413 | 45.506 |
| 2013-11-09 | 101.955 | 90.442 | 74.413 | 45.506 |
| 2013-11-10 | 102.369 | 90.351 | 74.413 | 45.506 |
| 2013-11-11 | 102.249 | 90.604 | 74.289 | 45.771 |
| 2013-11-12 | 102.139 | 90.483 | 73.51 | 45.356 |
| 2013-11-13 | 101.876 | 90.173 | 74.165 | 44.812 |
| 2013-11-14 | 102.502 | 90.463 | 74.616 | 45.063 |
| 2013-11-15 | 102.502 | 90.463 | 74.819 | 45.048 |
| 2013-11-16 | 102.502 | 90.463 | 74.819 | 45.048 |
| 2013-11-17 | 103.361 | 91.052 | 74.819 | 45.048 |
| 2013-11-18 | 103.706 | 92.693 | 74.763 | 45.57 |
| 2013-11-19 | 103.583 | 92.434 | 74.865 | 45.032 |
| 2013-11-20 | 104.278 | 92.597 | 74.819 | 44.996 |
| 2013-11-21 | 104.232 | 92.231 | 75.948 | 45.132 |
| 2013-11-22 | 104.232 | 92.231 | 76.512 | 45.203 |
| 2013-11-23 | 104.232 | 92.231 | 76.512 | 45.203 |
| 2013-11-24 | 104.873 | 93.568 | 76.512 | 45.203 |
| 2013-11-25 | 104.623 | 93.706 | 76.795 | 45.463 |
| 2013-11-26 | 104.29 | 94.206 | 76.603 | 45.396 |
| 2013-11-27 | 104.497 | 94.116 | 76.806 | 45.807 |
| 2013-11-28 | 104.765 | 94.895 | 76.806 | 46.197 |
| 2013-11-29 | 104.765 | 94.895 | 76.501 | 46.231 |
| 2013-11-30 | 104.765 | 94.895 | 76.501 | 46.231 |
| 2013-12-01 | 106.102 | 95.885 | 76.501 | 46.231 |
| 2013-12-02 | 105.678 | 94.646 | 76.354 | 46.116 |
| 2013-12-03 | 105.056 | 94 | 75.485 | 45.284 |
| 2013-12-04 | 104.714 | 93.913 | 75.767 | 44.8 |
| 2013-12-05 | 104.947 | 94.341 | 75.023 | 44.104 |
| 2013-12-06 | 104.947 | 94.341 | 76.095 | 44.498 |
| 2013-12-07 | 104.947 | 94.341 | 76.095 | 44.498 |
| 2013-12-08 | 105.241 | 95.25 | 76.095 | 44.498 |
| 2013-12-09 | 104.857 | 95.484 | 76.298 | 44.65 |
| 2013-12-10 | 103.949 | 93.318 | 76.084 | 44.34 |
| 2013-12-11 | 103.347 | 92.816 | 75.034 | 43.985 |
| 2013-12-12 | 101.961 | 91.135 | 75.372 | 43.494 |
| 2013-12-13 | 101.961 | 91.135 | 75.192 | 43.418 |
| 2013-12-14 | 101.961 | 91.135 | 75.192 | 43.418 |
| 2013-12-15 | 101.45 | 90.172 | 75.192 | 43.418 |
| 2013-12-16 | 102.453 | 92.777 | 75.745 | 44.14 |
| 2013-12-17 | 102.196 | 91.96 | 75.147 | 43.577 |
| 2013-12-18 | 102.718 | 92.281 | 76.738 | 44.104 |
| 2013-12-19 | 102.734 | 92.034 | 76.795 | 44.829 |
| 2013-12-20 | 102.734 | 92.034 | 77.144 | 45.215 |
| 2013-12-21 | 102.734 | 92.034 | 77.144 | 45.215 |
| 2013-12-22 | 103.864 | 93.641 | 77.144 | 45.215 |
| 2013-12-23 | 104.543 | 94.749 | 77.833 | 45.678 |
| 2013-12-24 | 104.078 | 94.949 | 77.991 | 45.78 |
| 2013-12-25 | 104.084 | 94.985 | 77.991 | 45.78 |
| 2013-12-26 | 103.854 | 94.328 | 78.025 | 45.78 |
| 2013-12-27 | 103.854 | 94.328 | 77.968 | 46.207 |
| 2013-12-28 | 103.854 | 94.328 | 77.968 | 46.207 |
| 2013-12-29 | 102.671 | 92.338 | 77.968 | 46.207 |
| 2013-12-30 | 103.001 | 92.41 | 77.844 | 46.14 |
| 2013-12-31 | 103.785 | 93.782 | 78.172 | 46.3 |
| 2014-01-01 | 104.784 | 95.054 | 78.172 | 46.3 |
| 2014-01-02 | 103.608 | 92.485 | 77.822 | 45.902 |
| 2014-01-03 | 103.608 | 92.485 | 78.409 | 46.066 |
| 2014-01-04 | 103.608 | 92.485 | 78.409 | 46.066 |
| 2014-01-05 | 103.874 | 92.207 | 78.409 | 46.066 |
| 2014-01-06 | 103.773 | 91.891 | 78.679 | 46.422 |
| 2014-01-07 | 104.727 | 93.032 | 78.962 | 47.759 |
| 2014-01-08 | 104.827 | 91.985 | 79.571 | 48.365 |
| 2014-01-09 | 104.684 | 91.462 | 80.158 | 48.224 |
| 2014-01-10 | 104.684 | 91.462 | 79.876 | 48.248 |
| 2014-01-11 | 104.684 | 91.462 | 79.876 | 48.248 |
| 2014-01-12 | 105.418 | 91.579 | 79.876 | 48.248 |
| 2014-01-13 | 106.23 | 92.531 | 78.837 | 48.956 |
| 2014-01-14 | 105.728 | 91.901 | 79.244 | 49.006 |
| 2014-01-15 | 107.003 | 92.241 | 80.35 | 49.895 |
| 2014-01-16 | 106.922 | 91.65 | 79.628 | 49.251 |
| 2014-01-17 | 106.922 | 91.65 | 79.357 | 49.349 |
| 2014-01-18 | 106.922 | 91.65 | 79.357 | 49.349 |
| 2014-01-19 | 106.308 | 90.977 | 79.357 | 49.349 |
| 2014-01-20 | 105.057 | 90.097 | 79.357 | 48.832 |
| 2014-01-21 | 105.647 | 89.957 | 80.237 | 48.918 |
| 2014-01-22 | 105.509 | 89.408 | 80.587 | 48.756 |
| 2014-01-23 | 104.83 | 89.013 | 79.266 | 48.386 |
| 2014-01-24 | 104.83 | 89.013 | 77.246 | 47.077 |
| 2014-01-25 | 104.83 | 89.013 | 77.246 | 47.077 |
| 2014-01-26 | 103.048 | 87.646 | 77.246 | 47.077 |
| 2014-01-27 | 103.526 | 89.115 | 76.682 | 46.696 |
| 2014-01-28 | 103.936 | 88.508 | 77.359 | 47.218 |
| 2014-01-29 | 103.429 | 88.899 | 76.354 | 46.941 |
| 2014-01-30 | 103.095 | 88.512 | 77.156 | 47.146 |
| 2014-01-31 | 103.095 | 88.512 | 75.993 | 46.879 |
| 2014-02-01 | 103.095 | 88.512 | 75.993 | 46.879 |
| 2014-02-02 | 103.286 | 87.376 | 75.993 | 46.879 |
| 2014-02-03 | 102.875 | 87.014 | 73.928 | 45.678 |
| 2014-02-04 | 102.891 | 86.878 | 74.695 | 46.178 |
| 2014-02-05 | 103.078 | 86.901 | 74.616 | 46.476 |
| 2014-02-06 | 103.694 | 87.63 | 75.914 | 47.204 |
| 2014-02-07 | 103.694 | 87.63 | 76.49 | 47.401 |
| 2014-02-08 | 103.694 | 87.63 | 76.49 | 47.401 |
| 2014-02-09 | 103.923 | 88.816 | 76.49 | 47.401 |
| 2014-02-10 | 103.498 | 89.028 | 76.569 | 47.261 |
| 2014-02-11 | 103.903 | 89.344 | 77.291 | 47.916 |
| 2014-02-12 | 104.002 | 89.413 | 77.156 | 48.36 |
| 2014-02-13 | 103.902 | 89.224 | 77.336 | 48.121 |
| 2014-02-14 | 103.902 | 89.224 | 77.686 | 48.191 |
| 2014-02-15 | 103.902 | 89.224 | 77.686 | 48.191 |
| 2014-02-16 | 104.462 | 89.481 | 77.686 | 48.191 |
| 2014-02-17 | 104.823 | 89.641 | 77.686 | 48.493 |
| 2014-02-18 | 105.08 | 89.465 | 77.573 | 48.517 |
| 2014-02-19 | 105.225 | 88.537 | 76.038 | 48.384 |
| 2014-02-20 | 105.301 | 87.98 | 76.321 | 48.243 |
| 2014-02-21 | 105.301 | 87.98 | 76.591 | 48.276 |
| 2014-02-22 | 105.301 | 87.98 | 76.591 | 48.276 |
| 2014-02-23 | 105.367 | 87.111 | 76.591 | 48.276 |
| 2014-02-24 | 106.267 | 88.718 | 77.551 | 48.51 |
| 2014-02-25 | 106.671 | 88.239 | 77.065 | 48.481 |
| 2014-02-26 | 107.709 | 89.008 | 77.291 | 48.281 |
| 2014-02-27 | 107.982 | 89.889 | 77.573 | 48.441 |
| 2014-02-28 | 107.982 | 89.889 | 77.901 | 48.438 |
| 2014-03-01 | 107.982 | 89.889 | 77.901 | 48.438 |
| 2014-03-02 | 107.983 | 89.644 | 77.901 | 48.438 |
| 2014-03-03 | 107.699 | 89.357 | 77.065 | 47.063 |
| 2014-03-04 | 109.017 | 90.563 | 78.589 | 48.169 |
| 2014-03-05 | 109.138 | 90.724 | 79.165 | 48.462 |
| 2014-03-06 | 109.403 | 90.442 | 79.774 | 48.632 |
| 2014-03-07 | 109.403 | 90.442 | 80.519 | 47.95 |
| 2014-03-08 | 109.403 | 90.442 | 80.519 | 47.95 |
| 2014-03-09 | 108.823 | 90.549 | 80.519 | 47.95 |
| 2014-03-10 | 108.86 | 91.461 | 80.553 | 47.823 |
| 2014-03-11 | 109.368 | 91.583 | 79.684 | 47.764 |
| 2014-03-12 | 108.747 | 91.254 | 79.594 | 47.108 |
| 2014-03-13 | 108.925 | 91.503 | 78.916 | 46.71 |
| 2014-03-14 | 108.925 | 91.503 | 78.488 | 45.868 |
| 2014-03-15 | 108.925 | 91.503 | 78.488 | 45.868 |
| 2014-03-16 | 108.925 | 91.503 | 78.488 | 45.868 |
| 2014-03-17 | 109.267 | 91.203 | 79.47 | 46.474 |
| 2014-03-18 | 109.633 | 91.076 | 79.876 | 46.975 |
| 2014-03-19 | 110.184 | 92.513 | 80.497 | 46.972 |
| 2014-03-20 | 109.873 | 92.281 | 82.291 | 47.051 |
| 2014-03-21 | 109.873 | 92.281 | 82.054 | 46.882 |
| 2014-03-22 | 109.873 | 92.281 | 82.054 | 46.882 |
| 2014-03-23 | 110.29 | 93.502 | 82.054 | 46.882 |
| 2014-03-24 | 109.437 | 93.359 | 81.975 | 46.317 |
| 2014-03-25 | 110.361 | 94.203 | 82.009 | 46.693 |
| 2014-03-26 | 110.629 | 94.404 | 81.275 | 46.841 |
| 2014-03-27 | 110.128 | 93.79 | 80.214 | 46.808 |
| 2014-03-28 | 110.128 | 93.79 | 80.632 | 47.242 |
| 2014-03-29 | 110.128 | 93.79 | 80.632 | 47.242 |
| 2014-03-30 | 110.136 | 93.663 | 80.632 | 47.242 |
| 2014-03-31 | 110.242 | 93.414 | 81.591 | 47.661 |
| 2014-04-01 | 111.238 | 94.215 | 82.009 | 48.536 |
| 2014-04-02 | 111.656 | 93.674 | 82.02 | 48.524 |
| 2014-04-03 | 111.766 | 94.338 | 82.043 | 48.922 |
| 2014-04-04 | 111.766 | 94.338 | 80.914 | 49.268 |
| 2014-04-05 | 111.766 | 94.338 | 80.914 | 49.268 |
| 2014-04-06 | 111.663 | 95.092 | 80.914 | 49.268 |
| 2014-04-07 | 111.567 | 95.202 | 79.65 | 48.484 |
| 2014-04-08 | 110.101 | 93.78 | 79.673 | 48.157 |
| 2014-04-09 | 110.898 | 93.826 | 80.079 | 48.167 |
| 2014-04-10 | 110.617 | 93.555 | 77.72 | 47.697 |
| 2014-04-11 | 110.617 | 93.555 | 76.851 | 47.13 |
| 2014-04-12 | 110.617 | 93.555 | 76.851 | 47.13 |
| 2014-04-13 | 108.845 | 93.477 | 76.851 | 47.13 |
| 2014-04-14 | 108.845 | 93.477 | 77.415 | 47.12 |
| 2014-04-15 | 108.845 | 93.477 | 78.014 | 46.321 |
| 2014-04-16 | 109.166 | 93.526 | 78.205 | 47.13 |
| 2014-04-17 | 108.439 | 92.376 | 77.889 | 47.444 |
| 2014-04-18 | 108.439 | 92.376 | 77.889 | 47.444 |
| 2014-04-19 | 108.439 | 92.376 | 77.889 | 47.444 |
| 2014-04-20 | 108.439 | 92.376 | 77.889 | 47.444 |
| 2014-04-21 | 108.439 | 92.376 | 77.844 | 47.444 |
| 2014-04-22 | 110.102 | 92.967 | 78.454 | 48.057 |
| 2014-04-23 | 109.254 | 92.643 | 78.849 | 47.659 |
| 2014-04-24 | 108.837 | 92.465 | 78.296 | 47.924 |
| 2014-04-25 | 108.837 | 92.465 | 77.37 | 47.13 |
| 2014-04-26 | 108.837 | 92.465 | 77.37 | 47.13 |
| 2014-04-27 | 108.123 | 92.515 | 77.37 | 47.13 |
| 2014-04-28 | 108.395 | 92.951 | 76.433 | 47.08 |
| 2014-04-29 | 107.945 | 92.901 | 77.043 | 48.059 |
| 2014-04-30 | 107.517 | 91.864 | 77.235 | 47.726 |
| 2014-05-01 | 107.587 | 92.008 | 76.964 | 47.986 |
| 2014-05-02 | 107.587 | 92.008 | 77.37 | 47.85 |
| 2014-05-03 | 107.587 | 92.008 | 77.37 | 47.85 |
| 2014-05-04 | 107.084 | 91.881 | 77.37 | 47.85 |
| 2014-05-05 | 107.084 | 91.881 | 76.907 | 47.654 |
| 2014-05-06 | 107.084 | 91.881 | 75.767 | 47.289 |
| 2014-05-07 | 106.077 | 91.756 | 76.682 | 46.937 |
| 2014-05-08 | 106.398 | 92.184 | 76.795 | 47.909 |
| 2014-05-09 | 106.398 | 92.184 | 76.716 | 47.363 |
| 2014-05-10 | 106.398 | 92.184 | 76.716 | 47.363 |
| 2014-05-11 | 106.276 | 92.941 | 76.716 | 47.363 |
| 2014-05-12 | 106.785 | 92.867 | 77.856 | 47.604 |
| 2014-05-13 | 107.778 | 93.821 | 77.585 | 47.697 |
| 2014-05-14 | 107.706 | 93.619 | 76.377 | 47.566 |
| 2014-05-15 | 107.035 | 93.409 | 75.576 | 46.548 |
| 2014-05-16 | 107.035 | 93.409 | 75.406 | 46.972 |
| 2014-05-17 | 107.035 | 93.409 | 75.406 | 46.972 |
| 2014-05-18 | 107.303 | 93.947 | 75.406 | 46.972 |
| 2014-05-19 | 107.396 | 93.784 | 76.185 | 46.596 |
| 2014-05-20 | 107.477 | 93.606 | 75.7 | 46.839 |
| 2014-05-21 | 107.575 | 93.696 | 76.354 | 47.084 |
| 2014-05-22 | 107.522 | 93.429 | 76.67 | 47.068 |
| 2014-05-23 | 107.522 | 93.429 | 76.885 | 47.39 |
| 2014-05-24 | 107.522 | 93.429 | 76.885 | 47.39 |
| 2014-05-25 | 108.721 | 93.862 | 76.885 | 47.39 |
| 2014-05-26 | 108.967 | 94.189 | 76.885 | 47.902 |
| 2014-05-27 | 108.725 | 94.154 | 77.551 | 48.114 |
| 2014-05-28 | 108.409 | 93.569 | 77.472 | 48.443 |
| 2014-05-29 | 108.021 | 93.895 | 77.494 | 48.288 |
| 2014-05-30 | 108.021 | 93.895 | 77.777 | 48.26 |
| 2014-05-31 | 108.021 | 93.895 | 77.777 | 48.26 |
| 2014-06-01 | 108.28 | 94.184 | 77.777 | 48.26 |
| 2014-06-02 | 108.28 | 94.469 | 78.194 | 48.329 |
| 2014-06-03 | 108.28 | 94.469 | 78.465 | 48.016 |
| 2014-06-04 | 108.28 | 94.469 | 78.499 | 48.188 |
| 2014-06-05 | 108.266 | 94.616 | 79.3 | 48.474 |
| 2014-06-06 | 108.266 | 94.616 | 79.932 | 49.313 |
| 2014-06-07 | 108.266 | 94.616 | 79.932 | 49.313 |
| 2014-06-08 | 109.358 | 94.896 | 79.932 | 49.313 |
| 2014-06-09 | 109.196 | 93.851 | 81.095 | 49.621 |
| 2014-06-10 | 108.824 | 93.22 | 81.005 | 49.588 |
| 2014-06-11 | 108.405 | 92.466 | 80.271 | 49.054 |
| 2014-06-12 | 108.117 | 92.628 | 79.763 | 48.903 |
| 2014-06-13 | 108.117 | 92.628 | 79.808 | 48.841 |
| 2014-06-14 | 108.117 | 92.628 | 79.808 | 48.841 |
| 2014-06-15 | 107.622 | 92.045 | 79.808 | 48.841 |
| 2014-06-16 | 107.978 | 93.086 | 79.244 | 48.424 |
| 2014-06-17 | 108.183 | 93.108 | 80.237 | 48.617 |
| 2014-06-18 | 108.383 | 92.59 | 80.576 | 48.403 |
| 2014-06-19 | 108.832 | 93.554 | 80.293 | 48.427 |
| 2014-06-20 | 108.832 | 93.554 | 80.79 | 47.993 |
| 2014-06-21 | 108.832 | 93.554 | 80.79 | 47.993 |
| 2014-06-22 | 108.939 | 93.498 | 80.79 | 47.993 |
| 2014-06-23 | 108.785 | 92.828 | 80.993 | 47.697 |
| 2014-06-24 | 108.616 | 92.587 | 80.305 | 47.27 |
| 2014-06-25 | 107.583 | 91.32 | 80.53 | 46.741 |
| 2014-06-26 | 107.3 | 91.292 | 80.282 | 46.221 |
| 2014-06-27 | 107.3 | 91.292 | 80.474 | 46.162 |
| 2014-06-28 | 107.3 | 91.292 | 80.474 | 46.162 |
| 2014-06-29 | 107.469 | 91.105 | 80.474 | 46.162 |
| 2014-06-30 | 107.674 | 91.131 | 80.485 | 45.849 |
| 2014-07-01 | 107.495 | 91.045 | 80.982 | 46.691 |
| 2014-07-02 | 107.651 | 90.631 | 80.869 | 46.891 |
| 2014-07-03 | 108.295 | 91.772 | 81.693 | 47.38 |
| 2014-07-04 | 108.295 | 91.772 | 81.693 | 46.803 |
| 2014-07-05 | 108.295 | 91.772 | 81.693 | 46.803 |
| 2014-07-06 | 108.218 | 91.428 | 81.693 | 46.803 |
| 2014-07-07 | 106.955 | 90.296 | 81.163 | 46.31 |
| 2014-07-08 | 105.597 | 89.986 | 80.237 | 45.275 |
| 2014-07-09 | 106.407 | 91.013 | 80.542 | 45.511 |
| 2014-07-10 | 106.069 | 90.691 | 79.944 | 44.76 |
| 2014-07-11 | 106.069 | 90.691 | 80.102 | 44.87 |
| 2014-07-12 | 106.069 | 90.691 | 80.102 | 44.87 |
| 2014-07-13 | 107.458 | 91.749 | 80.102 | 44.87 |
| 2014-07-14 | 107.98 | 92.239 | 80.384 | 45.377 |
| 2014-07-15 | 108.168 | 91.582 | 81.467 | 45.125 |
| 2014-07-16 | 108.407 | 92.057 | 80.734 | 46.112 |
| 2014-07-17 | 108.406 | 92.456 | 79.007 | 45.356 |
| 2014-07-18 | 108.406 | 92.456 | 79.865 | 45.396 |
| 2014-07-19 | 108.406 | 92.456 | 79.865 | 45.396 |
| 2014-07-20 | 107.256 | 90.597 | 79.865 | 45.396 |
| 2014-07-21 | 107.673 | 91.489 | 79.582 | 45.072 |
| 2014-07-22 | 108.006 | 91.59 | 79.718 | 45.652 |
| 2014-07-23 | 107.892 | 91.322 | 79.977 | 45.852 |
| 2014-07-24 | 107.963 | 91.215 | 80.677 | 46.715 |
| 2014-07-25 | 107.963 | 91.215 | 80.813 | 46.844 |
| 2014-07-26 | 107.963 | 91.215 | 80.813 | 46.844 |
| 2014-07-27 | 107.638 | 90.999 | 80.813 | 46.844 |
| 2014-07-28 | 107.568 | 91.484 | 80.248 | 46.803 |
| 2014-07-29 | 107.661 | 91.351 | 79.887 | 46.994 |
| 2014-07-30 | 107.779 | 91.873 | 80.587 | 47.106 |
| 2014-07-31 | 107.085 | 91.947 | 79.165 | 46.188 |
| 2014-08-01 | 107.085 | 91.947 | 78.059 | 45.609 |
| 2014-08-02 | 107.085 | 91.947 | 78.059 | 45.609 |
| 2014-08-03 | 107.131 | 92.27 | 78.059 | 45.609 |
| 2014-08-04 | 107.224 | 93.429 | 78.307 | 45.745 |
| 2014-08-05 | 107.224 | 93.429 | 77.619 | 45.399 |
| 2014-08-06 | 106.425 | 93.378 | 77.765 | 44.769 |
| 2014-08-07 | 106.295 | 92.263 | 77.088 | 44.307 |
| 2014-08-08 | 106.295 | 92.263 | 77.686 | 44.319 |
| 2014-08-09 | 106.295 | 92.263 | 77.686 | 44.319 |
| 2014-08-10 | 105.939 | 92.103 | 77.686 | 44.319 |
| 2014-08-11 | 106.377 | 92.297 | 77.494 | 44.588 |
| 2014-08-12 | 106.184 | 92.592 | 77.551 | 44.724 |
| 2014-08-13 | 106.196 | 93.312 | 78.025 | 45.144 |
| 2014-08-14 | 106.514 | 93.858 | 78.273 | 45.187 |
| 2014-08-15 | 106.514 | 93.858 | 77.889 | 44.92 |
| 2014-08-16 | 106.514 | 93.858 | 77.889 | 44.92 |
| 2014-08-17 | 106.591 | 92.952 | 77.889 | 44.92 |
| 2014-08-18 | 106.231 | 91.414 | 78.826 | 45.411 |
| 2014-08-19 | 106.441 | 91.007 | 78.871 | 45.594 |
| 2014-08-20 | 106.211 | 91.09 | 79.142 | 45.499 |
| 2014-08-21 | 106.642 | 91.794 | 80.361 | 46.004 |
| 2014-08-22 | 106.642 | 91.794 | 80.237 | 46.069 |
| 2014-08-23 | 106.642 | 91.794 | 80.237 | 46.069 |
| 2014-08-24 | 106.045 | 91.174 | 80.237 | 46.069 |
| 2014-08-25 | 106.829 | 91.123 | 80.926 | 46.717 |
| 2014-08-26 | 107.425 | 91.972 | 81.163 | 47.251 |
| 2014-08-27 | 108.961 | 93.185 | 80.722 | 47.451 |
| 2014-08-28 | 108.665 | 93.659 | 80.293 | 46.848 |
| 2014-08-29 | 108.665 | 93.659 | 80.688 | 47.018 |
| 2014-08-30 | 108.665 | 93.659 | 80.688 | 47.018 |
| 2014-08-31 | 108.696 | 92.753 | 80.688 | 47.018 |
| 2014-09-01 | 109.485 | 93.469 | 80.688 | 46.875 |
| 2014-09-02 | 109.988 | 94.141 | 81.151 | 46.82 |
| 2014-09-03 | 110.418 | 93.522 | 80.926 | 47.456 |
| 2014-09-04 | 110.548 | 94.385 | 81.05 | 48.52 |
| 2014-09-05 | 110.548 | 94.385 | 81.05 | 48.374 |
| 2014-09-06 | 110.548 | 94.385 | 81.05 | 48.374 |
| 2014-09-07 | 111.069 | 95.078 | 81.05 | 48.374 |
| 2014-09-08 | 110.772 | 95.15 | 81.061 | 48.157 |
| 2014-09-09 | 110.464 | 95.299 | 80.237 | 47.74 |
| 2014-09-10 | 110.208 | 95.529 | 81.072 | 47.919 |
| 2014-09-11 | 110.391 | 94.981 | 81.479 | 47.795 |
| 2014-09-12 | 110.391 | 94.981 | 81.998 | 47.914 |
| 2014-09-13 | 110.391 | 94.981 | 81.998 | 47.914 |
| 2014-09-14 | 110.064 | 93.395 | 81.998 | 47.914 |
| 2014-09-15 | 109.944 | 94.149 | 81.93 | 47.649 |
| 2014-09-16 | 110.454 | 94.991 | 81.919 | 47.499 |
| 2014-09-17 | 111.241 | 95.333 | 82.449 | 47.993 |
| 2014-09-18 | 111.871 | 96.27 | 83.476 | 48.605 |
| 2014-09-19 | 111.871 | 96.27 | 83.172 | 48.684 |
| 2014-09-20 | 111.871 | 96.27 | 83.172 | 48.684 |
| 2014-09-21 | 112.323 | 96.316 | 83.172 | 48.684 |
| 2014-09-22 | 112.164 | 97.009 | 82.562 | 48.257 |
| 2014-09-23 | 112.149 | 97.562 | 81.828 | 47.642 |
| 2014-09-24 | 112.149 | 97.562 | 82.122 | 48.014 |
| 2014-09-25 | 112.149 | 97.562 | 80.824 | 47.697 |
| 2014-09-26 | 112.149 | 97.562 | 81.343 | 48.033 |
| 2014-09-27 | 112.149 | 97.562 | 81.343 | 48.033 |
| 2014-09-28 | 112.459 | 97.372 | 81.343 | 48.033 |
| 2014-09-29 | 112.31 | 97.57 | 80.971 | 47.304 |
| 2014-09-30 | 112.232 | 97.593 | 80.767 | 47.709 |
| 2014-10-01 | 111.569 | 97.142 | 79.819 | 47.645 |
| 2014-10-02 | 111.544 | 95.823 | 79.865 | 46.074 |
| 2014-10-03 | 111.544 | 95.823 | 81.016 | 46.872 |
| 2014-10-04 | 111.544 | 95.823 | 81.016 | 46.872 |
| 2014-10-05 | 113.09 | 96.801 | 81.016 | 46.872 |
| 2014-10-06 | 112.778 | 96.914 | 80.722 | 47.184 |
| 2014-10-07 | 112.669 | 96.793 | 79.255 | 46.405 |
| 2014-10-08 | 112.669 | 96.793 | 80.666 | 45.988 |
| 2014-10-09 | 112.669 | 96.793 | 78.691 | 45.52 |
| 2014-10-10 | 112.669 | 96.793 | 77.81 | 45.063 |
| 2014-10-11 | 112.669 | 96.793 | 77.81 | 45.063 |
| 2014-10-12 | 110.221 | 94.981 | 77.81 | 45.063 |
| 2014-10-13 | 110.879 | 95.742 | 77.223 | 45.242 |
| 2014-10-14 | 109.766 | 95.396 | 77.494 | 45.089 |
| 2014-10-15 | 109.766 | 95.396 | 74.91 | 43.182 |
| 2014-10-16 | 109.766 | 95.396 | 75.079 | 42.569 |
| 2014-10-17 | 109.766 | 95.396 | 75.406 | 44.119 |
| 2014-10-18 | 109.766 | 95.396 | 75.406 | 44.119 |
| 2014-10-19 | 109.933 | 95.909 | 75.406 | 44.119 |
| 2014-10-20 | 110.022 | 95.234 | 75.847 | 44.066 |
| 2014-10-21 | 110.604 | 94.929 | 77.449 | 45.32 |
| 2014-10-22 | 110.831 | 93.979 | 76.874 | 45.64 |
| 2014-10-23 | 111.125 | 93.504 | 77.63 | 46.019 |
| 2014-10-24 | 111.125 | 93.504 | 78.33 | 46.193 |
| 2014-10-25 | 111.125 | 93.504 | 78.33 | 46.193 |
| 2014-10-26 | 111.149 | 92.787 | 78.33 | 46.193 |
| 2014-10-27 | 110.952 | 92.935 | 78.42 | 45.389 |
| 2014-10-28 | 111.015 | 93.494 | 79.571 | 45.785 |
| 2014-10-29 | 110.417 | 92.532 | 80.158 | 45.118 |
| 2014-10-30 | 109.73 | 90.291 | 80.35 | 45.156 |
| 2014-10-31 | 109.73 | 90.291 | 81.422 | 46.367 |
| 2014-11-01 | 109.73 | 90.291 | 81.422 | 46.367 |
| 2014-11-02 | 110.978 | 91.001 | 81.422 | 46.367 |
| 2014-11-03 | 111.176 | 90.537 | 81.546 | 45.864 |
| 2014-11-04 | 111.23 | 90.982 | 81.479 | 45.141 |
| 2014-11-05 | 111.717 | 91.244 | 82.111 | 45.878 |
| 2014-11-06 | 111.409 | 91.223 | 82.641 | 45.637 |
| 2014-11-07 | 111.409 | 91.223 | 82.528 | 44.979 |
| 2014-11-08 | 111.409 | 91.223 | 82.528 | 44.979 |
| 2014-11-09 | 111.549 | 91.067 | 82.528 | 44.979 |
| 2014-11-10 | 111.54 | 90.887 | 82.844 | 45.17 |
| 2014-11-11 | 110.819 | 88.796 | 82.641 | 45.215 |
| 2014-11-12 | 110.578 | 89.127 | 82.596 | 44.259 |
| 2014-11-13 | 110.817 | 88.66 | 82.246 | 44.474 |
| 2014-11-14 | 110.817 | 88.66 | 82.065 | 44.653 |
| 2014-11-15 | 110.817 | 88.66 | 82.065 | 44.653 |
| 2014-11-16 | 110.819 | 89.413 | 82.065 | 44.653 |
| 2014-11-17 | 111.017 | 90.975 | 81.975 | 45.003 |
| 2014-11-18 | 111.277 | 90.832 | 82.077 | 45.256 |
| 2014-11-19 | 111.373 | 90.093 | 81.851 | 45.263 |
| 2014-11-20 | 111.083 | 90.208 | 81.953 | 44.631 |
| 2014-11-21 | 111.083 | 90.208 | 82.043 | 45.823 |
| 2014-11-22 | 111.083 | 90.208 | 82.043 | 45.823 |
| 2014-11-23 | 110.438 | 89.706 | 82.043 | 45.823 |
| 2014-11-24 | 110.322 | 89.378 | 82.788 | 46.195 |
| 2014-11-25 | 110.387 | 89.995 | 82.528 | 46.622 |
| 2014-11-26 | 112.063 | 91.368 | 82.652 | 46.498 |
| 2014-11-27 | 112.686 | 91.599 | 82.652 | 46.832 |
| 2014-11-28 | 112.686 | 91.599 | 82.032 | 46.929 |
| 2014-11-29 | 112.686 | 91.599 | 82.032 | 46.929 |
| 2014-11-30 | 112.314 | 90.976 | 82.032 | 46.929 |
| 2014-12-01 | 112.293 | 91.219 | 80.824 | 46.257 |
| 2014-12-02 | 112.328 | 90.451 | 81.828 | 46.758 |
| 2014-12-03 | 112.988 | 90.214 | 82.506 | 47.194 |
| 2014-12-04 | 113.391 | 90.423 | 82.619 | 46.164 |
| 2014-12-05 | 113.391 | 90.423 | 84.199 | 47.575 |
| 2014-12-06 | 113.391 | 90.423 | 84.199 | 47.575 |
| 2014-12-07 | 114.163 | 90.657 | 84.199 | 47.575 |
| 2014-12-08 | 113.944 | 91.099 | 84.142 | 47.335 |
| 2014-12-09 | 112.548 | 91.258 | 84.131 | 45.916 |
| 2014-12-10 | 112.917 | 91.656 | 82.37 | 45.666 |
| 2014-12-11 | 113.26 | 92.031 | 82.551 | 45.573 |
| 2014-12-12 | 113.26 | 92.031 | 81.016 | 44.302 |
| 2014-12-13 | 113.26 | 92.031 | 81.016 | 44.302 |
| 2014-12-14 | 112.575 | 92.764 | 81.016 | 44.302 |
| 2014-12-15 | 112.743 | 92.265 | 80.282 | 43.096 |
| 2014-12-16 | 111.21 | 90.418 | 79.582 | 43.787 |
| 2014-12-17 | 111.365 | 90.189 | 81.354 | 43.518 |
| 2014-12-18 | 112.668 | 89.206 | 83.442 | 44.758 |
| 2014-12-19 | 112.668 | 89.206 | 83.386 | 44.741 |
| 2014-12-20 | 112.668 | 89.206 | 83.386 | 44.741 |
| 2014-12-21 | 113.169 | 87.858 | 83.386 | 44.741 |
| 2014-12-22 | 112.697 | 87.927 | 83.691 | 44.977 |
| 2014-12-23 | 111.514 | 89.128 | 84.594 | 45.42 |
| 2014-12-24 | 111.049 | 87.695 | 84.458 | 45.406 |
| 2014-12-25 | 111.102 | 87.578 | 84.458 | 45.406 |
| 2014-12-26 | 111.102 | 87.578 | 84.481 | 45.406 |
| 2014-12-27 | 111.102 | 87.578 | 84.481 | 45.406 |
| 2014-12-28 | 110.782 | 85.997 | 84.481 | 45.406 |
| 2014-12-29 | 110.08 | 86.589 | 84.921 | 45.289 |
| 2014-12-30 | 109.619 | 87.038 | 84.786 | 44.87 |
| 2014-12-31 | 110.766 | 88.549 | 83.815 | 45.003 |
| 2015-01-01 | 110.687 | 88.174 | 83.815 | 45.003 |
| 2015-01-02 | 110.687 | 88.174 | 83.578 | 45.22 |
| 2015-01-03 | 110.687 | 88.174 | 83.578 | 45.22 |
| 2015-01-04 | 110.385 | 87.835 | 83.578 | 45.22 |
| 2015-01-05 | 109.979 | 87.202 | 81.117 | 43.749 |
| 2015-01-06 | 109.783 | 88.179 | 78.962 | 43.101 |
| 2015-01-07 | 110.071 | 88.382 | 79.639 | 43.024 |
| 2015-01-08 | 110.901 | 88.393 | 81.038 | 43.942 |
| 2015-01-09 | 110.901 | 88.393 | 79.21 | 42.536 |
| 2015-01-10 | 110.901 | 88.393 | 79.21 | 42.536 |
| 2015-01-11 | 110.578 | 88.227 | 79.21 | 42.536 |
| 2015-01-12 | 110.471 | 88.388 | 78.386 | 42.669 |
| 2015-01-13 | 111.446 | 88.934 | 77.844 | 43.434 |
| 2015-01-14 | 110.371 | 88.836 | 76.309 | 42.545 |
| 2015-01-15 | 110.171 | 88.223 | 74.944 | 43.382 |
| 2015-01-16 | 110.171 | 88.223 | 76.016 | 43.525 |
| 2015-01-17 | 110.171 | 88.223 | 76.016 | 43.525 |
| 2015-01-18 | 110.216 | 88.354 | 76.016 | 43.525 |
| 2015-01-19 | 109.445 | 88.842 | 76.016 | 43.868 |
| 2015-01-20 | 109.623 | 88.155 | 75.44 | 44.526 |
| 2015-01-21 | 109.584 | 87.839 | 75.88 | 44.839 |
| 2015-01-22 | 109.254 | 87.267 | 78.612 | 46.062 |
| 2015-01-23 | 109.254 | 87.267 | 77.494 | 46.133 |
| 2015-01-24 | 109.254 | 87.267 | 77.494 | 46.133 |
| 2015-01-25 | 109.625 | 86.267 | 77.494 | 46.133 |
| 2015-01-26 | 109.969 | 87.033 | 78.149 | 46.231 |
| 2015-01-27 | 109.92 | 86.673 | 77.144 | 45.568 |
| 2015-01-28 | 109.748 | 85.999 | 75.26 | 44.965 |
| 2015-01-29 | 109.114 | 86.596 | 76.411 | 45.108 |
| 2015-01-30 | 109.114 | 86.596 | 75.327 | 44.693 |
| 2015-01-31 | 109.114 | 86.596 | 75.327 | 44.693 |
| 2015-02-01 | 108.909 | 86.3 | 75.327 | 44.693 |
| 2015-02-02 | 109.043 | 85.287 | 76.953 | 44.848 |
| 2015-02-03 | 109.801 | 84.667 | 78.454 | 45.971 |
| 2015-02-04 | 109.961 | 85.523 | 78.025 | 46.05 |
| 2015-02-05 | 110.186 | 85.058 | 79.074 | 45.807 |
| 2015-02-06 | 110.186 | 85.058 | 80.508 | 46.314 |
| 2015-02-07 | 110.186 | 85.058 | 80.508 | 46.314 |
| 2015-02-08 | 110.592 | 84.466 | 80.508 | 46.314 |
| 2015-02-09 | 110.42 | 83.811 | 79.989 | 45.578 |
| 2015-02-10 | 110.845 | 84.487 | 80.53 | 45.754 |
| 2015-02-11 | 110.468 | 84.163 | 80.226 | 45.408 |
| 2015-02-12 | 110.138 | 83.586 | 81.817 | 46.264 |
| 2015-02-13 | 110.138 | 83.586 | 81.874 | 47.249 |
| 2015-02-14 | 110.138 | 83.586 | 81.874 | 47.249 |
| 2015-02-15 | 110.872 | 84.216 | 81.874 | 47.249 |
| 2015-02-16 | 111.77 | 86.663 | 81.874 | 47.385 |
| 2015-02-17 | 111.904 | 87.854 | 82.28 | 47.451 |
| 2015-02-18 | 112.371 | 89.06 | 81.129 | 48.376 |
| 2015-02-19 | 112.647 | 88.344 | 80.993 | 48.41 |
| 2015-02-20 | 112.647 | 88.344 | 81.749 | 48.596 |
| 2015-02-21 | 112.647 | 88.344 | 81.749 | 48.596 |
| 2015-02-22 | 113.441 | 88.949 | 81.749 | 48.596 |
| 2015-02-23 | 114.06 | 89.012 | 81.377 | 48.601 |
| 2015-02-24 | 114.026 | 88.193 | 82.19 | 48.956 |
| 2015-02-25 | 114.787 | 88.931 | 82.223 | 48.52 |
| 2015-02-26 | 115.48 | 89.517 | 81.975 | 49.12 |
| 2015-02-27 | 115.48 | 89.517 | 81.591 | 49.261 |
| 2015-02-28 | 115.48 | 89.517 | 81.591 | 49.261 |
| 2015-03-01 | 116.84 | 90.689 | 81.591 | 49.261 |
| 2015-03-02 | 116.893 | 90.894 | 82.415 | 49.375 |
| 2015-03-03 | 116.474 | 90.31 | 82.325 | 48.696 |
| 2015-03-04 | 116.603 | 89.69 | 81.874 | 49.287 |
| 2015-03-05 | 116.603 | 89.69 | 82.178 | 49.478 |
| 2015-03-06 | 116.603 | 89.69 | 82.438 | 49.697 |
| 2015-03-07 | 116.603 | 89.69 | 82.438 | 49.697 |
| 2015-03-08 | 116.991 | 89.426 | 82.438 | 49.697 |
| 2015-03-09 | 117.68 | 91.703 | 82.754 | 49.599 |
| 2015-03-10 | 117.297 | 90.054 | 80.722 | 49.273 |
| 2015-03-11 | 118.156 | 90.732 | 81.456 | 49.936 |
| 2015-03-12 | 118.296 | 89.357 | 83.521 | 49.797 |
| 2015-03-13 | 118.296 | 89.357 | 82.901 | 49.852 |
| 2015-03-14 | 118.296 | 89.357 | 82.901 | 49.852 |
| 2015-03-15 | 117.341 | 87.858 | 82.901 | 49.852 |
| 2015-03-16 | 118.176 | 88.843 | 83.442 | 50.267 |
| 2015-03-17 | 118.176 | 88.843 | 83.623 | 49.89 |
| 2015-03-18 | 119.452 | 88.402 | 83.397 | 49.838 |
| 2015-03-19 | 120.883 | 89.683 | 82.393 | 50.207 |
| 2015-03-20 | 120.883 | 89.683 | 83.42 | 51.03 |
| 2015-03-21 | 120.883 | 89.683 | 83.42 | 51.03 |
| 2015-03-22 | 122.174 | 91.086 | 83.42 | 51.03 |
| 2015-03-23 | 121.638 | 91.974 | 82.81 | 51.013 |
| 2015-03-24 | 120.948 | 92.523 | 82.054 | 51.521 |
| 2015-03-25 | 121.277 | 92.835 | 80.7 | 51.061 |
| 2015-03-26 | 120.085 | 91.884 | 80.926 | 50.718 |
| 2015-03-27 | 120.085 | 91.884 | 80.576 | 50.651 |
| 2015-03-28 | 120.085 | 91.884 | 80.576 | 50.651 |
| 2015-03-29 | 121.258 | 92.875 | 80.576 | 50.651 |
| 2015-03-30 | 121.531 | 93.732 | 81.761 | 51.392 |
| 2015-03-31 | 121.796 | 94.375 | 81.445 | 51.085 |
| 2015-04-01 | 122.126 | 95.624 | 81.208 | 51.559 |
| 2015-04-02 | 122.76 | 96.054 | 81.828 | 51.573 |
| 2015-04-03 | 122.76 | 96.054 | 81.828 | 51.573 |
| 2015-04-04 | 122.76 | 96.054 | 81.828 | 51.573 |
| 2015-04-05 | 123.103 | 95.933 | 81.828 | 51.573 |
| 2015-04-06 | 123.512 | 96.186 | 81.546 | 51.573 |
| 2015-04-07 | 124.938 | 96.345 | 81.738 | 52.15 |
| 2015-04-08 | 124.054 | 95.503 | 81.896 | 52.048 |
| 2015-04-09 | 124.054 | 95.503 | 82.235 | 52.475 |
| 2015-04-10 | 124.054 | 95.503 | 82.144 | 52.503 |
| 2015-04-11 | 124.054 | 95.503 | 82.144 | 52.503 |
| 2015-04-12 | 126.825 | 95.18 | 82.144 | 52.503 |
| 2015-04-13 | 127.495 | 95.196 | 82.698 | 52.918 |
| 2015-04-14 | 126.663 | 94.132 | 82.438 | 52.296 |
| 2015-04-15 | 127.226 | 93.853 | 83.07 | 52.758 |
| 2015-04-16 | 127.104 | 94.788 | 83.183 | 52.017 |
| 2015-04-17 | 127.104 | 94.788 | 82.043 | 50.815 |
| 2015-04-18 | 127.104 | 94.788 | 82.043 | 50.815 |
| 2015-04-19 | 125.236 | 94.807 | 82.043 | 50.815 |
| 2015-04-20 | 126.027 | 96.795 | 82.359 | 51.509 |
| 2015-04-21 | 126.438 | 96.354 | 82.111 | 51.449 |
| 2015-04-22 | 126.438 | 96.354 | 82.935 | 51.728 |
| 2015-04-23 | 126.438 | 96.354 | 82.72 | 51.845 |
| 2015-04-24 | 126.438 | 96.354 | 82.144 | 52.444 |
| 2015-04-25 | 126.438 | 96.354 | 82.144 | 52.444 |
| 2015-04-26 | 126.529 | 97.072 | 82.144 | 52.444 |
| 2015-04-27 | 126.133 | 97.199 | 81.93 | 53.137 |
| 2015-04-28 | 123.959 | 97.428 | 82.709 | 52.606 |
| 2015-04-29 | 123.156 | 95.916 | 83.476 | 51.659 |
| 2015-04-30 | 122.902 | 96.048 | 83.172 | 51.395 |
| 2015-05-01 | 122.902 | 96.048 | 83.476 | 51.335 |
| 2015-05-02 | 122.902 | 96.048 | 83.476 | 51.335 |
| 2015-05-03 | 122.348 | 94.122 | 83.476 | 51.335 |
| 2015-05-04 | 123.166 | 94.059 | 84.628 | 51.516 |
| 2015-05-05 | 122.387 | 94.679 | 84.21 | 50.513 |
| 2015-05-06 | 121.701 | 94.129 | 83.871 | 50.52 |
| 2015-05-07 | 122.014 | 95.634 | 83.747 | 50.935 |
| 2015-05-08 | 122.014 | 95.634 | 84.752 | 52.224 |
| 2015-05-09 | 122.014 | 95.634 | 84.752 | 52.224 |
| 2015-05-10 | 123.444 | 95.91 | 84.752 | 52.224 |
| 2015-05-11 | 123.444 | 95.574 | 84.853 | 52.427 |
| 2015-05-12 | 122.431 | 95.418 | 84.91 | 51.836 |
| 2015-05-13 | 123.658 | 96.384 | 85.361 | 51.96 |
| 2015-05-14 | 123.403 | 95.948 | 85.688 | 52.291 |
| 2015-05-15 | 123.403 | 95.948 | 84.797 | 52.088 |
| 2015-05-16 | 123.403 | 95.948 | 84.797 | 52.088 |
| 2015-05-17 | 123.684 | 95.915 | 84.797 | 52.088 |
| 2015-05-18 | 125.323 | 97.295 | 85.711 | 51.941 |
| 2015-05-19 | 127.089 | 98.832 | 86.806 | 52.663 |
| 2015-05-20 | 126.885 | 98.983 | 86.14 | 53.216 |
| 2015-05-21 | 127.448 | 100.12 | 86.061 | 53.104 |
| 2015-05-22 | 127.448 | 100.12 | 85.937 | 53.199 |
| 2015-05-23 | 127.448 | 100.12 | 85.937 | 53.199 |
| 2015-05-24 | 127.448 | 100.12 | 85.937 | 53.199 |
| 2015-05-25 | 127.063 | 99.473 | 85.937 | 52.787 |
| 2015-05-26 | 125.905 | 97.779 | 85.327 | 52.312 |
| 2015-05-27 | 125.576 | 98.789 | 86.174 | 53.204 |
| 2015-05-28 | 124.896 | 98.341 | 86.038 | 52.873 |
| 2015-05-29 | 124.896 | 98.341 | 85.226 | 52.153 |
| 2015-05-30 | 124.896 | 98.341 | 85.226 | 52.153 |
| 2015-05-31 | 125.42 | 98.632 | 85.226 | 52.153 |
| 2015-06-01 | 126.132 | 99.183 | 84.91 | 52.091 |
| 2015-06-02 | 125.908 | 98.873 | 85.666 | 52.107 |
| 2015-06-03 | 126.587 | 99.257 | 86.795 | 52.367 |
| 2015-06-04 | 126.163 | 99.183 | 86.061 | 52.019 |
| 2015-06-05 | 126.163 | 99.183 | 87.573 | 51.473 |
| 2015-06-06 | 126.163 | 99.183 | 87.573 | 51.473 |
| 2015-06-07 | 126.328 | 100.279 | 87.573 | 51.473 |
| 2015-06-08 | 126.401 | 101.185 | 87.246 | 50.949 |
| 2015-06-09 | 125.064 | 101.088 | 88.014 | 50.83 |
| 2015-06-10 | 124.459 | 101.295 | 88.014 | 50.83 |
| 2015-06-11 | 125.185 | 103.643 | 88.014 | 50.83 |
| 2015-06-12 | 125.185 | 103.643 | 88.014 | 50.83 |
| 2015-06-13 | 125.185 | 103.643 | 88.014 | 50.83 |
| 2015-06-14 | 124.875 | 103.035 | 88.014 | 50.83 |
| 2015-06-15 | 123.768 | 102.443 | 88.014 | 50.83 |
| 2015-06-16 | 124.843 | 103.234 | 88.014 | 50.83 |
| 2015-06-17 | 125.226 | 102.899 | 88.014 | 50.83 |
| 2015-06-18 | 125.012 | 102.701 | 88.014 | 50.83 |
| 2015-06-19 | 125.012 | 102.701 | 88.014 | 50.83 |
| 2015-06-20 | 125.012 | 102.701 | 88.014 | 50.83 |
| 2015-06-21 | 126.311 | 103.707 | 88.014 | 50.83 |
| 2015-06-22 | 125.625 | 105.071 | 88.014 | 50.83 |
| 2015-06-23 | 124.824 | 104.78 | 88.014 | 50.83 |
| 2015-06-24 | 124.194 | 105.661 | 88.014 | 50.83 |
| 2015-06-25 | 124.019 | 104.277 | 88.014 | 50.83 |
| 2015-06-26 | 124.019 | 104.277 | 88.014 | 50.83 |
| 2015-06-27 | 124.019 | 104.277 | 88.014 | 50.83 |
| 2015-06-28 | 121.613 | 100.952 | 88.014 | 50.83 |
| 2015-06-29 | 121.396 | 100.603 | 88.014 | 50.83 |
| 2015-06-30 | 121.885 | 101.876 | 88.014 | 50.83 |
| 2015-07-01 | 123.749 | 102.701 | 88.014 | 50.83 |
| 2015-07-02 | 123.008 | 102.536 | 88.014 | 50.83 |
| 2015-07-03 | 123.008 | 102.536 | 88.014 | 50.83 |
| 2015-07-04 | 123.008 | 102.536 | 88.014 | 50.83 |
| 2015-07-05 | 122.43 | 101.423 | 88.014 | 50.83 |
| 2015-07-06 | 122.523 | 102.07 | 88.014 | 50.83 |
| 2015-07-07 | 122.474 | 101.961 | 88.014 | 50.83 |
| 2015-07-08 | 121.387 | 101.28 | 88.014 | 50.83 |
| 2015-07-09 | 122.514 | 102.346 | 88.014 | 50.83 |
| 2015-07-10 | 122.514 | 102.346 | 88.014 | 50.83 |
| 2015-07-11 | 122.514 | 102.346 | 88.014 | 50.83 |
| 2015-07-12 | 122.784 | 102.708 | 88.014 | 50.83 |
| 2015-07-13 | 124.173 | 105.208 | 87.641 | 52.475 |
| 2015-07-14 | 124.313 | 104.436 | 88.081 | 52.625 |
| 2015-07-15 | 124.589 | 104.144 | 89.12 | 52.994 |
| 2015-07-16 | 125.524 | 104.769 | 89.989 | 53.755 |
| 2015-07-17 | 125.524 | 104.769 | 89.391 | 53.702 |
| 2015-07-18 | 125.524 | 104.769 | 89.391 | 53.702 |
| 2015-07-19 | 126.475 | 105.218 | 89.391 | 53.702 |
| 2015-07-20 | 127.125 | 106.625 | 89.752 | 53.986 |
| 2015-07-21 | 126.822 | 107.245 | 89.74 | 53.528 |
| 2015-07-22 | 125.997 | 104.602 | 90.756 | 53.426 |
| 2015-07-23 | 126.04 | 104.672 | 90.011 | 53.295 |
| 2015-07-24 | 126.04 | 104.672 | 88.499 | 52.83 |
| 2015-07-25 | 126.04 | 104.672 | 88.499 | 52.83 |
| 2015-07-26 | 126.04 | 104.672 | 88.499 | 52.83 |
| 2015-07-27 | 126.105 | 104.17 | 87.562 | 51.64 |
| 2015-07-28 | 126.915 | 105.608 | 87.946 | 52.384 |
| 2015-07-29 | 127.47 | 105.978 | 88.668 | 52.556 |
| 2015-07-30 | 127.067 | 105.087 | 89.007 | 52.827 |
| 2015-07-31 | 127.067 | 105.087 | 88.397 | 52.777 |
| 2015-08-01 | 127.067 | 105.087 | 88.397 | 52.777 |
| 2015-08-02 | 127.137 | 105.693 | 88.397 | 52.777 |
| 2015-08-03 | 127.422 | 107.181 | 88.239 | 53.037 |
| 2015-08-04 | 127.05 | 106.39 | 88.476 | 52.382 |
| 2015-08-05 | 127.96 | 106.931 | 88.939 | 53.116 |
| 2015-08-06 | 127.448 | 106.906 | 88.567 | 52.796 |
| 2015-08-07 | 127.448 | 106.906 | 88.284 | 52.215 |
| 2015-08-08 | 127.448 | 106.906 | 88.284 | 52.215 |
| 2015-08-09 | 127.181 | 107.035 | 88.284 | 52.215 |
| 2015-08-10 | 128.291 | 107.644 | 89.763 | 52.549 |
| 2015-08-11 | 127.811 | 107.427 | 88.386 | 51.95 |
| 2015-08-12 | 127.023 | 106.792 | 86.986 | 50.343 |
| 2015-08-13 | 127.918 | 106.514 | 87.449 | 50.789 |
| 2015-08-14 | 127.918 | 106.514 | 88.307 | 50.558 |
| 2015-08-15 | 127.918 | 106.514 | 88.307 | 50.558 |
| 2015-08-16 | 128.68 | 107.845 | 88.307 | 50.558 |
| 2015-08-17 | 128.797 | 107.33 | 88.375 | 50.796 |
| 2015-08-18 | 129.208 | 107.129 | 88.465 | 50.992 |
| 2015-08-19 | 128.327 | 105.391 | 87.517 | 50.141 |
| 2015-08-20 | 126.928 | 103.881 | 85.011 | 48.951 |
| 2015-08-21 | 126.928 | 103.881 | 82.381 | 47.227 |
| 2015-08-22 | 126.928 | 103.881 | 82.381 | 47.227 |
| 2015-08-23 | 121.72 | 98.873 | 82.381 | 47.227 |
| 2015-08-24 | 116.925 | 96.708 | 77.901 | 44.438 |
| 2015-08-25 | 120.341 | 99.66 | 76.558 | 46.736 |
| 2015-08-26 | 119.502 | 97.868 | 79.977 | 45.971 |
| 2015-08-27 | 120.169 | 97.706 | 82.257 | 47.652 |
| 2015-08-28 | 120.169 | 97.706 | 82.122 | 47.585 |
| 2015-08-29 | 120.169 | 97.706 | 82.122 | 47.585 |
| 2015-08-30 | 120.975 | 97.997 | 82.122 | 47.585 |
| 2015-08-31 | 119.162 | 96.786 | 81.896 | 47.409 |
| 2015-09-01 | 117.812 | 96.605 | 78.386 | 45.938 |
| 2015-09-02 | 119.649 | 98.964 | 79.707 | 46.069 |
| 2015-09-03 | 120.4 | 99.337 | 80.418 | 47.072 |
| 2015-09-04 | 120.4 | 99.337 | 79.007 | 45.604 |
| 2015-09-05 | 120.4 | 99.337 | 79.007 | 45.604 |
| 2015-09-06 | 120.172 | 100.801 | 79.007 | 45.604 |
| 2015-09-07 | 119.81 | 100.378 | 79.007 | 45.702 |
| 2015-09-08 | 120.625 | 101.468 | 81.196 | 46.472 |
| 2015-09-09 | 120.195 | 101.458 | 80.181 | 47.239 |
| 2015-09-10 | 119.893 | 101.687 | 80.7 | 46.5 |
| 2015-09-11 | 119.893 | 101.687 | 80.598 | 46.128 |
| 2015-09-12 | 119.893 | 101.687 | 80.598 | 46.128 |
| 2015-09-13 | 119.893 | 101.687 | 80.598 | 46.128 |
| 2015-09-14 | 119.893 | 101.687 | 80.677 | 45.566 |
| 2015-09-15 | 119.893 | 101.687 | 81.953 | 46.093 |
| 2015-09-16 | 119.746 | 102.415 | 82.257 | 46.407 |
| 2015-09-17 | 119.626 | 100.175 | 80.361 | 46.434 |
| 2015-09-18 | 119.626 | 100.175 | 78.42 | 45.089 |
| 2015-09-19 | 119.626 | 100.175 | 78.42 | 45.089 |
| 2015-09-20 | 117.974 | 98.281 | 78.42 | 45.089 |
| 2015-09-21 | 118.657 | 98.639 | 79.379 | 45.575 |
| 2015-09-22 | 118.657 | 98.639 | 78.352 | 44.255 |
| 2015-09-23 | 118.657 | 98.639 | 78.431 | 43.859 |
| 2015-09-24 | 114.547 | 97.173 | 77.991 | 43.027 |
| 2015-09-25 | 114.547 | 97.173 | 79.549 | 44.355 |
| 2015-09-26 | 114.547 | 97.173 | 79.549 | 44.355 |
| 2015-09-27 | 114.547 | 97.173 | 79.549 | 44.355 |
| 2015-09-28 | 114.547 | 97.173 | 77.449 | 43.063 |
| 2015-09-29 | 111.943 | 96.974 | 77.698 | 42.974 |
| 2015-09-30 | 111.752 | 97.232 | 78.804 | 43.959 |
| 2015-10-01 | 111.769 | 96.845 | 78.826 | 43.985 |
| 2015-10-02 | 111.769 | 96.845 | 78.33 | 44.252 |
| 2015-10-03 | 111.769 | 96.845 | 78.33 | 44.252 |
| 2015-10-04 | 111.769 | 96.845 | 78.33 | 44.252 |
| 2015-10-05 | 111.769 | 96.845 | 80.034 | 45.69 |
| 2015-10-06 | 113.609 | 99.157 | 79.774 | 46 |
| 2015-10-07 | 114.909 | 101.5 | 80.395 | 46.414 |
| 2015-10-08 | 113.901 | 100.366 | 80.722 | 46.157 |
| 2015-10-09 | 113.901 | 100.366 | 79.966 | 46.481 |
| 2015-10-10 | 113.901 | 100.366 | 79.966 | 46.481 |
| 2015-10-11 | 113.862 | 99.357 | 79.966 | 46.481 |
| 2015-10-12 | 113.797 | 99.792 | 80.056 | 46.176 |
| 2015-10-13 | 112.69 | 97.365 | 79.515 | 45.413 |
| 2015-10-14 | 113.132 | 98.432 | 78.228 | 45.07 |
| 2015-10-15 | 114.413 | 98.87 | 80.339 | 45.625 |
| 2015-10-16 | 114.413 | 98.87 | 80.169 | 46.259 |
| 2015-10-17 | 114.413 | 98.87 | 80.169 | 46.259 |
| 2015-10-18 | 115.826 | 99.103 | 80.169 | 46.259 |
| 2015-10-19 | 115.444 | 97.358 | 79.831 | 46.407 |
| 2015-10-20 | 115.706 | 97.138 | 80.643 | 46.066 |
| 2015-10-21 | 116.043 | 98.869 | 79.537 | 45.735 |
| 2015-10-22 | 115.461 | 99.418 | 80.903 | 46.35 |
| 2015-10-23 | 115.461 | 99.418 | 82.652 | 47.034 |
| 2015-10-24 | 115.461 | 99.418 | 82.652 | 47.034 |
| 2015-10-25 | 117.386 | 100.677 | 82.652 | 47.034 |
| 2015-10-26 | 117.101 | 100.921 | 82.111 | 46.863 |
| 2015-10-27 | 116.584 | 100.23 | 81.625 | 46.445 |
| 2015-10-28 | 116.872 | 99.26 | 84.492 | 46.67 |
| 2015-10-29 | 117.353 | 98.024 | 83.499 | 45.878 |
| 2015-10-30 | 117.353 | 98.024 | 81.919 | 45.733 |
| 2015-10-31 | 117.353 | 98.024 | 81.919 | 45.733 |
| 2015-11-01 | 117.144 | 99.243 | 81.919 | 45.733 |
| 2015-11-02 | 117.365 | 98.923 | 83.205 | 46.059 |
| 2015-11-03 | 117.762 | 99.617 | 83.397 | 45.816 |
| 2015-11-04 | 117.858 | 99.265 | 83.284 | 46.116 |
| 2015-11-05 | 117.483 | 99.394 | 84.097 | 45.547 |
| 2015-11-06 | 117.483 | 99.394 | 86.4 | 46.593 |
| 2015-11-07 | 117.483 | 99.394 | 86.4 | 46.593 |
| 2015-11-08 | 116.734 | 98.517 | 86.4 | 46.593 |
| 2015-11-09 | 116.399 | 98.291 | 85.564 | 46.186 |
| 2015-11-10 | 116.417 | 98.775 | 85.756 | 46.069 |
| 2015-11-11 | 117.186 | 98.422 | 85.44 | 46.276 |
| 2015-11-12 | 116.288 | 96.824 | 83.973 | 45.399 |
| 2015-11-13 | 116.288 | 96.824 | 83.172 | 45.091 |
| 2015-11-14 | 116.288 | 96.824 | 83.172 | 45.091 |
| 2015-11-15 | 113.19 | 95.496 | 83.172 | 45.091 |
| 2015-11-16 | 115.193 | 96.204 | 84.176 | 44.898 |
| 2015-11-17 | 116.093 | 96.916 | 84.029 | 45.857 |
| 2015-11-18 | 116.805 | 98.347 | 85.779 | 45.816 |
| 2015-11-19 | 116.916 | 98.011 | 85.801 | 46.138 |
| 2015-11-20 | 116.916 | 98.011 | 85.677 | 45.687 |
| 2015-11-21 | 116.916 | 98.011 | 85.677 | 45.687 |
| 2015-11-22 | 117.01 | 98.513 | 85.677 | 45.687 |
| 2015-11-23 | 116.637 | 97.984 | 85.339 | 45.699 |
| 2015-11-24 | 115.482 | 97.982 | 85.361 | 45.234 |
| 2015-11-25 | 115.751 | 96.94 | 85.372 | 45.549 |
| 2015-11-26 | 115.756 | 95.884 | 85.372 | 46.016 |
| 2015-11-27 | 115.756 | 95.884 | 85.666 | 45.892 |
| 2015-11-28 | 115.756 | 95.884 | 85.666 | 45.892 |
| 2015-11-29 | 115.634 | 96.657 | 85.666 | 45.892 |
| 2015-11-30 | 115.457 | 96.053 | 85.497 | 46.047 |
| 2015-12-01 | 116.459 | 96.455 | 86.4 | 46.341 |
| 2015-12-02 | 116.837 | 96.047 | 85.44 | 46.093 |
| 2015-12-03 | 115.811 | 95.637 | 84.21 | 44.831 |
| 2015-12-04 | 115.811 | 95.637 | 86.648 | 44.722 |
| 2015-12-05 | 115.811 | 95.637 | 86.648 | 44.722 |
| 2015-12-06 | 115.882 | 96.489 | 86.648 | 44.722 |
| 2015-12-07 | 115.169 | 95.53 | 85.508 | 44.541 |
| 2015-12-08 | 114.218 | 94.932 | 83.928 | 43.403 |
| 2015-12-09 | 114.159 | 96.324 | 82.856 | 43.239 |
| 2015-12-10 | 113.477 | 95.391 | 83.307 | 43.079 |
| 2015-12-11 | 113.477 | 95.391 | 81.275 | 42.049 |
| 2015-12-12 | 113.477 | 95.391 | 81.275 | 42.049 |
| 2015-12-13 | 110.863 | 93.108 | 81.275 | 42.049 |
| 2015-12-14 | 110.277 | 92.619 | 81.321 | 41.229 |
| 2015-12-15 | 111.827 | 93.812 | 83.86 | 42.765 |
| 2015-12-16 | 111.372 | 93.044 | 85.293 | 42.927 |
| 2015-12-17 | 112.674 | 94.502 | 83.623 | 43.771 |
| 2015-12-18 | 112.674 | 94.502 | 81.219 | 43.492 |
| 2015-12-19 | 112.674 | 94.502 | 81.219 | 43.492 |
| 2015-12-20 | 111.142 | 92.83 | 81.219 | 43.492 |
| 2015-12-21 | 111.417 | 93.212 | 81.941 | 42.795 |
| 2015-12-22 | 110.642 | 91.89 | 82.46 | 42.915 |
| 2015-12-23 | 111.211 | 92.029 | 83.691 | 43.997 |
| 2015-12-24 | 112.386 | 92.959 | 83.668 | 43.988 |
| 2015-12-25 | 112.386 | 92.959 | 83.668 | 43.988 |
| 2015-12-26 | 112.386 | 92.959 | 83.668 | 43.988 |
| 2015-12-27 | 113.595 | 94.199 | 83.668 | 43.988 |
| 2015-12-28 | 113.037 | 93.92 | 83.273 | 43.694 |
| 2015-12-29 | 113.518 | 94.815 | 84.12 | 44.121 |
| 2015-12-30 | 113.068 | 93.978 | 83.194 | 43.763 |
| 2015-12-31 | 113.013 | 94.973 | 82.483 | 43.539 |
| 2016-01-01 | 113.013 | 94.973 | 82.483 | 43.539 |
| 2016-01-02 | 113.013 | 94.973 | 82.483 | 43.539 |
| 2016-01-03 | 114.152 | 96.146 | 82.483 | 43.539 |
| 2016-01-04 | 112.925 | 95.339 | 80.485 | 42.424 |
| 2016-01-05 | 113.465 | 95.807 | 80.44 | 42.619 |
| 2016-01-06 | 112.725 | 94.519 | 79.041 | 41.773 |
| 2016-01-07 | 110.376 | 93.205 | 76.433 | 40.76 |
| 2016-01-08 | 110.376 | 93.205 | 74.944 | 39.856 |
| 2016-01-09 | 110.376 | 93.205 | 74.944 | 39.856 |
| 2016-01-10 | 109.801 | 92.997 | 74.944 | 39.856 |
| 2016-01-11 | 110.251 | 93.39 | 75.09 | 39.875 |
| 2016-01-12 | 110.961 | 93.868 | 75.722 | 40.161 |
| 2016-01-13 | 110.546 | 93.429 | 73.126 | 40.223 |
| 2016-01-14 | 107.262 | 91.809 | 73.95 | 39.477 |
| 2016-01-15 | 107.262 | 91.809 | 71.828 | 37.923 |
| 2016-01-16 | 107.262 | 91.809 | 71.828 | 37.923 |
| 2016-01-17 | 106.963 | 90.339 | 71.828 | 37.923 |
| 2016-01-18 | 107.483 | 90.461 | 71.828 | 37.193 |
| 2016-01-19 | 108.167 | 90.071 | 71.377 | 37.408 |
| 2016-01-20 | 105.729 | 89.099 | 70.102 | 35.806 |
| 2016-01-21 | 106.442 | 88.727 | 69.142 | 36.604 |
| 2016-01-22 | 106.442 | 88.727 | 70.271 | 37.739 |
| 2016-01-23 | 106.442 | 88.727 | 70.271 | 37.739 |
| 2016-01-24 | 108.17 | 89.135 | 70.271 | 37.739 |
| 2016-01-25 | 107.464 | 88.719 | 67.833 | 36.635 |
| 2016-01-26 | 107.524 | 88.277 | 69.312 | 37.291 |
| 2016-01-27 | 107.323 | 87.467 | 69.718 | 37.048 |
| 2016-01-28 | 107.367 | 88.928 | 70.181 | 36.199 |
| 2016-01-29 | 107.367 | 88.928 | 72.077 | 37.203 |
| 2016-01-30 | 107.367 | 88.928 | 72.077 | 37.203 |
| 2016-01-31 | 109.106 | 88.974 | 72.077 | 37.203 |
| 2016-02-01 | 108.494 | 89.204 | 71.388 | 36.692 |
| 2016-02-02 | 107.679 | 88.042 | 69.074 | 35.212 |
| 2016-02-03 | 106.92 | 88.35 | 69.21 | 34.029 |
| 2016-02-04 | 107.148 | 88.425 | 70.169 | 34.931 |
| 2016-02-05 | 107.148 | 88.425 | 69.278 | 34.892 |
| 2016-02-06 | 107.148 | 88.425 | 69.278 | 34.892 |
| 2016-02-07 | 105.881 | 87.612 | 69.278 | 34.892 |
| 2016-02-08 | 104.462 | 86.018 | 67.099 | 32.942 |
| 2016-02-09 | 104.086 | 86.661 | 67.257 | 31.636 |
| 2016-02-10 | 104.452 | 87.737 | 66.569 | 33.183 |
| 2016-02-11 | 101.477 | 86.251 | 63.781 | 31.107 |
| 2016-02-12 | 101.477 | 86.251 | 67.201 | 32.849 |
| 2016-02-13 | 101.477 | 86.251 | 67.201 | 32.849 |
| 2016-02-14 | 102.932 | 86.88 | 67.201 | 32.849 |
| 2016-02-15 | 103.844 | 86.848 | 67.201 | 33.987 |
| 2016-02-16 | 103.908 | 86.772 | 69.086 | 33.796 |
| 2016-02-17 | 105.661 | 89.481 | 69.537 | 34.921 |
| 2016-02-18 | 105.124 | 87.752 | 68.42 | 34.118 |
| 2016-02-19 | 105.124 | 87.752 | 68.679 | 33.636 |
| 2016-02-20 | 105.124 | 87.752 | 68.679 | 33.636 |
| 2016-02-21 | 105.257 | 88.357 | 68.679 | 33.636 |
| 2016-02-22 | 106.22 | 89.785 | 70.147 | 34.535 |
| 2016-02-23 | 105.991 | 90.359 | 68.115 | 33.839 |
| 2016-02-24 | 105.259 | 89.717 | 67.54 | 32.826 |
| 2016-02-25 | 105.71 | 90.108 | 68.465 | 33.989 |
| 2016-02-26 | 105.71 | 90.108 | 69.605 | 35.038 |
| 2016-02-27 | 105.71 | 90.108 | 69.605 | 35.038 |
| 2016-02-28 | 106.756 | 90.393 | 69.605 | 35.038 |
| 2016-02-29 | 106.601 | 89.972 | 68.002 | 35.319 |
| 2016-03-01 | 106.876 | 91.164 | 71.117 | 35.67 |
| 2016-03-02 | 107.293 | 90.215 | 72.427 | 36.883 |
| 2016-03-03 | 107.287 | 90.567 | 73.307 | 36.826 |
| 2016-03-04 | 107.287 | 90.567 | 73.916 | 37.043 |
| 2016-03-05 | 107.287 | 90.567 | 73.916 | 37.043 |
| 2016-03-06 | 108.048 | 90.597 | 73.916 | 37.043 |
| 2016-03-07 | 107.781 | 90.826 | 73.646 | 36.652 |
| 2016-03-08 | 107.919 | 90.454 | 71.783 | 36.406 |
| 2016-03-09 | 108.247 | 90.068 | 71.501 | 36.471 |
| 2016-03-10 | 109.124 | 90.682 | 71.738 | 36.282 |
| 2016-03-11 | 109.124 | 90.682 | 73.792 | 38.056 |
| 2016-03-12 | 109.124 | 90.682 | 73.792 | 38.056 |
| 2016-03-13 | 109.881 | 90.686 | 73.792 | 38.056 |
| 2016-03-14 | 109.811 | 91.294 | 73.51 | 38.087 |
| 2016-03-15 | 109.208 | 91.937 | 73.341 | 37.367 |
| 2016-03-16 | 109.786 | 91.687 | 72.641 | 36.888 |
| 2016-03-17 | 109.255 | 92.845 | 73.025 | 36.449 |
| 2016-03-18 | 109.255 | 92.845 | 74.323 | 36.704 |
| 2016-03-19 | 109.255 | 92.845 | 74.323 | 36.704 |
| 2016-03-20 | 109.749 | 92.938 | 74.323 | 36.704 |
| 2016-03-21 | 109.821 | 93.986 | 74.515 | 36.547 |
| 2016-03-22 | 109.988 | 93.455 | 74.289 | 36.278 |
| 2016-03-23 | 109.8 | 92.127 | 73.623 | 35.698 |
| 2016-03-24 | 109.8 | 92.127 | 73.138 | 34.921 |
| 2016-03-25 | 109.8 | 92.127 | 73.138 | 34.921 |
| 2016-03-26 | 109.8 | 92.127 | 73.138 | 34.921 |
| 2016-03-27 | 108.949 | 92.062 | 73.138 | 34.921 |
| 2016-03-28 | 108.796 | 92.563 | 72.968 | 34.921 |
| 2016-03-29 | 108.023 | 93.184 | 72.415 | 34.733 |
| 2016-03-30 | 108.276 | 92.881 | 72.968 | 34.907 |
| 2016-03-31 | 107.437 | 92.38 | 72.494 | 34.42 |
| 2016-04-01 | 107.437 | 92.38 | 73.025 | 33.987 |
| 2016-04-02 | 107.437 | 92.38 | 73.025 | 33.987 |
| 2016-04-03 | 107.458 | 91.646 | 73.025 | 33.987 |
| 2016-04-04 | 107.923 | 90.724 | 72.856 | 33.886 |
| 2016-04-05 | 107.117 | 89.841 | 71.445 | 32.73 |
| 2016-04-06 | 107.431 | 89.711 | 72.088 | 32.826 |
| 2016-04-07 | 107.463 | 89.355 | 70.034 | 32.096 |
| 2016-04-08 | 107.463 | 89.355 | 70.361 | 32.795 |
| 2016-04-09 | 107.463 | 89.355 | 70.361 | 32.795 |
| 2016-04-10 | 106.853 | 89.247 | 70.361 | 32.795 |
| 2016-04-11 | 107.881 | 91.091 | 70.892 | 33.174 |
| 2016-04-12 | 107.576 | 92.214 | 72.144 | 33.271 |
| 2016-04-13 | 108.986 | 93.133 | 74.921 | 35.353 |
| 2016-04-14 | 109.415 | 92.635 | 75.677 | 35.57 |
| 2016-04-15 | 109.415 | 92.635 | 75.282 | 35.448 |
| 2016-04-16 | 109.415 | 92.635 | 75.282 | 35.448 |
| 2016-04-17 | 110.444 | 93.774 | 75.282 | 35.448 |
| 2016-04-18 | 110.672 | 94.456 | 75.824 | 35.627 |
| 2016-04-19 | 111.361 | 95.565 | 77.201 | 35.851 |
| 2016-04-20 | 111.14 | 94.685 | 78.567 | 36.64 |
| 2016-04-21 | 111.096 | 94.421 | 78.284 | 37.141 |
| 2016-04-22 | 111.096 | 94.421 | 79.187 | 37.246 |
| 2016-04-23 | 111.096 | 94.421 | 79.187 | 37.246 |
| 2016-04-24 | 111.259 | 94.72 | 79.187 | 37.246 |
| 2016-04-25 | 110.453 | 94.071 | 78.713 | 36.573 |
| 2016-04-26 | 108.658 | 94.64 | 79.515 | 37.482 |
| 2016-04-27 | 107.08 | 92.243 | 79.628 | 37.336 |
| 2016-04-28 | 107.08 | 92.243 | 78.634 | 37.434 |
| 2016-04-29 | 107.08 | 92.243 | 77.98 | 36.247 |
| 2016-04-30 | 107.08 | 92.243 | 77.98 | 36.247 |
| 2016-05-01 | 105.236 | 91.232 | 77.98 | 36.247 |
| 2016-05-02 | 106.039 | 93.152 | 78.668 | 35.972 |
| 2016-05-03 | 105.439 | 92.121 | 77.077 | 34.647 |
| 2016-05-04 | 104.831 | 90.884 | 75.53 | 34.134 |
| 2016-05-05 | 105.05 | 91.729 | 75.293 | 33.967 |
| 2016-05-06 | 105.05 | 91.729 | 75.519 | 33.882 |
| 2016-05-07 | 105.05 | 91.729 | 75.519 | 33.882 |
| 2016-05-08 | 104.486 | 92.996 | 75.519 | 33.882 |
| 2016-05-09 | 104.855 | 92.649 | 75.102 | 33.689 |
| 2016-05-10 | 105.551 | 93.159 | 76.512 | 34.299 |
| 2016-05-11 | 105.551 | 93.159 | 76.061 | 33.967 |
| 2016-05-12 | 105.551 | 93.159 | 75.7 | 33.624 |
| 2016-05-13 | 105.551 | 93.159 | 74.492 | 33.903 |
| 2016-05-14 | 105.551 | 93.159 | 74.492 | 33.903 |
| 2016-05-15 | 104.042 | 92.584 | 74.492 | 33.903 |
| 2016-05-16 | 104.094 | 92.012 | 75.147 | 33.855 |
| 2016-05-17 | 104.143 | 92.457 | 75.034 | 33.936 |
| 2016-05-18 | 104.959 | 92.884 | 77.923 | 34.599 |
| 2016-05-19 | 104.192 | 91.665 | 77.28 | 34.528 |
| 2016-05-20 | 104.192 | 91.665 | 77.652 | 34.962 |
| 2016-05-21 | 104.192 | 91.665 | 77.652 | 34.962 |
| 2016-05-22 | 104.876 | 91.342 | 77.652 | 34.962 |
| 2016-05-23 | 105.387 | 91.419 | 77.46 | 34.73 |
| 2016-05-24 | 106.394 | 92.074 | 78.691 | 35.937 |
| 2016-05-25 | 107.403 | 92.991 | 80.181 | 37.119 |
| 2016-05-26 | 106.636 | 93.04 | 79.447 | 36.943 |
| 2016-05-27 | 106.636 | 93.04 | 80.169 | 36.948 |
| 2016-05-28 | 106.636 | 93.04 | 80.169 | 36.948 |
| 2016-05-29 | 106.927 | 92.992 | 80.169 | 36.948 |
| 2016-05-30 | 107.819 | 94.849 | 80.169 | 37.012 |
| 2016-05-31 | 107.814 | 95.389 | 79.989 | 36.43 |
| 2016-06-01 | 107.622 | 94.044 | 80.282 | 35.82 |
| 2016-06-02 | 108.021 | 93.59 | 80.587 | 35.775 |
| 2016-06-03 | 108.021 | 93.59 | 78.77 | 34.997 |
| 2016-06-04 | 108.021 | 93.59 | 78.77 | 34.997 |
| 2016-06-05 | 107.964 | 93.528 | 78.77 | 34.997 |
| 2016-06-06 | 108.073 | 93.938 | 79.786 | 34.983 |
| 2016-06-07 | 108.173 | 93.191 | 79.187 | 35.438 |
| 2016-06-08 | 107.576 | 92.952 | 79.255 | 35.028 |
| 2016-06-09 | 107.109 | 92.103 | 78.228 | 34.58 |
| 2016-06-10 | 107.109 | 92.103 | 76.998 | 33.314 |
| 2016-06-11 | 107.109 | 92.103 | 76.998 | 33.314 |
| 2016-06-12 | 107.109 | 92.103 | 76.998 | 33.314 |
| 2016-06-13 | 105.7 | 90.961 | 76.185 | 32.337 |
| 2016-06-14 | 105.393 | 91.467 | 74.379 | 31.581 |
| 2016-06-15 | 106.134 | 91.689 | 74.526 | 31.974 |
| 2016-06-16 | 105.016 | 94.682 | 74.187 | 31.56 |
| 2016-06-17 | 105.016 | 94.682 | 74.537 | 32.857 |
| 2016-06-18 | 105.016 | 94.682 | 74.537 | 32.857 |
| 2016-06-19 | 105.35 | 95.204 | 74.537 | 32.857 |
| 2016-06-20 | 106.408 | 96.89 | 74.989 | 34.337 |
| 2016-06-21 | 106.253 | 96.17 | 75.293 | 34.742 |
| 2016-06-22 | 106.608 | 96.491 | 75.124 | 35.031 |
| 2016-06-23 | 106.58 | 96.514 | 77.336 | 35.975 |
| 2016-06-24 | 106.58 | 96.514 | 71.682 | 30.773 |
| 2016-06-25 | 106.58 | 96.514 | 71.682 | 30.773 |
| 2016-06-26 | 103.331 | 92.651 | 71.682 | 30.773 |
| 2016-06-27 | 102.803 | 92.594 | 68.025 | 28.413 |
| 2016-06-28 | 103.494 | 93.954 | 70.124 | 29.13 |
| 2016-06-29 | 104.145 | 93.198 | 71.885 | 29.862 |
| 2016-06-30 | 104.087 | 93.105 | 73.205 | 29.915 |
| 2016-07-01 | 104.087 | 93.105 | 72.46 | 30.039 |
| 2016-07-02 | 104.087 | 93.105 | 72.46 | 30.039 |
| 2016-07-03 | 105.236 | 93.475 | 72.46 | 30.039 |
| 2016-07-04 | 105.532 | 92.922 | 72.46 | 29.564 |
| 2016-07-05 | 104.938 | 91.312 | 70.361 | 28.758 |
| 2016-07-06 | 104.489 | 90.19 | 70.847 | 28.017 |
| 2016-07-07 | 105.57 | 90.423 | 71.411 | 28.37 |
| 2016-07-08 | 105.57 | 90.423 | 72.743 | 29.44 |
| 2016-07-09 | 105.57 | 90.423 | 72.743 | 29.44 |
| 2016-07-10 | 107.016 | 91.84 | 72.743 | 29.44 |
| 2016-07-11 | 107.319 | 92.582 | 73.341 | 30.041 |
| 2016-07-12 | 108.109 | 93.516 | 74.74 | 31.042 |
| 2016-07-13 | 108.513 | 93.312 | 74.628 | 30.694 |
| 2016-07-14 | 109.187 | 94.679 | 75.914 | 31.455 |
| 2016-07-15 | 109.187 | 94.679 | 75.869 | 31.426 |
| 2016-07-16 | 109.187 | 94.679 | 75.869 | 31.426 |
| 2016-07-17 | 109.086 | 94.309 | 75.869 | 31.426 |
| 2016-07-18 | 109.01 | 94.65 | 76.151 | 31.5 |
| 2016-07-19 | 109.174 | 95.426 | 76.106 | 31.369 |
| 2016-07-20 | 109.926 | 96.44 | 76.129 | 31.881 |
| 2016-07-21 | 109.855 | 96.191 | 75.745 | 32.022 |
| 2016-07-22 | 109.855 | 96.191 | 76.185 | 31.865 |
| 2016-07-23 | 109.855 | 96.191 | 76.185 | 31.865 |
| 2016-07-24 | 109.761 | 96.696 | 76.185 | 31.865 |
| 2016-07-25 | 109.725 | 96.439 | 76.005 | 31.712 |
| 2016-07-26 | 109.603 | 95.209 | 76.467 | 31.603 |
| 2016-07-27 | 109.475 | 95.212 | 76.885 | 31.929 |
| 2016-07-28 | 108.904 | 93.869 | 76.986 | 31.085 |
| 2016-07-29 | 108.904 | 93.869 | 76.749 | 31.753 |
| 2016-07-30 | 108.904 | 93.869 | 76.749 | 31.753 |
| 2016-07-31 | 109.371 | 94.298 | 76.749 | 31.753 |
| 2016-08-01 | 109.627 | 95.873 | 76.117 | 31.185 |
| 2016-08-02 | 108.681 | 94.431 | 75.508 | 30.134 |
| 2016-08-03 | 108.922 | 93.802 | 76.625 | 30.668 |
| 2016-08-04 | 109.545 | 93.893 | 76.569 | 31.078 |
| 2016-08-05 | 109.545 | 93.893 | 78.995 | 31.765 |
| 2016-08-06 | 109.545 | 93.893 | 78.995 | 31.765 |
| 2016-08-07 | 110.685 | 95.089 | 78.995 | 31.765 |
| 2016-08-08 | 110.786 | 95.825 | 78.995 | 32.215 |
| 2016-08-09 | 110.929 | 96.377 | 78.939 | 32.58 |
| 2016-08-10 | 110.116 | 96.86 | 77.935 | 32.694 |
| 2016-08-11 | 110.55 | 97.518 | 78.284 | 32.835 |
| 2016-08-12 | 110.55 | 97.518 | 77.935 | 32.778 |
| 2016-08-13 | 110.55 | 97.518 | 77.935 | 32.778 |
| 2016-08-14 | 110.55 | 97.518 | 77.935 | 32.778 |
| 2016-08-15 | 111.013 | 97.199 | 78.883 | 32.697 |
| 2016-08-16 | 110.605 | 97.593 | 78.894 | 32.38 |
| 2016-08-17 | 110.316 | 97.714 | 79.063 | 32.015 |
| 2016-08-18 | 110.507 | 98.963 | 79.131 | 32.156 |
| 2016-08-19 | 110.507 | 98.963 | 79.266 | 31.705 |
| 2016-08-20 | 110.507 | 98.963 | 79.266 | 31.705 |
| 2016-08-21 | 110.827 | 98.201 | 79.266 | 31.705 |
| 2016-08-22 | 111.052 | 98.43 | 79.266 | 31.862 |
| 2016-08-23 | 111.387 | 98.493 | 79.323 | 32.621 |
| 2016-08-24 | 111.169 | 98.074 | 79.244 | 33.274 |
| 2016-08-25 | 110.117 | 98.053 | 79.549 | 33.007 |
| 2016-08-26 | 110.117 | 98.053 | 80.135 | 33.259 |
| 2016-08-27 | 110.117 | 98.053 | 80.135 | 33.259 |
| 2016-08-28 | 109.627 | 97.721 | 80.135 | 33.259 |
| 2016-08-29 | 109.296 | 97.688 | 80.824 | 33.157 |
| 2016-08-30 | 109.474 | 96.855 | 81.806 | 33.767 |
| 2016-08-31 | 109.271 | 97.058 | 81.964 | 34.344 |
| 2016-09-01 | 108.884 | 97.378 | 81.49 | 34.63 |
| 2016-09-02 | 108.884 | 97.378 | 81.885 | 35.291 |
| 2016-09-03 | 108.884 | 97.378 | 81.885 | 35.291 |
| 2016-09-04 | 108.757 | 97.786 | 81.885 | 35.291 |
| 2016-09-05 | 109.412 | 99.779 | 81.885 | 35.188 |
| 2016-09-06 | 109.508 | 100.495 | 81.016 | 34.606 |
| 2016-09-07 | 110.181 | 101.417 | 81.174 | 34.709 |
| 2016-09-08 | 109.927 | 100.894 | 81.524 | 35.112 |
| 2016-09-09 | 109.927 | 100.894 | 80.711 | 35.217 |
| 2016-09-10 | 109.927 | 100.894 | 80.711 | 35.217 |
| 2016-09-11 | 107.822 | 99.49 | 80.711 | 35.217 |
| 2016-09-12 | 108.148 | 100.133 | 81.535 | 34.506 |
| 2016-09-13 | 107.782 | 98.339 | 80.226 | 33.894 |
| 2016-09-14 | 107.874 | 98.232 | 79.763 | 33.767 |
| 2016-09-15 | 107.915 | 99.039 | 80.293 | 33.977 |
| 2016-09-16 | 107.915 | 99.039 | 79.402 | 33.262 |
| 2016-09-17 | 107.915 | 99.039 | 79.402 | 33.262 |
| 2016-09-18 | 108.924 | 99.708 | 79.402 | 33.262 |
| 2016-09-19 | 109.166 | 100.213 | 79.786 | 33.574 |
| 2016-09-20 | 108.495 | 99.6 | 79.91 | 33.309 |
| 2016-09-21 | 108.466 | 100.12 | 80.305 | 33.963 |
| 2016-09-22 | 110.116 | 102.272 | 80.474 | 34.242 |
| 2016-09-23 | 110.116 | 102.272 | 80.406 | 33.741 |
| 2016-09-24 | 110.116 | 102.272 | 80.406 | 33.741 |
| 2016-09-25 | 110.251 | 101.359 | 80.406 | 33.741 |
| 2016-09-26 | 109.612 | 100.016 | 78.702 | 32.957 |
| 2016-09-27 | 109.367 | 99.974 | 79.481 | 32.899 |
| 2016-09-28 | 109.149 | 100.058 | 79.91 | 33.085 |
| 2016-09-29 | 108.434 | 99.741 | 78.679 | 33.212 |
| 2016-09-30 | 108.434 | 99.741 | 79.966 | 33.402 |
| 2016-10-01 | 108.434 | 99.741 | 79.966 | 33.402 |
| 2016-10-02 | 108.434 | 99.741 | 79.966 | 33.402 |
| 2016-10-03 | 108.434 | 99.741 | 79.695 | 33.381 |
| 2016-10-04 | 108.434 | 99.741 | 80.587 | 33.66 |
| 2016-10-05 | 108.324 | 100.583 | 82.156 | 34.137 |
| 2016-10-06 | 108.038 | 100.552 | 82.336 | 34.347 |
| 2016-10-07 | 108.038 | 100.552 | 82.235 | 34.196 |
| 2016-10-08 | 108.038 | 100.552 | 82.235 | 34.196 |
| 2016-10-09 | 108.234 | 101.638 | 82.235 | 34.196 |
| 2016-10-10 | 108.808 | 103.251 | 82.619 | 34.282 |
| 2016-10-11 | 108.808 | 103.251 | 81.637 | 34.082 |
| 2016-10-12 | 108.808 | 103.251 | 81.569 | 34.089 |
| 2016-10-13 | 106.699 | 101.779 | 80.023 | 33.376 |
| 2016-10-14 | 106.699 | 101.779 | 80.395 | 34.094 |
| 2016-10-15 | 106.699 | 101.779 | 80.395 | 34.094 |
| 2016-10-16 | 106.699 | 101.779 | 80.395 | 34.094 |
| 2016-10-17 | 106.699 | 101.779 | 80.056 | 34.068 |
| 2016-10-18 | 107.289 | 104.429 | 81.072 | 34.878 |
| 2016-10-19 | 107.475 | 103.879 | 82.427 | 35.202 |
| 2016-10-20 | 107.537 | 104.414 | 82.946 | 35.646 |
| 2016-10-21 | 107.537 | 104.414 | 83.172 | 35.825 |
| 2016-10-22 | 107.537 | 104.414 | 83.172 | 35.825 |
| 2016-10-23 | 107.537 | 104.414 | 83.172 | 35.825 |
| 2016-10-24 | 107.537 | 104.414 | 83.555 | 36.321 |
| 2016-10-25 | 108.21 | 104.181 | 83.612 | 36.197 |
| 2016-10-26 | 107.804 | 103.515 | 84.368 | 36.28 |
| 2016-10-27 | 107.475 | 102.917 | 84.763 | 36.709 |
| 2016-10-28 | 107.475 | 102.917 | 84.131 | 36.619 |
| 2016-10-29 | 107.475 | 102.917 | 84.131 | 36.619 |
| 2016-10-30 | 106.006 | 101.792 | 84.131 | 36.619 |
| 2016-10-31 | 105.796 | 102.775 | 84.074 | 36.228 |
| 2016-11-01 | 105.303 | 101.557 | 84.086 | 35.653 |
| 2016-11-02 | 104.624 | 101.141 | 83.014 | 34.809 |
| 2016-11-03 | 104.35 | 101.856 | 82.923 | 35.155 |
| 2016-11-04 | 104.35 | 101.856 | 82.799 | 34.83 |
| 2016-11-05 | 104.35 | 101.856 | 82.799 | 34.83 |
| 2016-11-06 | 104.565 | 102.814 | 82.799 | 34.83 |
| 2016-11-07 | 105.979 | 104.966 | 85.124 | 35.822 |
| 2016-11-08 | 105.053 | 105.083 | 84.808 | 36.058 |
| 2016-11-09 | 105.987 | 106.474 | 88.973 | 36.714 |
| 2016-11-10 | 106.804 | 106.129 | 92.381 | 37.539 |
| 2016-11-11 | 106.804 | 106.129 | 93.307 | 37.453 |
| 2016-11-12 | 106.804 | 106.129 | 93.307 | 37.453 |
| 2016-11-13 | 107.228 | 108.851 | 93.307 | 37.453 |
| 2016-11-14 | 107.29 | 108.231 | 96.321 | 38.228 |
| 2016-11-15 | 107.18 | 107.875 | 96.603 | 38.194 |
| 2016-11-16 | 107.487 | 108.187 | 94.695 | 37.718 |
| 2016-11-17 | 107.529 | 108.123 | 96.332 | 37.837 |
| 2016-11-18 | 107.529 | 108.123 | 96.738 | 37.622 |
| 2016-11-19 | 107.529 | 108.123 | 96.738 | 37.622 |
| 2016-11-20 | 108.108 | 108.34 | 96.738 | 37.622 |
| 2016-11-21 | 108.423 | 108.689 | 96.907 | 37.608 |
| 2016-11-22 | 108.956 | 110.46 | 97.122 | 37.999 |
| 2016-11-23 | 108.784 | 110.54 | 97.867 | 37.937 |
| 2016-11-24 | 108.824 | 109.884 | 97.867 | 37.88 |
| 2016-11-25 | 108.824 | 109.884 | 98.093 | 37.66 |
| 2016-11-26 | 108.824 | 109.884 | 98.093 | 37.66 |
| 2016-11-27 | 109.351 | 110.479 | 98.093 | 37.66 |
| 2016-11-28 | 108.961 | 109.928 | 96.275 | 36.981 |
| 2016-11-29 | 108.901 | 110.108 | 96.558 | 37.279 |
| 2016-11-30 | 108.606 | 110.194 | 98.499 | 37.703 |
| 2016-12-01 | 108.185 | 109.417 | 100.643 | 38.144 |
| 2016-12-02 | 108.185 | 109.417 | 99.582 | 37.646 |
| 2016-12-03 | 108.185 | 109.417 | 99.582 | 37.646 |
| 2016-12-04 | 107.712 | 109.039 | 99.582 | 37.646 |
| 2016-12-05 | 108.991 | 111.11 | 100.779 | 37.932 |
| 2016-12-06 | 108.637 | 111.991 | 102.043 | 39.594 |
| 2016-12-07 | 108.214 | 111.185 | 103.6 | 40.566 |
| 2016-12-08 | 108.65 | 111.315 | 104.921 | 41.508 |
| 2016-12-09 | 108.65 | 111.315 | 104.932 | 41.222 |
| 2016-12-10 | 108.65 | 111.315 | 104.932 | 41.222 |
| 2016-12-11 | 109.9 | 111.285 | 104.932 | 41.222 |
| 2016-12-12 | 109.316 | 110.342 | 103.578 | 40.786 |
| 2016-12-13 | 109.988 | 109.945 | 103.702 | 41.27 |
| 2016-12-14 | 109.279 | 108.736 | 103.363 | 40.788 |
| 2016-12-15 | 109.262 | 108.586 | 104.729 | 41.801 |
| 2016-12-16 | 109.262 | 108.586 | 103.521 | 41.658 |
| 2016-12-17 | 109.262 | 108.586 | 103.521 | 41.658 |
| 2016-12-18 | 109.418 | 109.307 | 103.521 | 41.658 |
| 2016-12-19 | 109.74 | 109.271 | 103.804 | 40.96 |
| 2016-12-20 | 110.121 | 112.212 | 105.305 | 41.408 |
| 2016-12-21 | 109.647 | 111.874 | 104.91 | 41.291 |
| 2016-12-22 | 109.778 | 111.913 | 104.808 | 41.112 |
| 2016-12-23 | 109.778 | 111.913 | 105.124 | 40.912 |
| 2016-12-24 | 109.778 | 111.913 | 105.124 | 40.912 |
| 2016-12-25 | 109.384 | 111.439 | 105.124 | 40.912 |
| 2016-12-26 | 109.336 | 110.986 | 105.124 | 40.912 |
| 2016-12-27 | 110.532 | 111.727 | 105.395 | 40.836 |
| 2016-12-28 | 110.799 | 112.51 | 104.21 | 40.841 |
| 2016-12-29 | 110.202 | 111.891 | 103.093 | 40.354 |
| 2016-12-30 | 110.202 | 111.891 | 103.6 | 40.593 |
| 2016-12-31 | 110.202 | 111.891 | 103.6 | 40.593 |
| 2017-01-01 | 109.736 | 111.827 | 103.6 | 40.593 |
| 2017-01-02 | 110.035 | 111.893 | 103.6 | 40.817 |
| 2017-01-03 | 110.466 | 111.535 | 104.605 | 41.975 |
| 2017-01-04 | 110.666 | 112.008 | 105.767 | 42.207 |
| 2017-01-05 | 110.915 | 113.357 | 104.278 | 41.968 |
| 2017-01-06 | 110.915 | 113.357 | 104.707 | 42.133 |
| 2017-01-07 | 110.915 | 113.357 | 104.707 | 42.133 |
| 2017-01-08 | 110.373 | 112.366 | 104.707 | 42.133 |
| 2017-01-09 | 110.363 | 112.474 | 103.984 | 41.403 |
| 2017-01-10 | 110.043 | 112.233 | 104.673 | 41.351 |
| 2017-01-11 | 109.693 | 113.139 | 105.237 | 41.305 |
| 2017-01-12 | 109.06 | 114.107 | 104.187 | 41.012 |
| 2017-01-13 | 109.06 | 114.107 | 105.09 | 41.825 |
| 2017-01-14 | 109.06 | 114.107 | 105.09 | 41.825 |
| 2017-01-15 | 109.233 | 114.924 | 105.09 | 41.825 |
| 2017-01-16 | 108.835 | 114.653 | 105.09 | 41.232 |
| 2017-01-17 | 108.674 | 114.842 | 101.49 | 41.244 |
| 2017-01-18 | 108.362 | 113.879 | 102.246 | 41.151 |
| 2017-01-19 | 107.256 | 111.155 | 101.524 | 41.391 |
| 2017-01-20 | 107.256 | 111.155 | 102.122 | 41.527 |
| 2017-01-21 | 107.256 | 111.155 | 102.122 | 41.527 |
| 2017-01-22 | 106.917 | 111.799 | 102.122 | 41.527 |
| 2017-01-23 | 105.894 | 110.997 | 101.67 | 41.024 |
| 2017-01-24 | 106.488 | 112.707 | 103.239 | 41.46 |
| 2017-01-25 | 107.256 | 113.153 | 104.921 | 42.707 |
| 2017-01-26 | 107.446 | 113.435 | 105.35 | 42.817 |
| 2017-01-27 | 107.446 | 113.435 | 104.797 | 42.464 |
| 2017-01-28 | 107.446 | 113.435 | 104.797 | 42.464 |
| 2017-01-29 | 107.641 | 112.837 | 104.797 | 42.464 |
| 2017-01-30 | 106.625 | 110.967 | 103.826 | 41.751 |
| 2017-01-31 | 106.816 | 110.943 | 103.172 | 41.289 |
| 2017-02-01 | 107.774 | 110.969 | 103.488 | 41.856 |
| 2017-02-02 | 107.308 | 110.52 | 102.822 | 41.611 |
| 2017-02-03 | 107.308 | 110.52 | 105.124 | 42.149 |
| 2017-02-04 | 107.308 | 110.52 | 105.124 | 42.149 |
| 2017-02-05 | 107.206 | 110.668 | 105.124 | 42.149 |
| 2017-02-06 | 107.322 | 110.138 | 104.695 | 41.611 |
| 2017-02-07 | 107.659 | 111.132 | 104.278 | 41.279 |
| 2017-02-08 | 106.98 | 111.44 | 103.273 | 40.962 |
| 2017-02-09 | 107.738 | 112.308 | 104.876 | 41.472 |
| 2017-02-10 | 107.738 | 112.308 | 105.124 | 41.148 |
| 2017-02-11 | 107.738 | 112.308 | 105.124 | 41.148 |
| 2017-02-12 | 108.772 | 113.28 | 105.124 | 41.148 |
| 2017-02-13 | 109.53 | 113.847 | 106.332 | 41.518 |
| 2017-02-14 | 109.646 | 113.589 | 108.284 | 41.94 |
| 2017-02-15 | 110.22 | 113.302 | 109.357 | 42.502 |
| 2017-02-16 | 110.636 | 114.289 | 108.871 | 42.152 |
| 2017-02-17 | 110.636 | 114.289 | 108.646 | 41.763 |
| 2017-02-18 | 110.636 | 114.289 | 108.646 | 41.763 |
| 2017-02-19 | 111.306 | 113.696 | 108.646 | 41.763 |
| 2017-02-20 | 111.283 | 113.229 | 108.646 | 41.918 |
| 2017-02-21 | 111.143 | 112.696 | 109.244 | 41.522 |
| 2017-02-22 | 110.794 | 112.313 | 109.142 | 41.444 |
| 2017-02-23 | 110.55 | 112.203 | 109.221 | 41.017 |
| 2017-02-24 | 110.55 | 112.203 | 108.183 | 40.445 |
| 2017-02-25 | 110.55 | 112.203 | 108.183 | 40.445 |
| 2017-02-26 | 110.495 | 111.558 | 108.183 | 40.445 |
| 2017-02-27 | 109.824 | 111.807 | 108.837 | 40.364 |
| 2017-02-28 | 108.762 | 112.519 | 108.6 | 40.526 |
| 2017-03-01 | 110.371 | 113.721 | 112.111 | 41.742 |
| 2017-03-02 | 110.657 | 113.731 | 109.786 | 41.62 |
| 2017-03-03 | 110.657 | 113.731 | 110.293 | 42.111 |
| 2017-03-04 | 110.657 | 113.731 | 110.293 | 42.111 |
| 2017-03-05 | 110.526 | 113.625 | 110.293 | 42.111 |
| 2017-03-06 | 109.413 | 113.665 | 109.571 | 41.594 |
| 2017-03-07 | 109.425 | 114.779 | 109.199 | 41.499 |
| 2017-03-08 | 110.059 | 116.703 | 109.244 | 41.823 |
| 2017-03-09 | 110.121 | 117.25 | 109.481 | 42.285 |
| 2017-03-10 | 110.121 | 117.25 | 109.187 | 42.612 |
| 2017-03-11 | 110.121 | 117.25 | 109.187 | 42.612 |
| 2017-03-12 | 110.121 | 117.25 | 109.187 | 42.612 |
| 2017-03-13 | 110.219 | 119.887 | 109.074 | 42.624 |
| 2017-03-14 | 109.939 | 119.429 | 108.928 | 42.107 |
| 2017-03-15 | 109.984 | 119.237 | 108.239 | 42.495 |
| 2017-03-16 | 109.352 | 117.369 | 108.792 | 42.896 |
| 2017-03-17 | 109.352 | 117.369 | 107.607 | 42.624 |
| 2017-03-18 | 109.352 | 117.369 | 107.607 | 42.624 |
| 2017-03-19 | 108.743 | 115.741 | 107.607 | 42.624 |
| 2017-03-20 | 109.236 | 116.224 | 106.309 | 42.376 |
| 2017-03-21 | 108.57 | 116.425 | 102.144 | 42.438 |
| 2017-03-22 | 108.637 | 115.855 | 102.099 | 42.071 |
| 2017-03-23 | 108.802 | 116.235 | 102.472 | 42.388 |
| 2017-03-24 | 108.802 | 116.235 | 102.528 | 42.221 |
| 2017-03-25 | 108.802 | 116.235 | 102.528 | 42.221 |
| 2017-03-26 | 107.979 | 114.799 | 102.528 | 42.221 |
| 2017-03-27 | 107.175 | 113.997 | 102.065 | 41.985 |
| 2017-03-28 | 107.783 | 113.781 | 103.758 | 42.548 |
| 2017-03-29 | 107.655 | 113.353 | 103.183 | 42.457 |
| 2017-03-30 | 107.553 | 113.313 | 105.023 | 42.617 |
| 2017-03-31 | 107.553 | 113.313 | 103.894 | 42.676 |
| 2017-04-01 | 107.553 | 113.313 | 103.894 | 42.676 |
| 2017-04-02 | 107.679 | 113.329 | 103.894 | 42.676 |
| 2017-04-03 | 107.604 | 113.149 | 103.646 | 42.078 |
| 2017-04-04 | 107.762 | 113.079 | 103.352 | 41.899 |
| 2017-04-05 | 108.983 | 113.913 | 102.291 | 42.054 |
| 2017-04-06 | 108.473 | 112.883 | 103.104 | 42.166 |
| 2017-04-07 | 108.473 | 112.883 | 102.607 | 42.087 |
| 2017-04-08 | 108.473 | 112.883 | 102.607 | 42.087 |
| 2017-04-09 | 108.185 | 110.932 | 102.607 | 42.087 |
| 2017-04-10 | 108.185 | 110.932 | 101.953 | 41.985 |
| 2017-04-11 | 108.185 | 110.932 | 101.885 | 41.711 |
| 2017-04-12 | 108.156 | 112.729 | 100.79 | 41.482 |
| 2017-04-13 | 106.972 | 111.558 | 99.345 | 40.991 |
| 2017-04-14 | 106.972 | 111.558 | 99.345 | 40.991 |
| 2017-04-15 | 106.972 | 111.558 | 99.345 | 40.991 |
| 2017-04-16 | 106.972 | 111.558 | 99.345 | 40.991 |
| 2017-04-17 | 106.972 | 111.558 | 101.23 | 40.991 |
| 2017-04-18 | 107.046 | 113.334 | 100.192 | 40.535 |
| 2017-04-19 | 107.886 | 114.667 | 100.135 | 41.246 |
| 2017-04-20 | 108.179 | 115.883 | 102.009 | 41.561 |
| 2017-04-21 | 108.179 | 115.883 | 101.163 | 41.818 |
| 2017-04-22 | 108.179 | 115.883 | 101.163 | 41.818 |
| 2017-04-23 | 107.52 | 114.825 | 101.163 | 41.818 |
| 2017-04-24 | 108.747 | 117.185 | 103.725 | 43.809 |
| 2017-04-25 | 108.918 | 117.992 | 104.481 | 44.061 |
| 2017-04-26 | 109.54 | 117.298 | 104.797 | 44.152 |
| 2017-04-27 | 109.26 | 116.315 | 104.074 | 43.761 |
| 2017-04-28 | 109.26 | 116.315 | 102.98 | 43.825 |
| 2017-04-29 | 109.26 | 116.315 | 102.98 | 43.825 |
| 2017-04-30 | 108.729 | 115.856 | 102.98 | 43.825 |
| 2017-05-01 | 108.729 | 115.856 | 103.928 | 43.797 |
| 2017-05-02 | 108.729 | 115.856 | 103.567 | 44.109 |
| 2017-05-03 | 109.291 | 117.076 | 104.616 | 44.359 |
| 2017-05-04 | 109.625 | 117.868 | 104.865 | 45.015 |
| 2017-05-05 | 109.625 | 117.868 | 104.56 | 45.392 |
| 2017-05-06 | 109.625 | 117.868 | 104.56 | 45.392 |
| 2017-05-07 | 110.753 | 119.764 | 104.56 | 45.392 |
| 2017-05-08 | 110.841 | 118.662 | 104.898 | 45.118 |
| 2017-05-09 | 111.485 | 118.364 | 104.312 | 44.948 |
| 2017-05-10 | 111.046 | 117.888 | 104.515 | 45.146 |
| 2017-05-11 | 111.32 | 116.941 | 103.713 | 44.915 |
| 2017-05-12 | 111.32 | 116.941 | 103.228 | 44.846 |
| 2017-05-13 | 111.32 | 116.941 | 103.228 | 44.846 |
| 2017-05-14 | 112.018 | 117.291 | 103.228 | 44.846 |
| 2017-05-15 | 112.06 | 117.969 | 104.131 | 45.194 |
| 2017-05-16 | 112.216 | 117.781 | 104.616 | 44.991 |
| 2017-05-17 | 110.946 | 116.46 | 100.35 | 44.095 |
| 2017-05-18 | 110.177 | 117.121 | 100.722 | 43.742 |
| 2017-05-19 | 110.177 | 117.121 | 101.603 | 44.188 |
| 2017-05-20 | 110.177 | 117.121 | 101.603 | 44.188 |
| 2017-05-21 | 111.045 | 119.227 | 101.603 | 44.188 |
| 2017-05-22 | 111.488 | 118.748 | 101.84 | 43.864 |
| 2017-05-23 | 111.687 | 117.836 | 103.172 | 44.212 |
| 2017-05-24 | 111.636 | 116.64 | 102.856 | 44.288 |
| 2017-05-25 | 111.866 | 118.768 | 102.777 | 44.193 |
| 2017-05-26 | 111.866 | 118.768 | 102.517 | 43.928 |
| 2017-05-27 | 111.866 | 118.768 | 102.517 | 43.928 |
| 2017-05-28 | 111.44 | 120.355 | 102.517 | 43.928 |
| 2017-05-29 | 111.358 | 121.083 | 102.517 | 43.792 |
| 2017-05-30 | 111.358 | 121.083 | 101.512 | 43.375 |
| 2017-05-31 | 111.358 | 121.083 | 100.305 | 43.015 |
| 2017-06-01 | 111.241 | 119.994 | 101.58 | 43.065 |
| 2017-06-02 | 111.241 | 119.994 | 100.88 | 43.005 |
| 2017-06-03 | 111.241 | 119.994 | 100.88 | 43.005 |
| 2017-06-04 | 111.804 | 121.696 | 100.88 | 43.005 |
| 2017-06-05 | 111.593 | 122.069 | 101.027 | 43.043 |
| 2017-06-06 | 111.085 | 121.756 | 100.576 | 42.795 |
| 2017-06-07 | 111.321 | 120.958 | 101.749 | 43.103 |
| 2017-06-08 | 110.943 | 121.157 | 103.51 | 43.558 |
| 2017-06-09 | 110.943 | 121.157 | 105.858 | 43.761 |
| 2017-06-10 | 110.943 | 121.157 | 105.858 | 43.761 |
| 2017-06-11 | 110.943 | 121.06 | 105.858 | 43.761 |
| 2017-06-12 | 110.027 | 120.407 | 105.937 | 43.222 |
| 2017-06-13 | 110.762 | 121.02 | 106.467 | 43.365 |
| 2017-06-14 | 111.068 | 122.218 | 106.591 | 42.788 |
| 2017-06-15 | 110.273 | 121.954 | 106.027 | 42.879 |
| 2017-06-16 | 110.273 | 121.954 | 105.801 | 42.91 |
| 2017-06-17 | 110.273 | 121.954 | 105.801 | 42.91 |
| 2017-06-18 | 110.623 | 121.508 | 105.801 | 42.91 |
| 2017-06-19 | 111.627 | 123.557 | 106.761 | 43.387 |
| 2017-06-20 | 111.335 | 122.898 | 105.745 | 42.857 |
| 2017-06-21 | 111.424 | 122.762 | 104.898 | 42.812 |
| 2017-06-22 | 111.063 | 122.152 | 104.165 | 42.576 |
| 2017-06-23 | 111.063 | 122.152 | 103.318 | 42.364 |
| 2017-06-24 | 111.063 | 122.152 | 103.318 | 42.364 |
| 2017-06-25 | 111.452 | 121.893 | 103.318 | 42.364 |
| 2017-06-26 | 111.534 | 120.643 | 103.995 | 42.729 |
| 2017-06-27 | 111.046 | 120.255 | 104.774 | 43.067 |
| 2017-06-28 | 110.865 | 120.363 | 106.524 | 43.644 |
| 2017-06-29 | 110.762 | 121.173 | 107.901 | 43.88 |
| 2017-06-30 | 110.762 | 121.173 | 107.901 | 43.458 |
| 2017-07-01 | 110.762 | 121.173 | 107.901 | 43.458 |
| 2017-07-02 | 110.987 | 121.677 | 107.901 | 43.458 |
| 2017-07-03 | 111.176 | 121.832 | 109.571 | 44.629 |
| 2017-07-04 | 111.196 | 121.918 | 109.571 | 44.564 |
| 2017-07-05 | 111.109 | 122.021 | 109.944 | 44.567 |
| 2017-07-06 | 110.758 | 122.492 | 109.007 | 44.855 |
| 2017-07-07 | 110.758 | 122.492 | 109.628 | 44.731 |
| 2017-07-08 | 110.758 | 122.492 | 109.628 | 44.731 |
| 2017-07-09 | 111.468 | 123.602 | 109.628 | 44.731 |
| 2017-07-10 | 111.599 | 124.889 | 109.526 | 44.848 |
| 2017-07-11 | 111.47 | 126.474 | 108.849 | 44.622 |
| 2017-07-12 | 111.93 | 126.907 | 108.77 | 44.924 |
| 2017-07-13 | 112.65 | 127.22 | 109.447 | 45.32 |
| 2017-07-14 | 112.65 | 127.22 | 108.679 | 45.101 |
| 2017-07-15 | 112.65 | 127.22 | 108.679 | 45.101 |
| 2017-07-16 | 113.063 | 126.999 | 108.679 | 45.101 |
| 2017-07-17 | 112.671 | 126.361 | 108.567 | 45.046 |
| 2017-07-18 | 112.25 | 126.393 | 107.923 | 44.321 |
| 2017-07-19 | 112.324 | 126.004 | 107.46 | 44.588 |
| 2017-07-20 | 112.356 | 125.788 | 107.246 | 44.4 |
| 2017-07-21 | 112.356 | 125.788 | 106.964 | 43.909 |
| 2017-07-22 | 112.356 | 125.788 | 106.964 | 43.909 |
| 2017-07-23 | 111.9 | 124.482 | 106.964 | 43.909 |
| 2017-07-24 | 111.788 | 124.356 | 107.765 | 44.278 |
| 2017-07-25 | 112.151 | 124.933 | 109.199 | 45.001 |
| 2017-07-26 | 112.026 | 124.574 | 108.093 | 45.187 |
| 2017-07-27 | 111.909 | 124.895 | 107.788 | 45.106 |
| 2017-07-28 | 111.909 | 124.895 | 107.483 | 44.717 |
| 2017-07-29 | 111.909 | 124.895 | 107.483 | 44.717 |
| 2017-07-30 | 111.619 | 124.399 | 107.483 | 44.717 |
| 2017-07-31 | 111.455 | 123.772 | 108.341 | 44.645 |
| 2017-08-01 | 111.455 | 123.772 | 109.255 | 44.996 |
| 2017-08-02 | 110.849 | 124.927 | 109.368 | 44.605 |
| 2017-08-03 | 109.794 | 126.183 | 108.702 | 44.731 |
| 2017-08-04 | 109.794 | 126.183 | 109.729 | 45.268 |
| 2017-08-05 | 109.794 | 126.183 | 109.729 | 45.268 |
| 2017-08-06 | 108.64 | 126.462 | 109.729 | 45.268 |
| 2017-08-07 | 108.711 | 126.486 | 109.413 | 45.27 |
| 2017-08-08 | 108.322 | 126.233 | 109.582 | 45.404 |
| 2017-08-09 | 107.261 | 123.857 | 108.973 | 44.76 |
| 2017-08-10 | 106.098 | 121.432 | 106.524 | 44.1 |
| 2017-08-11 | 106.098 | 121.432 | 105.824 | 43.418 |
| 2017-08-12 | 106.098 | 121.432 | 105.824 | 43.418 |
| 2017-08-13 | 106.242 | 123.01 | 105.824 | 43.418 |
| 2017-08-14 | 108.106 | 126.302 | 107.709 | 44.045 |
| 2017-08-15 | 108.157 | 128.065 | 107.867 | 44.147 |
| 2017-08-16 | 108.714 | 128.453 | 107.483 | 44.386 |
| 2017-08-17 | 108.289 | 127.765 | 105.214 | 43.649 |
| 2017-08-18 | 108.289 | 127.765 | 105.237 | 43.57 |
| 2017-08-19 | 108.289 | 127.765 | 105.237 | 43.57 |
| 2017-08-20 | 107.971 | 128.581 | 105.237 | 43.57 |
| 2017-08-21 | 108.246 | 128.523 | 104.797 | 43.179 |
| 2017-08-22 | 109.204 | 129.958 | 105.959 | 43.365 |
| 2017-08-23 | 108.502 | 126.961 | 105.959 | 43.032 |
| 2017-08-24 | 108.607 | 127.264 | 106.264 | 43.189 |
| 2017-08-25 | 108.607 | 127.264 | 106.321 | 43.222 |
| 2017-08-26 | 108.607 | 127.264 | 106.321 | 43.222 |
| 2017-08-27 | 108.423 | 128.062 | 106.321 | 43.222 |
| 2017-08-28 | 108.632 | 126.355 | 105.734 | 43.089 |
| 2017-08-29 | 107.719 | 125.744 | 104.944 | 42.467 |
| 2017-08-30 | 108.496 | 126.985 | 105.339 | 42.776 |
| 2017-08-31 | 109.235 | 126.95 | 104.944 | 43.041 |
| 2017-09-01 | 109.235 | 126.95 | 105.734 | 43.248 |
| 2017-09-02 | 109.235 | 126.95 | 105.734 | 43.248 |
| 2017-09-03 | 107.962 | 125.537 | 105.734 | 43.248 |
| 2017-09-04 | 108.563 | 125.367 | 105.734 | 42.877 |
| 2017-09-05 | 108.867 | 125.581 | 103.138 | 42.338 |
| 2017-09-06 | 108.772 | 125.53 | 103.307 | 42.223 |
| 2017-09-07 | 108.315 | 125.946 | 101.253 | 41.909 |
| 2017-09-08 | 108.315 | 125.946 | 101.772 | 42.266 |
| 2017-09-09 | 108.315 | 125.946 | 101.772 | 42.266 |
| 2017-09-10 | 108.167 | 126.017 | 101.772 | 42.266 |
| 2017-09-11 | 109.463 | 125.529 | 103.837 | 42.922 |
| 2017-09-12 | 110.034 | 125.265 | 105.542 | 43.63 |
| 2017-09-13 | 110.449 | 125.156 | 105.959 | 43.744 |
| 2017-09-14 | 110.379 | 124.409 | 105.35 | 43.885 |
| 2017-09-15 | 110.379 | 124.409 | 105.88 | 43.511 |
| 2017-09-16 | 110.379 | 124.409 | 105.88 | 43.511 |
| 2017-09-17 | 110.613 | 125.034 | 105.88 | 43.511 |
| 2017-09-18 | 111.543 | 126.126 | 107.246 | 43.747 |
| 2017-09-19 | 111.316 | 126.401 | 108.194 | 43.856 |
| 2017-09-20 | 111.316 | 126.401 | 109.074 | 43.67 |
| 2017-09-21 | 111.316 | 126.401 | 109.65 | 44.288 |
| 2017-09-22 | 111.316 | 126.401 | 109.526 | 44.309 |
| 2017-09-23 | 111.316 | 126.401 | 109.526 | 44.309 |
| 2017-09-24 | 111.067 | 127.931 | 109.526 | 44.309 |
| 2017-09-25 | 110.954 | 127.765 | 109.233 | 43.954 |
| 2017-09-26 | 110.966 | 126.522 | 109.447 | 43.959 |
| 2017-09-27 | 110.965 | 126.467 | 111.23 | 44.839 |
| 2017-09-28 | 111.068 | 127.859 | 111.388 | 44.884 |
| 2017-09-29 | 111.068 | 127.859 | 112.032 | 45.115 |
| 2017-09-30 | 111.068 | 127.859 | 112.032 | 45.115 |
| 2017-10-01 | 111.778 | 128.094 | 112.032 | 45.115 |
| 2017-10-02 | 111.941 | 127.062 | 112.652 | 45.025 |
| 2017-10-03 | 112.188 | 128.071 | 112.652 | 45.146 |
| 2017-10-04 | 112.188 | 128.071 | 111.998 | 44.645 |
| 2017-10-05 | 112.188 | 128.071 | 113.533 | 45.025 |
| 2017-10-06 | 112.188 | 128.071 | 113.713 | 44.86 |
| 2017-10-07 | 112.188 | 128.071 | 113.713 | 44.86 |
| 2017-10-08 | 113.193 | 128.716 | 113.713 | 44.86 |
| 2017-10-09 | 113.068 | 128.448 | 113.036 | 44.769 |
| 2017-10-10 | 112.755 | 128.955 | 113.725 | 44.612 |
| 2017-10-11 | 112.755 | 128.955 | 113.341 | 44.579 |
| 2017-10-12 | 112.755 | 128.955 | 112.144 | 44.302 |
| 2017-10-13 | 112.755 | 128.955 | 111.603 | 44.109 |
| 2017-10-14 | 112.755 | 128.955 | 111.603 | 44.109 |
| 2017-10-15 | 113.395 | 130.286 | 111.603 | 44.109 |
| 2017-10-16 | 112.877 | 130.207 | 112.325 | 44.09 |
| 2017-10-17 | 113.119 | 129.34 | 111.501 | 44.2 |
| 2017-10-18 | 113.595 | 129.588 | 112.223 | 44.433 |
| 2017-10-19 | 112.566 | 129.736 | 112.415 | 44.083 |
| 2017-10-20 | 112.566 | 129.736 | 114.187 | 44.603 |
| 2017-10-21 | 112.566 | 129.736 | 114.187 | 44.603 |
| 2017-10-22 | 113.333 | 130.208 | 114.187 | 44.603 |
| 2017-10-23 | 112.945 | 129.021 | 113.758 | 44.386 |
| 2017-10-24 | 112.884 | 128.834 | 114.673 | 44.615 |
| 2017-10-25 | 112.571 | 129.039 | 114.12 | 44.429 |
| 2017-10-26 | 112.702 | 128.629 | 115.079 | 44.665 |
| 2017-10-27 | 112.702 | 128.629 | 115.384 | 44.498 |
| 2017-10-28 | 112.702 | 128.629 | 115.384 | 44.498 |
| 2017-10-29 | 113.223 | 129.191 | 115.384 | 44.498 |
| 2017-10-30 | 113.031 | 129.847 | 114.853 | 44.493 |
| 2017-10-31 | 113.025 | 130.917 | 114.503 | 44.409 |
| 2017-11-01 | 113.187 | 130.028 | 114.774 | 44.319 |
| 2017-11-02 | 112.112 | 130.426 | 115.474 | 44.293 |
| 2017-11-03 | 112.112 | 130.426 | 115.271 | 43.918 |
| 2017-11-04 | 112.112 | 130.426 | 115.271 | 43.918 |
| 2017-11-05 | 111.984 | 130.162 | 115.271 | 43.918 |
| 2017-11-06 | 112.083 | 129.309 | 115.124 | 43.747 |
| 2017-11-07 | 111.833 | 129.168 | 112.506 | 43.782 |
| 2017-11-08 | 111.595 | 128.578 | 111.49 | 43.735 |
| 2017-11-09 | 111.171 | 127.135 | 110.598 | 43.599 |
| 2017-11-10 | 111.171 | 127.135 | 110.147 | 43.697 |
| 2017-11-11 | 111.171 | 127.135 | 110.147 | 43.697 |
| 2017-11-12 | 111.588 | 128.229 | 110.147 | 43.697 |
| 2017-11-13 | 111.46 | 127.297 | 110.88 | 43.334 |
| 2017-11-14 | 111.126 | 128.288 | 111.422 | 42.984 |
| 2017-11-15 | 110.325 | 127.253 | 111.862 | 43.041 |
| 2017-11-16 | 110.804 | 126.979 | 111.817 | 43.17 |
| 2017-11-17 | 110.804 | 126.979 | 111.941 | 42.934 |
| 2017-11-18 | 110.804 | 126.979 | 111.941 | 42.934 |
| 2017-11-19 | 111.031 | 126.618 | 111.941 | 42.934 |
| 2017-11-20 | 111.207 | 127.558 | 112.517 | 42.986 |
| 2017-11-21 | 111.811 | 128.877 | 112.28 | 42.929 |
| 2017-11-22 | 111.88 | 128.036 | 111.953 | 43.074 |
| 2017-11-23 | 112.869 | 130.047 | 111.953 | 42.984 |
| 2017-11-24 | 112.869 | 130.047 | 111.648 | 43.213 |
| 2017-11-25 | 112.869 | 130.047 | 111.648 | 43.213 |
| 2017-11-26 | 113.458 | 129.478 | 111.648 | 43.213 |
| 2017-11-27 | 113.102 | 127.579 | 111.4 | 42.898 |
| 2017-11-28 | 113.738 | 130.729 | 114.729 | 43.063 |
| 2017-11-29 | 113.801 | 130.994 | 117.81 | 43.759 |
| 2017-11-30 | 114.279 | 130.886 | 118.025 | 43.47 |
| 2017-12-01 | 114.279 | 130.886 | 118.149 | 42.989 |
| 2017-12-02 | 114.279 | 130.886 | 118.149 | 42.989 |
| 2017-12-03 | 115.051 | 133.745 | 118.149 | 42.989 |
| 2017-12-04 | 114.645 | 133.993 | 120.587 | 43.508 |
| 2017-12-05 | 114.215 | 133.765 | 119.503 | 43.296 |
| 2017-12-06 | 113.283 | 132.609 | 118.905 | 42.872 |
| 2017-12-07 | 113.092 | 133.032 | 119.594 | 43.241 |
| 2017-12-08 | 113.092 | 133.032 | 120.384 | 44.202 |
| 2017-12-09 | 113.092 | 133.032 | 120.384 | 44.202 |
| 2017-12-10 | 113.449 | 132.708 | 120.384 | 44.202 |
| 2017-12-11 | 113.934 | 131.766 | 119.831 | 44.324 |
| 2017-12-12 | 114.148 | 131.158 | 121.14 | 44.615 |
| 2017-12-13 | 113.757 | 129.182 | 119.503 | 44.567 |
| 2017-12-14 | 113.944 | 128.743 | 118.476 | 44.193 |
| 2017-12-15 | 113.944 | 128.743 | 119.921 | 43.933 |
| 2017-12-16 | 113.944 | 128.743 | 119.921 | 43.933 |
| 2017-12-17 | 114.199 | 129.875 | 119.921 | 43.933 |
| 2017-12-18 | 114.62 | 131.773 | 121.354 | 44.414 |
| 2017-12-19 | 114.656 | 134.702 | 120.869 | 44.371 |
| 2017-12-20 | 115.024 | 135.322 | 120.53 | 44.133 |
| 2017-12-21 | 115.513 | 135.967 | 122.032 | 44.533 |
| 2017-12-22 | 115.513 | 135.967 | 121.84 | 44.252 |
| 2017-12-23 | 115.513 | 135.967 | 121.84 | 44.252 |
| 2017-12-24 | 117.19 | 138.111 | 121.84 | 44.252 |
| 2017-12-25 | 116.768 | 137.121 | 121.84 | 44.252 |
| 2017-12-26 | 116.858 | 137.589 | 121.072 | 44.252 |
| 2017-12-27 | 116.922 | 137.345 | 120.937 | 44.061 |
| 2017-12-28 | 117.408 | 138.797 | 121.479 | 43.945 |
| 2017-12-29 | 117.408 | 138.797 | 120.44 | 43.864 |
| 2017-12-30 | 117.408 | 138.797 | 120.44 | 43.864 |
| 2017-12-31 | 117.248 | 138.856 | 120.44 | 43.864 |
| 2018-01-01 | 118.442 | 140.364 | 120.44 | 43.864 |
| 2018-01-02 | 119.096 | 141.608 | 120.892 | 43.866 |
| 2018-01-03 | 118.818 | 140.967 | 121.524 | 43.926 |
| 2018-01-04 | 119.689 | 141.475 | 122.652 | 44.648 |
| 2018-01-05 | 119.689 | 141.475 | 122.912 | 44.65 |
| 2018-01-06 | 119.689 | 141.475 | 122.912 | 44.65 |
| 2018-01-07 | 120.009 | 141.636 | 122.912 | 44.65 |
| 2018-01-08 | 119.542 | 141.16 | 122.754 | 44.803 |
| 2018-01-09 | 119.677 | 139.791 | 124.063 | 45.077 |
| 2018-01-10 | 118.592 | 138.987 | 125.7 | 46.014 |
| 2018-01-11 | 119.659 | 140.071 | 126.569 | 46.15 |
| 2018-01-12 | 119.659 | 140.071 | 127.596 | 46.228 |
| 2018-01-13 | 119.659 | 140.071 | 127.596 | 46.228 |
| 2018-01-14 | 120.557 | 141.21 | 127.596 | 46.228 |
| 2018-01-15 | 120.241 | 140.946 | 127.596 | 46.119 |
| 2018-01-16 | 120.304 | 139.751 | 127.088 | 46.15 |
| 2018-01-17 | 119.701 | 140.234 | 127.743 | 46.021 |
| 2018-01-18 | 119.504 | 141.015 | 127.257 | 46.181 |
| 2018-01-19 | 119.504 | 141.015 | 128.826 | 46.305 |
| 2018-01-20 | 119.504 | 141.015 | 128.826 | 46.305 |
| 2018-01-21 | 119.281 | 140.215 | 128.826 | 46.305 |
| 2018-01-22 | 119.838 | 140.119 | 130.079 | 46.886 |
| 2018-01-23 | 120.113 | 140.055 | 130.361 | 46.877 |
| 2018-01-24 | 120.399 | 139.62 | 131.095 | 46.689 |
| 2018-01-25 | 120.645 | 140.707 | 130.451 | 46.746 |
| 2018-01-26 | 120.645 | 140.707 | 131.388 | 46.889 |
| 2018-01-27 | 120.645 | 140.707 | 131.388 | 46.889 |
| 2018-01-28 | 121.635 | 140.061 | 131.388 | 46.889 |
| 2018-01-29 | 121.2 | 139.303 | 131.174 | 46.848 |
| 2018-01-30 | 120.395 | 138.821 | 129.932 | 46.155 |
| 2018-01-31 | 121.039 | 140.422 | 130.135 | 46.04 |
| 2018-02-01 | 120.607 | 139.374 | 131.512 | 46.002 |
| 2018-02-02 | 120.607 | 139.374 | 129.108 | 45.492 |
| 2018-02-03 | 120.607 | 139.374 | 129.108 | 45.492 |
| 2018-02-04 | 118.302 | 137.937 | 129.108 | 45.492 |
| 2018-02-05 | 117.462 | 140.196 | 122.765 | 44.91 |
| 2018-02-06 | 115.467 | 138.486 | 124.842 | 43.623 |
| 2018-02-07 | 116.722 | 139.763 | 125.271 | 44.517 |
| 2018-02-08 | 115.312 | 138.188 | 119.729 | 44.166 |
| 2018-02-09 | 115.312 | 138.188 | 122.099 | 43.401 |
| 2018-02-10 | 115.312 | 138.188 | 122.099 | 43.401 |
| 2018-02-11 | 113.942 | 136.423 | 122.099 | 43.401 |
| 2018-02-12 | 114.457 | 135.834 | 123.646 | 43.725 |
| 2018-02-13 | 114.467 | 136.256 | 124.391 | 43.384 |
| 2018-02-14 | 115.22 | 136.844 | 127.799 | 43.918 |
| 2018-02-15 | 116.433 | 135.715 | 128.262 | 44.131 |
| 2018-02-16 | 116.433 | 135.715 | 128.352 | 44.56 |
| 2018-02-17 | 116.433 | 135.715 | 128.352 | 44.56 |
| 2018-02-18 | 117.146 | 135.52 | 128.352 | 44.56 |
| 2018-02-19 | 118.008 | 135.342 | 128.352 | 44.5 |
| 2018-02-20 | 117.223 | 134.411 | 128.025 | 44.455 |
| 2018-02-21 | 117.455 | 133.982 | 128.578 | 44.691 |
| 2018-02-22 | 117.053 | 134.471 | 126.795 | 44.457 |
| 2018-02-23 | 117.053 | 134.471 | 128.928 | 44.357 |
| 2018-02-24 | 117.053 | 134.471 | 128.928 | 44.357 |
| 2018-02-25 | 117.647 | 134.9 | 128.928 | 44.357 |
| 2018-02-26 | 117.643 | 138.529 | 130.135 | 44.371 |
| 2018-02-27 | 117.836 | 139.308 | 128.679 | 44.576 |
| 2018-02-28 | 117.045 | 138.092 | 127.201 | 44.331 |
| 2018-03-01 | 117.045 | 138.092 | 125.497 | 43.94 |
| 2018-03-02 | 117.045 | 138.092 | 126.298 | 42.8 |
| 2018-03-03 | 117.045 | 138.092 | 126.298 | 42.8 |
| 2018-03-04 | 115.889 | 137.376 | 126.298 | 42.8 |
| 2018-03-05 | 115.091 | 135.888 | 127.799 | 42.8 |
| 2018-03-06 | 115.573 | 138.204 | 128.409 | 42.927 |
| 2018-03-07 | 115.342 | 138.708 | 128.409 | 43.051 |
| 2018-03-08 | 115.386 | 138.855 | 128.217 | 43.287 |
| 2018-03-09 | 115.386 | 138.855 | 131.038 | 43.287 |
| 2018-03-10 | 115.386 | 138.855 | 131.038 | 43.287 |
| 2018-03-11 | 116.355 | 140.137 | 131.038 | 43.287 |
| 2018-03-12 | 116.209 | 142.623 | 130.384 | 43.446 |
| 2018-03-13 | 117.033 | 143.471 | 128.871 | 43.089 |
| 2018-03-14 | 116.793 | 143.706 | 126.964 | 42.669 |
| 2018-03-15 | 117.329 | 143.762 | 127.009 | 42.919 |
| 2018-03-16 | 117.329 | 143.762 | 127.449 | 43.246 |
| 2018-03-17 | 117.329 | 143.762 | 127.449 | 43.246 |
| 2018-03-18 | 117 | 143.866 | 127.449 | 43.246 |
| 2018-03-19 | 115.809 | 141.509 | 126.614 | 42.812 |
| 2018-03-20 | 116.135 | 141.411 | 126.377 | 43.043 |
| 2018-03-21 | 115.937 | 139.477 | 126.625 | 42.657 |
| 2018-03-22 | 114.732 | 139.111 | 121.377 | 41.589 |
| 2018-03-23 | 114.732 | 139.111 | 117.314 | 41.103 |
| 2018-03-24 | 114.732 | 139.111 | 117.314 | 41.103 |
| 2018-03-25 | 111.528 | 134.832 | 117.314 | 41.103 |
| 2018-03-26 | 112.588 | 135.972 | 121.512 | 40.905 |
| 2018-03-27 | 113.614 | 137.615 | 118.567 | 41.146 |
| 2018-03-28 | 112.432 | 136.052 | 118.657 | 41.22 |
| 2018-03-29 | 112.618 | 137.757 | 120.203 | 41.277 |
| 2018-03-30 | 112.618 | 137.757 | 120.203 | 41.277 |
| 2018-03-31 | 112.618 | 137.757 | 120.203 | 41.277 |
| 2018-04-01 | 113.098 | 137.319 | 120.203 | 41.277 |
| 2018-04-02 | 112.412 | 137.288 | 117.777 | 41.277 |
| 2018-04-03 | 111.621 | 137.333 | 119.549 | 41.005 |
| 2018-04-04 | 109.083 | 133.026 | 121.084 | 40.786 |
| 2018-04-05 | 109.083 | 133.026 | 121.885 | 41.778 |
| 2018-04-06 | 109.083 | 133.026 | 118.6 | 41.372 |
| 2018-04-07 | 109.083 | 133.026 | 118.6 | 41.372 |
| 2018-04-08 | 110.876 | 134.984 | 118.6 | 41.372 |
| 2018-04-09 | 111.178 | 135.329 | 119.458 | 41.522 |
| 2018-04-10 | 112.847 | 137.129 | 121.354 | 41.73 |
| 2018-04-11 | 112.481 | 136.082 | 119.966 | 41.444 |
| 2018-04-12 | 114.061 | 138.442 | 122.573 | 41.909 |
| 2018-04-13 | 114.061 | 138.442 | 120.068 | 41.959 |
| 2018-04-14 | 114.061 | 138.442 | 120.068 | 41.959 |
| 2018-04-15 | 114.697 | 139.126 | 120.068 | 41.959 |
| 2018-04-16 | 115.253 | 141.045 | 120.158 | 41.871 |
| 2018-04-17 | 115.702 | 140.427 | 119.063 | 42.095 |
| 2018-04-18 | 115.702 | 140.427 | 118.409 | 42.138 |
| 2018-04-19 | 115.702 | 140.427 | 120.948 | 42.424 |
| 2018-04-20 | 115.702 | 140.427 | 121.208 | 42.567 |
| 2018-04-21 | 115.702 | 140.427 | 121.208 | 42.567 |
| 2018-04-22 | 116.13 | 141.839 | 121.208 | 42.567 |
| 2018-04-23 | 115.533 | 141.206 | 121.727 | 42.879 |
| 2018-04-24 | 115.451 | 141.087 | 121.806 | 42.831 |
| 2018-04-25 | 113.938 | 140.519 | 121.749 | 42.376 |
| 2018-04-26 | 114.416 | 142.05 | 121.343 | 42.497 |
| 2018-04-27 | 114.416 | 142.05 | 122.291 | 42.438 |
| 2018-04-28 | 114.416 | 142.05 | 122.291 | 42.438 |
| 2018-04-29 | 114.953 | 141.524 | 122.291 | 42.438 |
| 2018-04-30 | 114.119 | 139.247 | 120.767 | 42.495 |
| 2018-05-01 | 113.885 | 139.392 | 120.88 | 42.447 |
| 2018-05-02 | 114.614 | 140.471 | 119.898 | 42.598 |
| 2018-05-03 | 114.131 | 140.741 | 119.029 | 42.018 |
| 2018-05-04 | 114.131 | 140.741 | 120.203 | 42.083 |
| 2018-05-05 | 114.131 | 140.741 | 120.203 | 42.083 |
| 2018-05-06 | 114.84 | 141.129 | 120.203 | 42.083 |
| 2018-05-07 | 114.667 | 142.654 | 120.847 | 42.128 |
| 2018-05-08 | 113.704 | 143.068 | 122.088 | 42.092 |
| 2018-05-09 | 114.045 | 143.602 | 124.029 | 42.531 |
| 2018-05-10 | 114.231 | 142.845 | 125.011 | 42.664 |
| 2018-05-11 | 114.231 | 142.845 | 125.09 | 42.884 |
| 2018-05-12 | 114.231 | 142.845 | 125.09 | 42.884 |
| 2018-05-13 | 115.217 | 144.225 | 125.09 | 42.884 |
| 2018-05-14 | 115.261 | 145.114 | 124.955 | 42.681 |
| 2018-05-15 | 115.583 | 144.985 | 125.293 | 42.767 |
| 2018-05-16 | 116.249 | 145.439 | 125.192 | 42.202 |
| 2018-05-17 | 117.123 | 146.948 | 125.26 | 42.211 |
| 2018-05-18 | 117.123 | 146.948 | 123.6 | 41.811 |
| 2018-05-19 | 117.123 | 146.948 | 123.6 | 41.811 |
| 2018-05-20 | 117.123 | 146.948 | 123.6 | 41.811 |
| 2018-05-21 | 118.023 | 149.7 | 123.984 | 41.711 |
| 2018-05-22 | 117.582 | 148.135 | 125.147 | 42.261 |
| 2018-05-23 | 116.804 | 148.021 | 124.3 | 41.716 |
| 2018-05-24 | 117.106 | 146.672 | 123.612 | 41.186 |
| 2018-05-25 | 117.106 | 146.672 | 122.946 | 40.862 |
| 2018-05-26 | 117.106 | 146.672 | 122.946 | 40.862 |
| 2018-05-27 | 117.945 | 147.855 | 122.946 | 40.862 |
| 2018-05-28 | 117.742 | 147.423 | 122.946 | 40.516 |
| 2018-05-29 | 116.918 | 143.521 | 118.115 | 39.229 |
| 2018-05-30 | 117.244 | 143.055 | 120.305 | 39.179 |
| 2018-05-31 | 117.308 | 144.046 | 119.571 | 38.657 |
| 2018-06-01 | 117.308 | 144.046 | 121.321 | 39.455 |
| 2018-06-02 | 117.308 | 144.046 | 121.321 | 39.455 |
| 2018-06-03 | 117.861 | 145.306 | 121.321 | 39.455 |
| 2018-06-04 | 118.323 | 145.806 | 121.828 | 39.61 |
| 2018-06-05 | 119.029 | 145.813 | 121.253 | 38.924 |
| 2018-06-06 | 118.767 | 145.247 | 123.758 | 39.2 |
| 2018-06-07 | 119.292 | 145.732 | 123.905 | 39.32 |
| 2018-06-08 | 119.292 | 145.732 | 124.153 | 39.05 |
| 2018-06-09 | 119.292 | 145.732 | 124.153 | 39.05 |
| 2018-06-10 | 119.219 | 145.024 | 124.153 | 39.05 |
| 2018-06-11 | 119.662 | 145.621 | 123.386 | 39.77 |
| 2018-06-12 | 119.569 | 144.084 | 123.138 | 39.799 |
| 2018-06-13 | 119.677 | 143.551 | 122.607 | 39.615 |
| 2018-06-14 | 119.695 | 144.424 | 121.445 | 39.851 |
| 2018-06-15 | 119.695 | 144.424 | 121.524 | 39.096 |
| 2018-06-16 | 119.695 | 144.424 | 121.524 | 39.096 |
| 2018-06-17 | 119.637 | 144.431 | 121.524 | 39.096 |
| 2018-06-18 | 118.897 | 144.105 | 121.727 | 38.888 |
| 2018-06-19 | 118.255 | 143.562 | 121.749 | 38.902 |
| 2018-06-20 | 119.132 | 143.993 | 121.614 | 39.143 |
| 2018-06-21 | 118.386 | 142.477 | 121.659 | 38.583 |
| 2018-06-22 | 118.386 | 142.477 | 120.418 | 39.1 |
| 2018-06-23 | 118.386 | 142.477 | 120.418 | 39.1 |
| 2018-06-24 | 118.931 | 145.07 | 120.418 | 39.1 |
| 2018-06-25 | 117.849 | 143.673 | 119.086 | 38.237 |
| 2018-06-26 | 117.952 | 143.695 | 118.363 | 38.213 |
| 2018-06-27 | 117.963 | 144.419 | 116.783 | 38.206 |
| 2018-06-28 | 117.097 | 143.085 | 117.46 | 38.19 |
| 2018-06-29 | 117.097 | 143.085 | 117.257 | 38.43 |
| 2018-06-30 | 117.097 | 143.085 | 117.257 | 38.43 |
| 2018-07-01 | 117.418 | 143.416 | 117.257 | 38.43 |
| 2018-07-02 | 116.993 | 143.05 | 118.341 | 38.063 |
| 2018-07-03 | 117.613 | 143.818 | 116.953 | 38.318 |
| 2018-07-04 | 117.417 | 144.009 | 116.953 | 38.449 |
| 2018-07-05 | 117.179 | 145.535 | 117.088 | 38.752 |
| 2018-07-06 | 117.179 | 145.535 | 117.754 | 38.728 |
| 2018-07-07 | 117.179 | 145.535 | 117.754 | 38.728 |
| 2018-07-08 | 117.74 | 146.027 | 117.754 | 38.728 |
| 2018-07-09 | 117.957 | 147.848 | 120.858 | 39.022 |
| 2018-07-10 | 118.649 | 148.6 | 120.034 | 38.783 |
| 2018-07-11 | 118.323 | 147.247 | 119.3 | 38.259 |
| 2018-07-12 | 119.025 | 147.359 | 119.153 | 38.333 |
| 2018-07-13 | 119.025 | 147.359 | 117.98 | 38.304 |
| 2018-07-14 | 119.025 | 147.359 | 117.98 | 38.304 |
| 2018-07-15 | 119.067 | 146.55 | 117.98 | 38.304 |
| 2018-07-16 | 118.846 | 145.927 | 120.429 | 38.435 |
| 2018-07-17 | 118.86 | 146.298 | 120.756 | 38.356 |
| 2018-07-18 | 119.008 | 146.378 | 122.212 | 38.383 |
| 2018-07-19 | 118.781 | 146.672 | 120.53 | 38.306 |
| 2018-07-20 | 118.781 | 146.672 | 120.7 | 38.285 |
| 2018-07-21 | 118.781 | 146.672 | 120.7 | 38.285 |
| 2018-07-22 | 118.781 | 146.672 | 120.7 | 38.285 |
| 2018-07-23 | 118.81 | 146.605 | 122.923 | 38.533 |
| 2018-07-24 | 119.914 | 148.25 | 123.002 | 39.365 |
| 2018-07-25 | 120.479 | 149.962 | 122.889 | 39.155 |
| 2018-07-26 | 120.952 | 152.03 | 123.047 | 39.455 |
| 2018-07-27 | 120.952 | 152.03 | 123.612 | 39.744 |
| 2018-07-28 | 120.952 | 152.03 | 123.612 | 39.744 |
| 2018-07-29 | 120.529 | 152.21 | 123.612 | 39.744 |
| 2018-07-30 | 120.915 | 153.036 | 123.792 | 39.77 |
| 2018-07-31 | 120.996 | 151.777 | 122.957 | 40.073 |
| 2018-08-01 | 121.47 | 149.329 | 123.499 | 39.73 |
| 2018-08-02 | 120.944 | 150.232 | 124.063 | 39.036 |
| 2018-08-03 | 120.944 | 150.232 | 124.537 | 39.315 |
| 2018-08-04 | 120.944 | 150.232 | 124.537 | 39.315 |
| 2018-08-05 | 122.822 | 152.777 | 124.537 | 39.315 |
| 2018-08-06 | 122.845 | 153.086 | 124.537 | 39.081 |
| 2018-08-07 | 122.993 | 153.266 | 124.887 | 39.332 |
| 2018-08-08 | 122.631 | 150.086 | 125.564 | 39.272 |
| 2018-08-09 | 122.123 | 150.708 | 124.616 | 39.231 |
| 2018-08-10 | 122.123 | 150.708 | 123.16 | 38.483 |
| 2018-08-11 | 122.123 | 150.708 | 123.16 | 38.483 |
| 2018-08-12 | 121.957 | 149.576 | 123.16 | 38.483 |
| 2018-08-13 | 121.469 | 148.038 | 121.817 | 38.027 |
| 2018-08-14 | 121.318 | 149.843 | 123.454 | 37.892 |
| 2018-08-15 | 120.621 | 150.84 | 122.246 | 37.477 |
| 2018-08-16 | 121.866 | 151.582 | 123.962 | 37.536 |
| 2018-08-17 | 121.866 | 151.582 | 124.221 | 37.31 |
| 2018-08-18 | 121.866 | 151.582 | 124.221 | 37.31 |
| 2018-08-19 | 122.73 | 151.225 | 124.221 | 37.31 |
| 2018-08-20 | 124.189 | 152.608 | 124.74 | 37.379 |
| 2018-08-21 | 124.795 | 151.099 | 125.497 | 37.648 |
| 2018-08-22 | 124.956 | 151.117 | 125.226 | 37.613 |
| 2018-08-23 | 126.216 | 154.341 | 124.447 | 37.439 |
| 2018-08-24 | 126.216 | 154.341 | 124.447 | 37.429 |
| 2018-08-25 | 126.216 | 154.341 | 124.447 | 37.429 |
| 2018-08-26 | 126.687 | 153.941 | 124.447 | 37.429 |
| 2018-08-27 | 127.703 | 157.353 | 125.779 | 37.591 |
| 2018-08-28 | 127.452 | 156.247 | 125.609 | 37.379 |
| 2018-08-29 | 127.98 | 156.613 | 125.305 | 37.486 |
| 2018-08-30 | 128.301 | 158.269 | 124.233 | 37.093 |
| 2018-08-31 | 128.301 | 158.269 | 124.345 | 36.826 |
| 2018-09-01 | 128.301 | 158.269 | 124.345 | 36.826 |
| 2018-09-02 | 128.993 | 159.466 | 124.345 | 36.826 |
| 2018-09-03 | 128.711 | 157.856 | 124.345 | 36.907 |
| 2018-09-04 | 127.726 | 155.668 | 125.124 | 37.157 |
| 2018-09-05 | 126.097 | 152.368 | 125.181 | 37.296 |
| 2018-09-06 | 126.378 | 153.915 | 124.221 | 36.962 |
| 2018-09-07 | 126.378 | 153.915 | 123.95 | 36.619 |
| 2018-09-08 | 126.378 | 153.915 | 123.95 | 36.619 |
| 2018-09-09 | 126.378 | 153.915 | 123.95 | 36.619 |
| 2018-09-10 | 126.378 | 153.915 | 123.792 | 36.94 |
| 2018-09-11 | 126.378 | 153.915 | 124.097 | 36.79 |
| 2018-09-12 | 126.214 | 153.874 | 122.212 | 36.685 |
| 2018-09-13 | 125.965 | 155.273 | 120.88 | 36.952 |
| 2018-09-14 | 125.965 | 155.273 | 121.4 | 37.043 |
| 2018-09-15 | 125.965 | 155.273 | 121.4 | 37.043 |
| 2018-09-16 | 127.738 | 156.895 | 121.4 | 37.043 |
| 2018-09-17 | 128.383 | 156.005 | 120.903 | 37.331 |
| 2018-09-18 | 128.383 | 156.005 | 120.914 | 37.317 |
| 2018-09-19 | 128.383 | 156.005 | 123.273 | 37.899 |
| 2018-09-20 | 129.338 | 156.43 | 124.763 | 38.435 |
| 2018-09-21 | 129.338 | 156.43 | 124.233 | 38.55 |
| 2018-09-22 | 129.338 | 156.43 | 124.233 | 38.55 |
| 2018-09-23 | 129.338 | 156.43 | 124.233 | 38.55 |
| 2018-09-24 | 129.338 | 156.43 | 122.698 | 38.235 |
| 2018-09-25 | 129.236 | 155.848 | 122.302 | 38.399 |
| 2018-09-26 | 128.317 | 155.755 | 120.474 | 38.447 |
| 2018-09-27 | 127.6 | 155.45 | 119.436 | 38.438 |
| 2018-09-28 | 127.6 | 155.45 | 118.363 | 37.377 |
| 2018-09-29 | 127.6 | 155.45 | 118.363 | 37.377 |
| 2018-09-30 | 127.6 | 155.45 | 118.363 | 37.377 |
| 2018-10-01 | 127.6 | 155.45 | 118.488 | 37.1 |
| 2018-10-02 | 128.201 | 155.96 | 118.296 | 36.74 |
| 2018-10-03 | 128.861 | 155.728 | 120.09 | 36.897 |
| 2018-10-04 | 127.208 | 155.089 | 120.959 | 37.038 |
| 2018-10-05 | 127.208 | 155.089 | 120.26 | 36.669 |
| 2018-10-06 | 127.208 | 155.089 | 120.26 | 36.669 |
| 2018-10-07 | 126.768 | 154.781 | 120.26 | 36.669 |
| 2018-10-08 | 126.18 | 152.913 | 121.14 | 36.168 |
| 2018-10-09 | 126.339 | 154.292 | 120.384 | 36.256 |
| 2018-10-10 | 124.653 | 152.801 | 117.596 | 36.309 |
| 2018-10-11 | 123.339 | 150.894 | 114.345 | 35.438 |
| 2018-10-12 | 123.339 | 150.894 | 113.397 | 35.279 |
| 2018-10-13 | 123.339 | 150.894 | 113.397 | 35.279 |
| 2018-10-14 | 124.026 | 151.113 | 113.397 | 35.279 |
| 2018-10-15 | 123.535 | 149.874 | 112.844 | 35.214 |
| 2018-10-16 | 125.154 | 151.016 | 113.86 | 35.484 |
| 2018-10-17 | 125.074 | 151.699 | 114.831 | 35.31 |
| 2018-10-18 | 125.718 | 153.542 | 112.743 | 34.711 |
| 2018-10-19 | 125.718 | 153.542 | 112.652 | 34.556 |
| 2018-10-20 | 125.718 | 153.542 | 112.652 | 34.556 |
| 2018-10-21 | 124.953 | 152.653 | 112.652 | 34.556 |
| 2018-10-22 | 125.007 | 154.328 | 109.571 | 34.318 |
| 2018-10-23 | 122.773 | 151.324 | 109.199 | 33.832 |
| 2018-10-24 | 123.48 | 150.211 | 105.948 | 33.376 |
| 2018-10-25 | 121.855 | 148.355 | 108.375 | 33.72 |
| 2018-10-26 | 121.855 | 148.355 | 107.032 | 33.352 |
| 2018-10-27 | 121.855 | 148.355 | 107.032 | 33.352 |
| 2018-10-28 | 122.068 | 149.233 | 107.032 | 33.352 |
| 2018-10-29 | 122.27 | 149.982 | 108.465 | 33.998 |
| 2018-10-30 | 122.27 | 149.982 | 109.966 | 33.889 |
| 2018-10-31 | 123.488 | 150.571 | 111.614 | 34.323 |
| 2018-11-01 | 125.314 | 151.302 | 112.212 | 34.699 |
| 2018-11-02 | 125.314 | 151.302 | 112.156 | 35.295 |
| 2018-11-03 | 125.314 | 151.302 | 112.156 | 35.295 |
| 2018-11-04 | 125.177 | 151.152 | 112.156 | 35.295 |
| 2018-11-05 | 125.066 | 151.926 | 113.047 | 34.988 |
| 2018-11-06 | 125.83 | 154.345 | 113.51 | 34.83 |
| 2018-11-07 | 127.886 | 157.671 | 114.56 | 35.243 |
| 2018-11-08 | 128.336 | 159.058 | 114.955 | 35.527 |
| 2018-11-09 | 128.336 | 159.058 | 114.199 | 35.109 |
| 2018-11-10 | 128.336 | 159.058 | 114.199 | 35.109 |
| 2018-11-11 | 128.018 | 159.537 | 114.199 | 35.109 |
| 2018-11-12 | 127.245 | 157.319 | 112.506 | 34.654 |
| 2018-11-13 | 127.548 | 157.595 | 113.262 | 35.183 |
| 2018-11-14 | 126.715 | 157.167 | 111.603 | 34.962 |
| 2018-11-15 | 126.5 | 157.693 | 113.488 | 34.423 |
| 2018-11-16 | 126.5 | 157.693 | 113.284 | 34.156 |
| 2018-11-17 | 126.5 | 157.693 | 113.284 | 34.156 |
| 2018-11-18 | 126.891 | 157.601 | 113.284 | 34.156 |
| 2018-11-19 | 126.627 | 158.465 | 113.409 | 34.096 |
| 2018-11-20 | 124.569 | 153.348 | 111.321 | 33.314 |
| 2018-11-21 | 125.19 | 155.063 | 111.321 | 33.917 |
| 2018-11-22 | 124.377 | 154.317 | 111.321 | 33.689 |
| 2018-11-23 | 124.377 | 154.317 | 110.688 | 33.844 |
| 2018-11-24 | 124.377 | 154.317 | 110.688 | 33.844 |
| 2018-11-25 | 123.738 | 152.632 | 110.688 | 33.844 |
| 2018-11-26 | 125.373 | 157.274 | 113.183 | 34.711 |
| 2018-11-27 | 125.544 | 158.367 | 112.788 | 34.583 |
| 2018-11-28 | 126.529 | 159.546 | 114.436 | 34.552 |
| 2018-11-29 | 126.203 | 157.598 | 113.454 | 34.437 |
| 2018-11-30 | 126.203 | 157.598 | 114.639 | 34.196 |
| 2018-12-01 | 126.203 | 157.598 | 114.639 | 34.196 |
| 2018-12-02 | 127.996 | 158.76 | 114.639 | 34.196 |
| 2018-12-03 | 128.138 | 158.974 | 114.786 | 34.74 |
| 2018-12-04 | 126.517 | 157.097 | 109.21 | 34.122 |
| 2018-12-05 | 127.234 | 156.129 | 109.21 | 33.877 |
| 2018-12-06 | 124.098 | 153.342 | 107.438 | 32.547 |
| 2018-12-07 | 124.098 | 153.342 | 105.26 | 32.668 |
| 2018-12-08 | 124.098 | 153.342 | 105.26 | 32.668 |
| 2018-12-09 | 123.822 | 153.354 | 105.26 | 32.668 |
| 2018-12-10 | 122.931 | 152.722 | 103.036 | 31.798 |
| 2018-12-11 | 123.77 | 151.28 | 101.772 | 32.032 |
| 2018-12-12 | 123.751 | 151.489 | 102.144 | 32.907 |
| 2018-12-13 | 123.895 | 153.009 | 100.474 | 32.959 |
| 2018-12-14 | 123.895 | 153.009 | 99.436 | 32.771 |
| 2018-12-15 | 123.895 | 153.009 | 99.436 | 32.771 |
| 2018-12-16 | 121.659 | 150.778 | 99.436 | 32.771 |
| 2018-12-17 | 121.323 | 152.265 | 98.702 | 32.277 |
| 2018-12-18 | 120.204 | 152.482 | 97.359 | 32.191 |
| 2018-12-19 | 120.992 | 155.082 | 95.339 | 32.253 |
| 2018-12-20 | 118.592 | 154.278 | 94.91 | 31.452 |
| 2018-12-21 | 118.592 | 154.278 | 93.138 | 31.412 |
| 2018-12-22 | 118.592 | 154.278 | 93.138 | 31.412 |
| 2018-12-23 | 112.99 | 148.022 | 93.138 | 31.412 |
| 2018-12-24 | 110.654 | 143.012 | 91.174 | 31.181 |
| 2018-12-25 | 112.759 | 147.867 | 91.174 | 31.181 |
| 2018-12-26 | 113.101 | 147.849 | 95.564 | 31.181 |
| 2018-12-27 | 112.929 | 145.017 | 95.982 | 30.697 |
| 2018-12-28 | 112.929 | 145.017 | 96.106 | 31.429 |
| 2018-12-29 | 112.929 | 145.017 | 96.106 | 31.429 |
| 2018-12-30 | 114.411 | 145.506 | 96.106 | 31.429 |
| 2018-12-31 | 114.569 | 145.521 | 96.828 | 31.564 |
| 2019-01-01 | 115.92 | 148.611 | 96.828 | 31.564 |
| 2019-01-02 | 114.656 | 146.549 | 98.578 | 31.457 |
| 2019-01-03 | 113.45 | 145.166 | 97.314 | 31.336 |
| 2019-01-04 | 113.45 | 145.166 | 100.655 | 32.57 |
| 2019-01-05 | 113.45 | 145.166 | 100.655 | 32.57 |
| 2019-01-06 | 115.751 | 147.914 | 100.655 | 32.57 |
| 2019-01-07 | 116.29 | 148.009 | 101.084 | 32.513 |
| 2019-01-08 | 117.234 | 147.772 | 101.196 | 32.697 |
| 2019-01-09 | 117.48 | 149.276 | 102.054 | 32.58 |
| 2019-01-10 | 116.899 | 148.658 | 101.738 | 32.864 |
| 2019-01-11 | 116.899 | 148.658 | 102.201 | 32.923 |
| 2019-01-12 | 116.899 | 148.658 | 102.201 | 32.923 |
| 2019-01-13 | 116.392 | 147.425 | 102.201 | 32.923 |
| 2019-01-14 | 115.846 | 146.56 | 103.42 | 32.933 |
| 2019-01-15 | 116.658 | 147.225 | 104.47 | 32.871 |
| 2019-01-16 | 117.618 | 147.825 | 107.099 | 33.696 |
| 2019-01-17 | 117.606 | 149.4 | 108.194 | 33.29 |
| 2019-01-18 | 117.606 | 149.4 | 110.09 | 34.018 |
| 2019-01-19 | 117.606 | 149.4 | 110.09 | 34.018 |
| 2019-01-20 | 118.744 | 150.407 | 110.09 | 34.018 |
| 2019-01-21 | 118.07 | 148.705 | 110.09 | 33.879 |
| 2019-01-22 | 117.71 | 150.126 | 109.368 | 33.56 |
| 2019-01-23 | 118.223 | 151.201 | 109.289 | 33.686 |
| 2019-01-24 | 118.747 | 152.031 | 109.774 | 33.603 |
| 2019-01-25 | 118.747 | 152.031 | 110.847 | 34.161 |
| 2019-01-26 | 118.747 | 152.031 | 110.847 | 34.161 |
| 2019-01-27 | 119.327 | 152.465 | 110.847 | 34.161 |
| 2019-01-28 | 119.539 | 152.752 | 110.722 | 33.6 |
| 2019-01-29 | 119.887 | 154.188 | 110.113 | 33.677 |
| 2019-01-30 | 120.598 | 154.346 | 109.989 | 33.739 |
| 2019-01-31 | 121.442 | 154.977 | 108.871 | 33.076 |
| 2019-02-01 | 121.442 | 154.977 | 109.176 | 32.928 |
| 2019-02-02 | 121.442 | 154.977 | 109.176 | 32.928 |
| 2019-02-03 | 121.626 | 155.083 | 109.176 | 32.928 |
| 2019-02-04 | 121.553 | 155.686 | 109.797 | 32.721 |
| 2019-02-05 | 122.227 | 156.353 | 109.413 | 33.207 |
| 2019-02-06 | 121.592 | 155.336 | 109.312 | 33.546 |
| 2019-02-07 | 120.427 | 153.769 | 109.819 | 32.814 |
| 2019-02-08 | 120.427 | 153.769 | 108.928 | 32.547 |
| 2019-02-09 | 120.427 | 153.769 | 108.928 | 32.547 |
| 2019-02-10 | 120.408 | 154.071 | 108.928 | 32.547 |
| 2019-02-11 | 120.849 | 154.073 | 109.187 | 32.94 |
| 2019-02-12 | 121.445 | 154.444 | 110.779 | 33.197 |
| 2019-02-13 | 122.099 | 155.818 | 110.666 | 33.288 |
| 2019-02-14 | 121.942 | 154.779 | 109.594 | 32.868 |
| 2019-02-15 | 121.942 | 154.779 | 112.19 | 33.743 |
| 2019-02-16 | 121.942 | 154.779 | 112.19 | 33.743 |
| 2019-02-17 | 122.714 | 155.272 | 112.19 | 33.743 |
| 2019-02-18 | 122.796 | 155.32 | 112.19 | 33.889 |
| 2019-02-19 | 122.612 | 155.288 | 112.743 | 33.579 |
| 2019-02-20 | 123.434 | 156.632 | 113.792 | 33.71 |
| 2019-02-21 | 122.779 | 156.36 | 113.07 | 33.104 |
| 2019-02-22 | 122.779 | 156.36 | 112.856 | 33.162 |
| 2019-02-23 | 122.779 | 156.36 | 112.856 | 33.162 |
| 2019-02-24 | 123.24 | 156.574 | 112.856 | 33.162 |
| 2019-02-25 | 124.22 | 157.126 | 113.115 | 33.543 |
| 2019-02-26 | 123.755 | 157.143 | 112.528 | 33.698 |
| 2019-02-27 | 122.478 | 155.597 | 113.375 | 34.203 |
| 2019-02-28 | 123.002 | 156.197 | 113.014 | 34.499 |
| 2019-03-01 | 123.002 | 156.197 | 113.499 | 34.361 |
| 2019-03-02 | 123.002 | 156.197 | 113.499 | 34.361 |
| 2019-03-03 | 123.637 | 156.079 | 113.499 | 34.361 |
| 2019-03-04 | 124.14 | 156.674 | 112.856 | 34.373 |
| 2019-03-05 | 123.074 | 156.561 | 112.698 | 34.225 |
| 2019-03-06 | 122.789 | 157.395 | 111.321 | 34.282 |
| 2019-03-07 | 121.016 | 155.185 | 109.763 | 33.638 |
| 2019-03-08 | 121.016 | 155.185 | 109.989 | 33.14 |
| 2019-03-09 | 121.016 | 155.185 | 109.989 | 33.14 |
| 2019-03-10 | 120.669 | 154.528 | 109.989 | 33.14 |
| 2019-03-11 | 121.362 | 155.091 | 110.801 | 33.643 |
| 2019-03-12 | 120.942 | 155.233 | 110.847 | 33.569 |
| 2019-03-13 | 122.337 | 158.746 | 111.93 | 33.894 |
| 2019-03-14 | 121.879 | 157.201 | 112.596 | 34.187 |
| 2019-03-15 | 121.879 | 157.201 | 112.889 | 34.43 |
| 2019-03-16 | 121.879 | 157.201 | 112.889 | 34.43 |
| 2019-03-17 | 122.734 | 157.836 | 112.889 | 34.43 |
| 2019-03-18 | 122.463 | 158.106 | 114.379 | 34.83 |
| 2019-03-19 | 122.413 | 159.853 | 112.867 | 34.883 |
| 2019-03-20 | 121.951 | 160.232 | 109.458 | 34.401 |
| 2019-03-21 | 121.951 | 160.232 | 107.788 | 33.932 |
| 2019-03-22 | 121.951 | 160.232 | 103.567 | 33.202 |
| 2019-03-23 | 121.951 | 160.232 | 103.567 | 33.202 |
| 2019-03-24 | 120.431 | 157.688 | 103.567 | 33.202 |
| 2019-03-25 | 119.7 | 156.745 | 103.126 | 33.104 |
| 2019-03-26 | 121.399 | 157.474 | 104.831 | 33.047 |
| 2019-03-27 | 121.629 | 155.53 | 104.357 | 33.312 |
| 2019-03-28 | 120.688 | 154.835 | 105.587 | 32.89 |
| 2019-03-29 | 120.688 | 154.835 | 105.621 | 32.971 |
| 2019-03-30 | 120.688 | 154.835 | 105.621 | 32.971 |
| 2019-03-31 | 121.861 | 155.921 | 105.621 | 32.971 |
| 2019-04-01 | 122.927 | 156.346 | 108.713 | 33.846 |
| 2019-04-02 | 122.924 | 156.454 | 109.029 | 34.075 |
| 2019-04-03 | 123.295 | 159.639 | 109.47 | 34.654 |
| 2019-04-04 | 122.335 | 159.347 | 110.372 | 34.721 |
| 2019-04-05 | 122.335 | 159.347 | 110.192 | 34.561 |
| 2019-04-06 | 122.335 | 159.347 | 110.192 | 34.561 |
| 2019-04-07 | 123.26 | 159.965 | 110.192 | 34.561 |
| 2019-04-08 | 123.946 | 161.426 | 110.508 | 34.42 |
| 2019-04-09 | 123.946 | 161.426 | 109.12 | 34.466 |
| 2019-04-10 | 125.054 | 163.593 | 109.628 | 34.363 |
| 2019-04-11 | 125.636 | 163.742 | 110.203 | 34.761 |
| 2019-04-12 | 125.636 | 163.742 | 112.336 | 35.429 |
| 2019-04-13 | 125.636 | 163.742 | 112.336 | 35.429 |
| 2019-04-14 | 126.56 | 164.598 | 112.336 | 35.429 |
| 2019-04-15 | 126.48 | 163.951 | 111.23 | 35.586 |
| 2019-04-16 | 127.138 | 165.596 | 112.991 | 35.887 |
| 2019-04-17 | 126.265 | 162.884 | 112.968 | 36.149 |
| 2019-04-18 | 125.472 | 162.471 | 112.427 | 36.17 |
| 2019-04-19 | 125.472 | 162.471 | 112.427 | 36.17 |
| 2019-04-20 | 125.472 | 162.471 | 112.427 | 36.17 |
| 2019-04-21 | 126.176 | 163.472 | 112.427 | 36.17 |
| 2019-04-22 | 125.6 | 162.122 | 112.28 | 36.17 |
| 2019-04-23 | 126.331 | 162.709 | 113.104 | 35.798 |
| 2019-04-24 | 127.583 | 165.229 | 112.923 | 35.427 |
| 2019-04-25 | 127.583 | 165.229 | 113.115 | 35.214 |
| 2019-04-26 | 127.583 | 165.229 | 114.221 | 35.331 |
| 2019-04-27 | 127.583 | 165.229 | 114.221 | 35.331 |
| 2019-04-28 | 128.454 | 166.598 | 114.221 | 35.331 |
| 2019-04-29 | 127.805 | 165.694 | 115.553 | 35.677 |
| 2019-04-30 | 126.207 | 166.229 | 115.395 | 35.457 |
| 2019-05-01 | 126.005 | 169.291 | 114.221 | 35.484 |
| 2019-05-02 | 125.247 | 167.138 | 114.977 | 35.441 |
| 2019-05-03 | 125.247 | 167.138 | 115.88 | 35.541 |
| 2019-05-04 | 125.247 | 167.138 | 115.88 | 35.541 |
| 2019-05-05 | 125.591 | 166.982 | 115.88 | 35.541 |
| 2019-05-06 | 124.494 | 165.067 | 115.203 | 35.083 |
| 2019-05-07 | 125.431 | 166.087 | 112.833 | 34.232 |
| 2019-05-08 | 125.431 | 166.087 | 112.111 | 34.142 |
| 2019-05-09 | 125.431 | 166.087 | 111.998 | 33.369 |
| 2019-05-10 | 125.431 | 166.087 | 112.393 | 33.457 |
| 2019-05-11 | 125.431 | 166.087 | 112.393 | 33.457 |
| 2019-05-12 | 124.856 | 166.608 | 112.393 | 33.457 |
| 2019-05-13 | 122.034 | 161.823 | 108.386 | 32.911 |
| 2019-05-14 | 123.407 | 164.571 | 109.368 | 33.19 |
| 2019-05-15 | 122.94 | 162.587 | 108.138 | 33.162 |
| 2019-05-16 | 124.839 | 165.407 | 109.357 | 33.526 |
| 2019-05-17 | 124.839 | 165.407 | 108.691 | 33.162 |
| 2019-05-18 | 124.839 | 165.407 | 108.691 | 33.162 |
| 2019-05-19 | 124.928 | 166.397 | 108.691 | 33.162 |
| 2019-05-20 | 124.076 | 165.39 | 108.984 | 32.635 |
| 2019-05-21 | 124.936 | 165.355 | 109.944 | 32.849 |
| 2019-05-22 | 125.802 | 164.79 | 109.12 | 32.463 |
| 2019-05-23 | 124.445 | 164.299 | 107.122 | 32.072 |
| 2019-05-24 | 124.445 | 164.299 | 108.172 | 32.175 |
| 2019-05-25 | 124.445 | 164.299 | 108.172 | 32.175 |
| 2019-05-26 | 124.98 | 167.611 | 108.172 | 32.175 |
| 2019-05-27 | 124.545 | 168.401 | 108.172 | 32.141 |
| 2019-05-28 | 124.454 | 168.25 | 106.625 | 32.032 |
| 2019-05-29 | 122.875 | 165.856 | 106.749 | 31.665 |
| 2019-05-30 | 123.31 | 165.755 | 105.418 | 31.781 |
| 2019-05-31 | 123.31 | 165.755 | 103.646 | 31.352 |
| 2019-06-01 | 123.31 | 165.755 | 103.646 | 31.352 |
| 2019-06-02 | 121.658 | 165.382 | 103.646 | 31.352 |
| 2019-06-03 | 121.951 | 165.072 | 104.503 | 31.209 |
| 2019-06-04 | 122.991 | 165.005 | 108.183 | 31.831 |
| 2019-06-05 | 123.396 | 165.564 | 108.014 | 31.686 |
| 2019-06-06 | 122.961 | 164.504 | 108.217 | 31.367 |
| 2019-06-07 | 122.961 | 164.504 | 107.46 | 31.443 |
| 2019-06-08 | 122.961 | 164.504 | 107.46 | 31.443 |
| 2019-06-09 | 122.961 | 164.504 | 107.46 | 31.443 |
| 2019-06-10 | 124.57 | 166.8 | 108.691 | 31.788 |
| 2019-06-11 | 124.024 | 165.997 | 109.233 | 31.858 |
| 2019-06-12 | 123.267 | 164.562 | 107.946 | 31.5 |
| 2019-06-13 | 124.33 | 166.854 | 108.262 | 31.493 |
| 2019-06-14 | 124.33 | 166.854 | 108.679 | 31.269 |
| 2019-06-15 | 124.33 | 166.854 | 108.679 | 31.269 |
| 2019-06-16 | 124.095 | 167.491 | 108.679 | 31.269 |
| 2019-06-17 | 123.472 | 167.328 | 107.235 | 31.297 |
| 2019-06-18 | 124.581 | 167.427 | 108.928 | 31.686 |
| 2019-06-19 | 124.937 | 167.343 | 107.867 | 32.115 |
| 2019-06-20 | 125.776 | 167.646 | 108.138 | 31.7 |
| 2019-06-21 | 125.776 | 167.646 | 108.318 | 31.533 |
| 2019-06-22 | 125.776 | 167.646 | 108.318 | 31.533 |
| 2019-06-23 | 125.843 | 167.666 | 108.318 | 31.533 |
| 2019-06-24 | 125.853 | 168.649 | 107.709 | 31.293 |
| 2019-06-25 | 125.305 | 168.899 | 107.381 | 31.152 |
| 2019-06-26 | 125.692 | 170.312 | 107.607 | 31.464 |
| 2019-06-27 | 126.134 | 171.785 | 108.454 | 31.703 |
| 2019-06-28 | 126.134 | 171.785 | 110.598 | 31.843 |
| 2019-06-29 | 126.134 | 171.785 | 110.598 | 31.843 |
| 2019-06-30 | 127.629 | 170.544 | 110.598 | 31.843 |
| 2019-07-01 | 127.506 | 171.021 | 111.761 | 32.094 |
| 2019-07-02 | 127.487 | 172.638 | 110.722 | 32.12 |
| 2019-07-03 | 127.834 | 174.715 | 111.524 | 32.578 |
| 2019-07-04 | 128.118 | 174.987 | 111.524 | 32.895 |
| 2019-07-05 | 128.118 | 174.987 | 112.438 | 33.004 |
| 2019-07-06 | 128.118 | 174.987 | 112.438 | 33.004 |
| 2019-07-07 | 127.849 | 174.326 | 112.438 | 33.004 |
| 2019-07-08 | 127.11 | 174.565 | 111.264 | 32.675 |
| 2019-07-09 | 127.598 | 176.367 | 111.986 | 32.458 |
| 2019-07-10 | 127.942 | 176.143 | 110.767 | 32.528 |
| 2019-07-11 | 127.904 | 175.62 | 111.84 | 32.621 |
| 2019-07-12 | 127.904 | 175.62 | 112.28 | 32.69 |
| 2019-07-13 | 127.904 | 175.62 | 112.28 | 32.69 |
| 2019-07-14 | 128.468 | 174.939 | 112.28 | 32.69 |
| 2019-07-15 | 128.143 | 174.368 | 111.016 | 32.68 |
| 2019-07-16 | 127.906 | 172.682 | 110.305 | 32.914 |
| 2019-07-17 | 126.639 | 172.126 | 110.068 | 32.42 |
| 2019-07-18 | 125.657 | 171.099 | 111.185 | 32.299 |
| 2019-07-19 | 125.657 | 171.099 | 111.907 | 32.051 |
| 2019-07-20 | 125.657 | 171.099 | 111.907 | 32.051 |
| 2019-07-21 | 125.815 | 170.508 | 111.907 | 32.051 |
| 2019-07-22 | 126.265 | 171.042 | 112.02 | 31.955 |
| 2019-07-23 | 127.482 | 172.925 | 113.826 | 32.566 |
| 2019-07-24 | 128.851 | 174.358 | 115.553 | 32.33 |
| 2019-07-25 | 128.772 | 174.707 | 114.718 | 32.227 |
| 2019-07-26 | 128.772 | 174.707 | 116.388 | 32.034 |
| 2019-07-27 | 128.772 | 174.707 | 116.388 | 32.034 |
| 2019-07-28 | 129.741 | 175.486 | 116.388 | 32.034 |
| 2019-07-29 | 129.261 | 175.365 | 115.237 | 31.824 |
| 2019-07-30 | 128.916 | 173.985 | 115.474 | 31.069 |
| 2019-07-31 | 130.067 | 174.004 | 115.158 | 31.023 |
| 2019-08-01 | 130.489 | 175.577 | 110.959 | 31.178 |
| 2019-08-02 | 130.489 | 175.577 | 110.598 | 30.198 |
| 2019-08-03 | 130.489 | 175.577 | 110.598 | 30.198 |
| 2019-08-04 | 130.246 | 175.636 | 110.598 | 30.198 |
| 2019-08-05 | 127.623 | 172.682 | 106.58 | 29.538 |
| 2019-08-06 | 128.196 | 175.314 | 107.698 | 29.364 |
| 2019-08-07 | 127.124 | 174.684 | 105.395 | 29.137 |
| 2019-08-08 | 129.561 | 177.895 | 107.077 | 29.548 |
| 2019-08-09 | 129.561 | 177.895 | 106.637 | 28.968 |
| 2019-08-10 | 129.561 | 177.895 | 106.637 | 28.968 |
| 2019-08-11 | 129.561 | 177.895 | 106.637 | 28.968 |
| 2019-08-12 | 128.898 | 175.656 | 104.447 | 28.441 |
| 2019-08-13 | 129.683 | 176.087 | 105.35 | 28.718 |
| 2019-08-14 | 126.425 | 171.462 | 101.185 | 27.974 |
| 2019-08-15 | 125.262 | 167.929 | 100.79 | 27.893 |
| 2019-08-16 | 125.262 | 167.929 | 103.352 | 28.558 |
| 2019-08-17 | 125.262 | 167.929 | 103.352 | 28.558 |
| 2019-08-18 | 125.717 | 169.155 | 103.352 | 28.558 |
| 2019-08-19 | 127.497 | 172.445 | 104.56 | 28.72 |
| 2019-08-20 | 128.065 | 171.977 | 102.777 | 28.42 |
| 2019-08-21 | 128.995 | 172.692 | 103.239 | 28.52 |
| 2019-08-22 | 129.431 | 172.39 | 104.041 | 28.818 |
| 2019-08-23 | 129.431 | 172.39 | 101.095 | 28.415 |
| 2019-08-24 | 129.431 | 172.39 | 101.095 | 28.415 |
| 2019-08-25 | 125.444 | 167.915 | 101.095 | 28.415 |
| 2019-08-26 | 126.452 | 170.532 | 102.043 | 28.475 |
| 2019-08-27 | 126.298 | 169.226 | 101.095 | 28.463 |
| 2019-08-28 | 125.524 | 167.34 | 102.506 | 28.403 |
| 2019-08-29 | 127.229 | 168.184 | 104.503 | 28.758 |
| 2019-08-30 | 127.229 | 168.184 | 105.068 | 28.861 |
| 2019-08-31 | 127.229 | 168.184 | 105.068 | 28.861 |
| 2019-09-01 | 127.211 | 168.566 | 105.068 | 28.861 |
| 2019-09-02 | 127.084 | 167.984 | 105.068 | 28.828 |
| 2019-09-03 | 126.2 | 166.678 | 103.194 | 28.689 |
| 2019-09-04 | 127.071 | 168.47 | 104.402 | 29.044 |
| 2019-09-05 | 127.287 | 169.703 | 107.111 | 29.788 |
| 2019-09-06 | 127.287 | 169.703 | 106.772 | 29.843 |
| 2019-09-07 | 127.287 | 169.703 | 106.772 | 29.843 |
| 2019-09-08 | 128.026 | 169.841 | 106.772 | 29.843 |
| 2019-09-09 | 128.223 | 170.169 | 110.621 | 30.53 |
| 2019-09-10 | 128.702 | 169.863 | 112.494 | 31.169 |
| 2019-09-11 | 129.989 | 171.969 | 113.33 | 31.355 |
| 2019-09-12 | 130.667 | 173.018 | 113.702 | 31.333 |
| 2019-09-13 | 130.667 | 173.018 | 115.056 | 32.191 |
| 2019-09-14 | 130.667 | 173.018 | 115.056 | 32.191 |
| 2019-09-15 | 130.339 | 171.16 | 115.056 | 32.191 |
| 2019-09-16 | 130.285 | 169.651 | 114.898 | 31.805 |
| 2019-09-17 | 130.285 | 169.651 | 114.029 | 31.159 |
| 2019-09-18 | 130.876 | 173.547 | 114.74 | 31.04 |
| 2019-09-19 | 131.317 | 173.495 | 114.074 | 31.619 |
| 2019-09-20 | 131.317 | 173.495 | 113.307 | 31.865 |
| 2019-09-21 | 131.317 | 173.495 | 113.307 | 31.865 |
| 2019-09-22 | 130.652 | 173.256 | 113.307 | 31.865 |
| 2019-09-23 | 130.566 | 171.588 | 113.499 | 31.188 |
| 2019-09-24 | 130.995 | 172.694 | 112.043 | 30.999 |
| 2019-09-25 | 130.666 | 173.407 | 113.363 | 30.971 |
| 2019-09-26 | 131.703 | 175.292 | 112.585 | 31.011 |